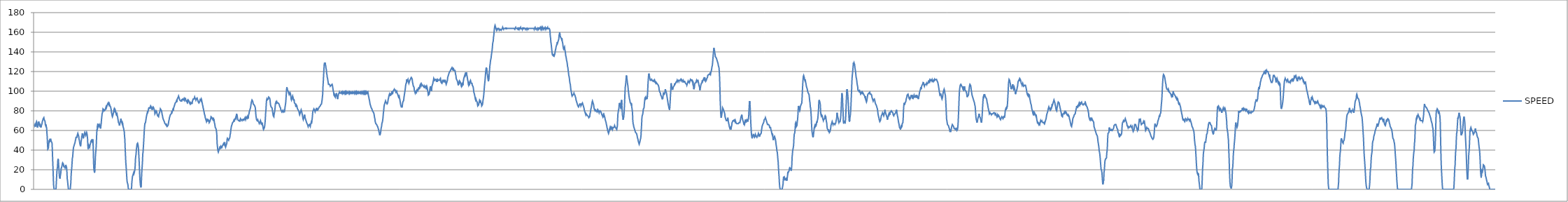
| Category | SPEED |
|---|---|
| 2015-01-01_00:25:59 | 66 |
| 2015-01-01_00:26:00 | 65 |
| 2015-01-01_00:26:01 | 66 |
| 2015-01-01_00:26:02 | 65 |
| 2015-01-01_00:26:03 | 64 |
| 2015-01-01_00:26:03 | 67 |
| 2015-01-01_00:26:05 | 67 |
| 2015-01-01_00:26:06 | 69 |
| 2015-01-01_00:26:07 | 68 |
| 2015-01-01_00:26:08 | 65 |
| 2015-01-01_00:26:09 | 63 |
| 2015-01-01_00:26:10 | 63 |
| 2015-01-01_00:26:11 | 63 |
| 2015-01-01_00:26:12 | 67 |
| 2015-01-01_00:26:13 | 69 |
| 2015-01-01_00:26:14 | 68 |
| 2015-01-01_00:26:15 | 66 |
| 2015-01-01_00:26:16 | 65 |
| 2015-01-01_00:26:17 | 65 |
| 2015-01-01_00:26:18 | 66 |
| 2015-01-01_00:26:19 | 65 |
| 2015-01-01_00:26:20 | 63 |
| 2015-01-01_00:26:21 | 63 |
| 2015-01-01_00:26:22 | 65 |
| 2015-01-01_00:26:23 | 65 |
| 2015-01-01_00:26:24 | 67 |
| 2015-01-01_00:26:25 | 69 |
| 2015-01-01_00:26:26 | 70 |
| 2015-01-01_00:26:27 | 70 |
| 2015-01-01_00:26:28 | 72 |
| 2015-01-01_00:26:29 | 72 |
| 2015-01-01_00:26:30 | 73 |
| 2015-01-01_00:26:31 | 71 |
| 2015-01-01_00:26:32 | 71 |
| 2015-01-01_00:26:33 | 70 |
| 2015-01-01_00:26:34 | 69 |
| 2015-01-01_00:26:35 | 66 |
| 2015-01-01_00:26:36 | 65 |
| 2015-01-01_00:26:37 | 66 |
| 2015-01-01_00:26:38 | 64 |
| 2015-01-01_00:26:39 | 63 |
| 2015-01-01_00:26:40 | 58 |
| 2015-01-01_00:26:41 | 54 |
| 2015-01-01_00:26:42 | 47 |
| 2015-01-01_00:26:43 | 41 |
| 2015-01-01_00:26:44 | 41 |
| 2015-01-01_00:26:45 | 42 |
| 2015-01-01_00:26:46 | 46 |
| 2015-01-01_00:26:47 | 48 |
| 2015-01-01_00:26:48 | 50 |
| 2015-01-01_00:26:49 | 48 |
| 2015-01-01_00:26:50 | 51 |
| 2015-01-01_00:26:51 | 51 |
| 2015-01-01_00:26:52 | 51 |
| 2015-01-01_00:26:53 | 51 |
| 2015-01-01_00:26:54 | 49 |
| 2015-01-01_00:26:55 | 49 |
| 2015-01-01_00:26:56 | 48 |
| 2015-01-01_00:26:57 | 47 |
| 2015-01-01_00:26:58 | 40 |
| 2015-01-01_00:26:59 | 31 |
| 2015-01-01_00:27:00 | 23 |
| 2015-01-01_00:27:01 | 14 |
| 2015-01-01_00:27:02 | 5 |
| 2015-01-01_00:27:03 | 2 |
| 2015-01-01_00:27:04 | 0 |
| 2015-01-01_00:27:05 | 0 |
| 2015-01-01_00:27:06 | 0 |
| 2015-01-01_00:27:07 | 0 |
| 2015-01-01_00:27:08 | 0 |
| 2015-01-01_00:27:09 | 0 |
| 2015-01-01_00:27:10 | 0 |
| 2015-01-01_00:27:11 | 6 |
| 2015-01-01_00:27:12 | 12 |
| 2015-01-01_00:27:13 | 18 |
| 2015-01-01_00:27:14 | 21 |
| 2015-01-01_00:27:15 | 23 |
| 2015-01-01_00:27:16 | 29 |
| 2015-01-01_00:27:17 | 31 |
| 2015-01-01_00:27:18 | 29 |
| 2015-01-01_00:27:19 | 24 |
| 2015-01-01_00:27:20 | 20 |
| 2015-01-01_00:27:21 | 14 |
| 2015-01-01_00:27:22 | 12 |
| 2015-01-01_00:27:23 | 11 |
| 2015-01-01_00:27:24 | 13 |
| 2015-01-01_00:27:25 | 15 |
| 2015-01-01_00:27:26 | 17 |
| 2015-01-01_00:27:27 | 21 |
| 2015-01-01_00:27:28 | 22 |
| 2015-01-01_00:27:29 | 23 |
| 2015-01-01_00:27:30 | 24 |
| 2015-01-01_00:27:31 | 26 |
| 2015-01-01_00:27:32 | 27 |
| 2015-01-01_00:27:33 | 27 |
| 2015-01-01_00:27:34 | 26 |
| 2015-01-01_00:27:35 | 25 |
| 2015-01-01_00:27:36 | 23 |
| 2015-01-01_00:27:37 | 23 |
| 2015-01-01_00:27:38 | 23 |
| 2015-01-01_00:27:39 | 23 |
| 2015-01-01_00:27:40 | 22 |
| 2015-01-01_00:27:41 | 23 |
| 2015-01-01_00:27:42 | 25 |
| 2015-01-01_00:27:43 | 25 |
| 2015-01-01_00:27:44 | 23 |
| 2015-01-01_00:27:45 | 22 |
| 2015-01-01_00:27:46 | 18 |
| 2015-01-01_00:27:47 | 11 |
| 2015-01-01_00:27:48 | 9 |
| 2015-01-01_00:27:49 | 6 |
| 2015-01-01_00:27:50 | 3 |
| 2015-01-01_00:27:51 | 0 |
| 2015-01-01_00:27:52 | 0 |
| 2015-01-01_00:27:53 | 0 |
| 2015-01-01_00:27:54 | 0 |
| 2015-01-01_00:27:55 | 0 |
| 2015-01-01_00:27:56 | 0 |
| 2015-01-01_00:27:57 | 0 |
| 2015-01-01_00:27:58 | 0 |
| 2015-01-01_00:27:59 | 7 |
| 2015-01-01_00:28:00 | 15 |
| 2015-01-01_00:28:01 | 19 |
| 2015-01-01_00:28:02 | 22 |
| 2015-01-01_00:28:03 | 27 |
| 2015-01-01_00:28:04 | 32 |
| 2015-01-01_00:28:05 | 33 |
| 2015-01-01_00:28:06 | 37 |
| 2015-01-01_00:28:07 | 41 |
| 2015-01-01_00:28:08 | 43 |
| 2015-01-01_00:28:09 | 44 |
| 2015-01-01_00:28:10 | 45 |
| 2015-01-01_00:28:11 | 46 |
| 2015-01-01_00:28:12 | 47 |
| 2015-01-01_00:28:13 | 48 |
| 2015-01-01_00:28:14 | 50 |
| 2015-01-01_00:28:15 | 51 |
| 2015-01-01_00:28:16 | 53 |
| 2015-01-01_00:28:17 | 53 |
| 2015-01-01_00:28:18 | 53 |
| 2015-01-01_00:28:19 | 53 |
| 2015-01-01_00:28:20 | 55 |
| 2015-01-01_00:28:21 | 55 |
| 2015-01-01_00:28:22 | 57 |
| 2015-01-01_00:28:23 | 56 |
| 2015-01-01_00:28:24 | 55 |
| 2015-01-01_00:28:25 | 54 |
| 2015-01-01_00:28:26 | 51 |
| 2015-01-01_00:28:27 | 50 |
| 2015-01-01_00:28:28 | 48 |
| 2015-01-01_00:28:29 | 46 |
| 2015-01-01_00:28:30 | 45 |
| 2015-01-01_00:28:31 | 44 |
| 2015-01-01_00:28:32 | 47 |
| 2015-01-01_00:28:33 | 49 |
| 2015-01-01_00:28:34 | 51 |
| 2015-01-01_00:28:35 | 54 |
| 2015-01-01_00:28:36 | 55 |
| 2015-01-01_00:28:37 | 57 |
| 2015-01-01_00:28:38 | 55 |
| 2015-01-01_00:28:39 | 55 |
| 2015-01-01_00:28:40 | 52 |
| 2015-01-01_00:28:41 | 53 |
| 2015-01-01_00:28:42 | 54 |
| 2015-01-01_00:28:43 | 56 |
| 2015-01-01_00:28:44 | 56 |
| 2015-01-01_00:28:45 | 58 |
| 2015-01-01_00:28:46 | 57 |
| 2015-01-01_00:28:47 | 56 |
| 2015-01-01_00:28:48 | 55 |
| 2015-01-01_00:28:49 | 55 |
| 2015-01-01_00:28:50 | 57 |
| 2015-01-01_00:28:51 | 58 |
| 2015-01-01_00:28:52 | 57 |
| 2015-01-01_00:28:53 | 55 |
| 2015-01-01_00:28:54 | 52 |
| 2015-01-01_00:28:55 | 45 |
| 2015-01-01_00:28:56 | 41 |
| 2015-01-01_00:28:57 | 43 |
| 2015-01-01_00:28:58 | 45 |
| 2015-01-01_00:28:59 | 45 |
| 2015-01-01_00:29:00 | 45 |
| 2015-01-01_00:29:01 | 43 |
| 2015-01-01_00:29:02 | 45 |
| 2015-01-01_00:29:03 | 46 |
| 2015-01-01_00:29:04 | 47 |
| 2015-01-01_00:29:05 | 49 |
| 2015-01-01_00:29:06 | 49 |
| 2015-01-01_00:29:07 | 50 |
| 2015-01-01_00:29:08 | 49 |
| 2015-01-01_00:29:09 | 49 |
| 2015-01-01_00:29:10 | 48 |
| 2015-01-01_00:29:11 | 51 |
| 2015-01-01_00:29:12 | 49 |
| 2015-01-01_00:29:13 | 40 |
| 2015-01-01_00:29:14 | 27 |
| 2015-01-01_00:29:15 | 20 |
| 2015-01-01_00:29:16 | 19 |
| 2015-01-01_00:29:17 | 17 |
| 2015-01-01_00:29:18 | 20 |
| 2015-01-01_00:29:19 | 26 |
| 2015-01-01_00:29:20 | 34 |
| 2015-01-01_00:29:21 | 38 |
| 2015-01-01_00:29:22 | 41 |
| 2015-01-01_00:29:23 | 47 |
| 2015-01-01_00:29:24 | 55 |
| 2015-01-01_00:29:25 | 61 |
| 2015-01-01_00:29:26 | 60 |
| 2015-01-01_00:29:27 | 65 |
| 2015-01-01_00:29:28 | 67 |
| 2015-01-01_00:29:29 | 67 |
| 2015-01-01_00:29:30 | 67 |
| 2015-01-01_00:29:31 | 64 |
| 2015-01-01_00:29:32 | 64 |
| 2015-01-01_00:29:33 | 64 |
| 2015-01-01_00:29:34 | 66 |
| 2015-01-01_00:29:35 | 65 |
| 2015-01-01_00:29:36 | 63 |
| 2015-01-01_00:29:37 | 62 |
| 2015-01-01_00:29:38 | 65 |
| 2015-01-01_00:29:39 | 67 |
| 2015-01-01_00:29:40 | 71 |
| 2015-01-01_00:29:41 | 74 |
| 2015-01-01_00:29:42 | 77 |
| 2015-01-01_00:29:43 | 77 |
| 2015-01-01_00:29:44 | 79 |
| 2015-01-01_00:29:45 | 82 |
| 2015-01-01_00:29:46 | 82 |
| 2015-01-01_00:29:47 | 82 |
| 2015-01-01_00:29:48 | 81 |
| 2015-01-01_00:29:49 | 80 |
| 2015-01-01_00:29:50 | 80 |
| 2015-01-01_00:29:51 | 80 |
| 2015-01-01_00:29:52 | 81 |
| 2015-01-01_00:29:53 | 82 |
| 2015-01-01_00:29:54 | 83 |
| 2015-01-01_00:29:55 | 84 |
| 2015-01-01_00:29:56 | 83 |
| 2015-01-01_00:29:57 | 84 |
| 2015-01-01_00:29:58 | 85 |
| 2015-01-01_00:29:59 | 85 |
| 2015-01-01_00:30:00 | 87 |
| 2015-01-01_00:30:01 | 87 |
| 2015-01-01_00:30:02 | 88 |
| 2015-01-01_00:30:03 | 86 |
| 2015-01-01_00:30:04 | 87 |
| 2015-01-01_00:30:05 | 86 |
| 2015-01-01_00:30:06 | 87 |
| 2015-01-01_00:30:07 | 86 |
| 2015-01-01_00:30:08 | 85 |
| 2015-01-01_00:30:09 | 85 |
| 2015-01-01_00:30:10 | 84 |
| 2015-01-01_00:30:11 | 84 |
| 2015-01-01_00:30:12 | 81 |
| 2015-01-01_00:30:13 | 78 |
| 2015-01-01_00:30:14 | 77 |
| 2015-01-01_00:30:15 | 75 |
| 2015-01-01_00:30:16 | 74 |
| 2015-01-01_00:30:17 | 75 |
| 2015-01-01_00:30:18 | 76 |
| 2015-01-01_00:30:19 | 76 |
| 2015-01-01_00:30:20 | 79 |
| 2015-01-01_00:30:21 | 81 |
| 2015-01-01_00:30:22 | 82 |
| 2015-01-01_00:30:23 | 81 |
| 2015-01-01_00:30:24 | 80 |
| 2015-01-01_00:30:25 | 81 |
| 2015-01-01_00:30:26 | 81 |
| 2015-01-01_00:30:27 | 79 |
| 2015-01-01_00:30:28 | 77 |
| 2015-01-01_00:30:29 | 76 |
| 2015-01-01_00:30:30 | 76 |
| 2015-01-01_00:30:31 | 77 |
| 2015-01-01_00:30:32 | 75 |
| 2015-01-01_00:30:33 | 74 |
| 2015-01-01_00:30:34 | 72 |
| 2015-01-01_00:30:35 | 70 |
| 2015-01-01_00:30:36 | 68 |
| 2015-01-01_00:30:37 | 68 |
| 2015-01-01_00:30:38 | 67 |
| 2015-01-01_00:30:39 | 65 |
| 2015-01-01_00:30:40 | 66 |
| 2015-01-01_00:30:41 | 66 |
| 2015-01-01_00:30:42 | 69 |
| 2015-01-01_00:30:43 | 70 |
| 2015-01-01_00:30:44 | 72 |
| 2015-01-01_00:30:45 | 70 |
| 2015-01-01_00:30:46 | 69 |
| 2015-01-01_00:30:47 | 68 |
| 2015-01-01_00:30:48 | 67 |
| 2015-01-01_00:30:49 | 68 |
| 2015-01-01_00:30:50 | 67 |
| 2015-01-01_00:30:51 | 64 |
| 2015-01-01_00:30:52 | 63 |
| 2015-01-01_00:30:53 | 62 |
| 2015-01-01_00:30:54 | 60 |
| 2015-01-01_00:30:55 | 59 |
| 2015-01-01_00:30:56 | 54 |
| 2015-01-01_00:30:57 | 51 |
| 2015-01-01_00:30:58 | 42 |
| 2015-01-01_00:30:59 | 35 |
| 2015-01-01_00:31:00 | 28 |
| 2015-01-01_00:31:01 | 24 |
| 2015-01-01_00:31:02 | 19 |
| 2015-01-01_00:31:03 | 14 |
| 2015-01-01_00:31:04 | 9 |
| 2015-01-01_00:31:05 | 7 |
| 2015-01-01_00:31:06 | 6 |
| 2015-01-01_00:31:07 | 5 |
| 2015-01-01_00:31:08 | 2 |
| 2015-01-01_00:31:09 | 0 |
| 2015-01-01_00:31:10 | 0 |
| 2015-01-01_00:31:11 | 0 |
| 2015-01-01_00:31:12 | 0 |
| 2015-01-01_00:31:13 | 0 |
| 2015-01-01_00:31:14 | 0 |
| 2015-01-01_00:31:15 | 0 |
| 2015-01-01_00:31:16 | 0 |
| 2015-01-01_00:31:17 | 0 |
| 2015-01-01_00:31:18 | 0 |
| 2015-01-01_00:31:19 | 1 |
| 2015-01-01_00:31:20 | 7 |
| 2015-01-01_00:31:21 | 10 |
| 2015-01-01_00:31:22 | 13 |
| 2015-01-01_00:31:23 | 13 |
| 2015-01-01_00:31:24 | 13 |
| 2015-01-01_00:31:25 | 16 |
| 2015-01-01_00:31:26 | 17 |
| 2015-01-01_00:31:27 | 16 |
| 2015-01-01_00:31:28 | 17 |
| 2015-01-01_00:31:29 | 17 |
| 2015-01-01_00:31:30 | 20 |
| 2015-01-01_00:31:31 | 24 |
| 2015-01-01_00:31:32 | 31 |
| 2015-01-01_00:31:33 | 34 |
| 2015-01-01_00:31:34 | 36 |
| 2015-01-01_00:31:35 | 41 |
| 2015-01-01_00:31:36 | 43 |
| 2015-01-01_00:31:37 | 46 |
| 2015-01-01_00:31:38 | 46 |
| 2015-01-01_00:31:39 | 47 |
| 2015-01-01_00:31:40 | 46 |
| 2015-01-01_00:31:41 | 44 |
| 2015-01-01_00:31:42 | 41 |
| 2015-01-01_00:31:43 | 35 |
| 2015-01-01_00:31:44 | 29 |
| 2015-01-01_00:31:45 | 22 |
| 2015-01-01_00:31:46 | 14 |
| 2015-01-01_00:31:47 | 9 |
| 2015-01-01_00:31:48 | 5 |
| 2015-01-01_00:31:49 | 3 |
| 2015-01-01_00:31:50 | 2 |
| 2015-01-01_00:31:51 | 5 |
| 2015-01-01_00:31:52 | 12 |
| 2015-01-01_00:31:53 | 19 |
| 2015-01-01_00:31:54 | 23 |
| 2015-01-01_00:31:55 | 28 |
| 2015-01-01_00:31:56 | 36 |
| 2015-01-01_00:31:57 | 38 |
| 2015-01-01_00:31:58 | 43 |
| 2015-01-01_00:31:59 | 48 |
| 2015-01-01_00:32:00 | 54 |
| 2015-01-01_00:32:01 | 60 |
| 2015-01-01_00:32:02 | 64 |
| 2015-01-01_00:32:03 | 67 |
| 2015-01-01_00:32:04 | 67 |
| 2015-01-01_00:32:05 | 68 |
| 2015-01-01_00:32:06 | 70 |
| 2015-01-01_00:32:07 | 72 |
| 2015-01-01_00:32:08 | 74 |
| 2015-01-01_00:32:09 | 74 |
| 2015-01-01_00:32:10 | 77 |
| 2015-01-01_00:32:11 | 78 |
| 2015-01-01_00:32:12 | 80 |
| 2015-01-01_00:32:13 | 79 |
| 2015-01-01_00:32:14 | 80 |
| 2015-01-01_00:32:15 | 82 |
| 2015-01-01_00:32:16 | 83 |
| 2015-01-01_00:32:17 | 83 |
| 2015-01-01_00:32:18 | 83 |
| 2015-01-01_00:32:19 | 83 |
| 2015-01-01_00:32:20 | 82 |
| 2015-01-01_00:32:21 | 84 |
| 2015-01-01_00:32:22 | 85 |
| 2015-01-01_00:32:23 | 85 |
| 2015-01-01_00:32:24 | 84 |
| 2015-01-01_00:32:25 | 83 |
| 2015-01-01_00:32:26 | 82 |
| 2015-01-01_00:32:27 | 81 |
| 2015-01-01_00:32:28 | 83 |
| 2015-01-01_00:32:29 | 83 |
| 2015-01-01_00:32:30 | 84 |
| 2015-01-01_00:32:31 | 84 |
| 2015-01-01_00:32:32 | 83 |
| 2015-01-01_00:32:33 | 83 |
| 2015-01-01_00:32:34 | 81 |
| 2015-01-01_00:32:35 | 80 |
| 2015-01-01_00:32:36 | 77 |
| 2015-01-01_00:32:37 | 77 |
| 2015-01-01_00:32:38 | 77 |
| 2015-01-01_00:32:39 | 79 |
| 2015-01-01_00:32:40 | 80 |
| 2015-01-01_00:32:41 | 80 |
| 2015-01-01_00:32:42 | 79 |
| 2015-01-01_00:32:43 | 77 |
| 2015-01-01_00:32:44 | 76 |
| 2015-01-01_00:32:45 | 75 |
| 2015-01-01_00:32:46 | 75 |
| 2015-01-01_00:32:47 | 75 |
| 2015-01-01_00:32:48 | 74 |
| 2015-01-01_00:32:49 | 76 |
| 2015-01-01_00:32:50 | 76 |
| 2015-01-01_00:32:51 | 78 |
| 2015-01-01_00:32:52 | 78 |
| 2015-01-01_00:32:53 | 80 |
| 2015-01-01_00:32:54 | 82 |
| 2015-01-01_00:32:55 | 82 |
| 2015-01-01_00:32:56 | 81 |
| 2015-01-01_00:32:57 | 81 |
| 2015-01-01_00:32:58 | 80 |
| 2015-01-01_00:32:59 | 78 |
| 2015-01-01_00:33:00 | 76 |
| 2015-01-01_00:33:01 | 75 |
| 2015-01-01_00:33:02 | 73 |
| 2015-01-01_00:33:03 | 73 |
| 2015-01-01_00:33:04 | 71 |
| 2015-01-01_00:33:05 | 71 |
| 2015-01-01_00:33:06 | 71 |
| 2015-01-01_00:33:07 | 69 |
| 2015-01-01_00:33:08 | 68 |
| 2015-01-01_00:33:09 | 67 |
| 2015-01-01_00:33:10 | 67 |
| 2015-01-01_00:33:11 | 67 |
| 2015-01-01_00:33:12 | 66 |
| 2015-01-01_00:33:13 | 67 |
| 2015-01-01_00:33:14 | 65 |
| 2015-01-01_00:33:15 | 65 |
| 2015-01-01_00:33:16 | 64 |
| 2015-01-01_00:33:17 | 64 |
| 2015-01-01_00:33:18 | 64 |
| 2015-01-01_00:33:19 | 65 |
| 2015-01-01_00:33:20 | 66 |
| 2015-01-01_00:33:21 | 68 |
| 2015-01-01_00:33:22 | 70 |
| 2015-01-01_00:33:23 | 71 |
| 2015-01-01_00:33:24 | 73 |
| 2015-01-01_00:33:25 | 74 |
| 2015-01-01_00:33:26 | 75 |
| 2015-01-01_00:33:27 | 76 |
| 2015-01-01_00:33:28 | 76 |
| 2015-01-01_00:33:29 | 76 |
| 2015-01-01_00:33:30 | 77 |
| 2015-01-01_00:33:31 | 78 |
| 2015-01-01_00:33:32 | 80 |
| 2015-01-01_00:33:33 | 79 |
| 2015-01-01_00:33:34 | 80 |
| 2015-01-01_00:33:35 | 81 |
| 2015-01-01_00:33:36 | 80 |
| 2015-01-01_00:33:37 | 82 |
| 2015-01-01_00:33:38 | 83 |
| 2015-01-01_00:33:39 | 84 |
| 2015-01-01_00:33:40 | 84 |
| 2015-01-01_00:33:41 | 86 |
| 2015-01-01_00:33:42 | 87 |
| 2015-01-01_00:33:43 | 88 |
| 2015-01-01_00:33:44 | 88 |
| 2015-01-01_00:33:45 | 88 |
| 2015-01-01_00:33:46 | 89 |
| 2015-01-01_00:33:47 | 90 |
| 2015-01-01_00:33:48 | 89 |
| 2015-01-01_00:33:49 | 91 |
| 2015-01-01_00:33:50 | 92 |
| 2015-01-01_00:33:51 | 93 |
| 2015-01-01_00:33:52 | 93 |
| 2015-01-01_00:33:53 | 94 |
| 2015-01-01_00:33:54 | 95 |
| 2015-01-01_00:33:55 | 94 |
| 2015-01-01_00:33:56 | 93 |
| 2015-01-01_00:33:57 | 92 |
| 2015-01-01_00:33:58 | 91 |
| 2015-01-01_00:33:59 | 91 |
| 2015-01-01_00:34:00 | 91 |
| 2015-01-01_00:34:01 | 90 |
| 2015-01-01_00:34:02 | 90 |
| 2015-01-01_00:34:03 | 90 |
| 2015-01-01_00:34:04 | 90 |
| 2015-01-01_00:34:05 | 92 |
| 2015-01-01_00:34:06 | 91 |
| 2015-01-01_00:34:07 | 91 |
| 2015-01-01_00:34:08 | 92 |
| 2015-01-01_00:34:09 | 92 |
| 2015-01-01_00:34:10 | 92 |
| 2015-01-01_00:34:11 | 91 |
| 2015-01-01_00:34:12 | 92 |
| 2015-01-01_00:34:13 | 91 |
| 2015-01-01_00:34:14 | 92 |
| 2015-01-01_00:34:15 | 91 |
| 2015-01-01_00:34:16 | 93 |
| 2015-01-01_00:34:17 | 92 |
| 2015-01-01_00:34:18 | 90 |
| 2015-01-01_00:34:19 | 90 |
| 2015-01-01_00:34:20 | 90 |
| 2015-01-01_00:34:21 | 90 |
| 2015-01-01_00:34:22 | 89 |
| 2015-01-01_00:34:23 | 90 |
| 2015-01-01_00:34:24 | 89 |
| 2015-01-01_00:34:25 | 90 |
| 2015-01-01_00:34:26 | 91 |
| 2015-01-01_00:34:27 | 91 |
| 2015-01-01_00:34:28 | 90 |
| 2015-01-01_00:34:29 | 90 |
| 2015-01-01_00:34:30 | 88 |
| 2015-01-01_00:34:31 | 88 |
| 2015-01-01_00:34:32 | 87 |
| 2015-01-01_00:34:33 | 88 |
| 2015-01-01_00:34:34 | 87 |
| 2015-01-01_00:34:35 | 87 |
| 2015-01-01_00:34:36 | 87 |
| 2015-01-01_00:34:37 | 88 |
| 2015-01-01_00:34:38 | 87 |
| 2015-01-01_00:34:39 | 89 |
| 2015-01-01_00:34:40 | 90 |
| 2015-01-01_00:34:41 | 91 |
| 2015-01-01_00:34:42 | 92 |
| 2015-01-01_00:34:43 | 92 |
| 2015-01-01_00:34:44 | 92 |
| 2015-01-01_00:34:45 | 92 |
| 2015-01-01_00:34:46 | 93 |
| 2015-01-01_00:34:47 | 94 |
| 2015-01-01_00:34:48 | 93 |
| 2015-01-01_00:34:49 | 93 |
| 2015-01-01_00:34:50 | 92 |
| 2015-01-01_00:34:51 | 91 |
| 2015-01-01_00:34:52 | 92 |
| 2015-01-01_00:34:53 | 92 |
| 2015-01-01_00:34:54 | 92 |
| 2015-01-01_00:34:55 | 93 |
| 2015-01-01_00:34:56 | 92 |
| 2015-01-01_00:34:57 | 91 |
| 2015-01-01_00:34:58 | 91 |
| 2015-01-01_00:34:59 | 89 |
| 2015-01-01_00:35:00 | 89 |
| 2015-01-01_00:35:01 | 88 |
| 2015-01-01_00:35:02 | 88 |
| 2015-01-01_00:35:03 | 89 |
| 2015-01-01_00:35:04 | 89 |
| 2015-01-01_00:35:05 | 91 |
| 2015-01-01_00:35:06 | 90 |
| 2015-01-01_00:35:07 | 92 |
| 2015-01-01_00:35:08 | 91 |
| 2015-01-01_00:35:09 | 92 |
| 2015-01-01_00:35:10 | 91 |
| 2015-01-01_00:35:11 | 89 |
| 2015-01-01_00:35:12 | 88 |
| 2015-01-01_00:35:13 | 86 |
| 2015-01-01_00:35:14 | 85 |
| 2015-01-01_00:35:15 | 83 |
| 2015-01-01_00:35:16 | 82 |
| 2015-01-01_00:35:17 | 80 |
| 2015-01-01_00:35:18 | 79 |
| 2015-01-01_00:35:19 | 77 |
| 2015-01-01_00:35:20 | 76 |
| 2015-01-01_00:35:21 | 75 |
| 2015-01-01_00:35:22 | 73 |
| 2015-01-01_00:35:23 | 72 |
| 2015-01-01_00:35:24 | 71 |
| 2015-01-01_00:35:25 | 70 |
| 2015-01-01_00:35:26 | 69 |
| 2015-01-01_00:35:27 | 70 |
| 2015-01-01_00:35:28 | 71 |
| 2015-01-01_00:35:29 | 71 |
| 2015-01-01_00:35:30 | 70 |
| 2015-01-01_00:35:31 | 71 |
| 2015-01-01_00:35:32 | 71 |
| 2015-01-01_00:35:33 | 71 |
| 2015-01-01_00:35:34 | 70 |
| 2015-01-01_00:35:35 | 68 |
| 2015-01-01_00:35:36 | 68 |
| 2015-01-01_00:35:37 | 69 |
| 2015-01-01_00:35:38 | 70 |
| 2015-01-01_00:35:39 | 70 |
| 2015-01-01_00:35:40 | 72 |
| 2015-01-01_00:35:41 | 74 |
| 2015-01-01_00:35:42 | 74 |
| 2015-01-01_00:35:43 | 74 |
| 2015-01-01_00:35:44 | 73 |
| 2015-01-01_00:35:45 | 72 |
| 2015-01-01_00:35:46 | 72 |
| 2015-01-01_00:35:47 | 71 |
| 2015-01-01_00:35:48 | 73 |
| 2015-01-01_00:35:49 | 72 |
| 2015-01-01_00:35:50 | 72 |
| 2015-01-01_00:35:51 | 71 |
| 2015-01-01_00:35:52 | 68 |
| 2015-01-01_00:35:53 | 67 |
| 2015-01-01_00:35:54 | 65 |
| 2015-01-01_00:35:55 | 63 |
| 2015-01-01_00:35:56 | 63 |
| 2015-01-01_00:35:57 | 62 |
| 2015-01-01_00:35:58 | 61 |
| 2015-01-01_00:35:59 | 59 |
| 2015-01-01_00:36:00 | 56 |
| 2015-01-01_00:36:01 | 47 |
| 2015-01-01_00:36:02 | 44 |
| 2015-01-01_00:36:03 | 41 |
| 2015-01-01_00:36:04 | 39 |
| 2015-01-01_00:36:05 | 38 |
| 2015-01-01_00:36:06 | 39 |
| 2015-01-01_00:36:07 | 40 |
| 2015-01-01_00:36:08 | 41 |
| 2015-01-01_00:36:09 | 42 |
| 2015-01-01_00:36:10 | 41 |
| 2015-01-01_00:36:11 | 43 |
| 2015-01-01_00:36:12 | 43 |
| 2015-01-01_00:36:13 | 44 |
| 2015-01-01_00:36:14 | 43 |
| 2015-01-01_00:36:15 | 44 |
| 2015-01-01_00:36:16 | 42 |
| 2015-01-01_00:36:17 | 43 |
| 2015-01-01_00:36:18 | 44 |
| 2015-01-01_00:36:19 | 44 |
| 2015-01-01_00:36:20 | 45 |
| 2015-01-01_00:36:21 | 46 |
| 2015-01-01_00:36:22 | 46 |
| 2015-01-01_00:36:23 | 47 |
| 2015-01-01_00:36:24 | 46 |
| 2015-01-01_00:36:25 | 46 |
| 2015-01-01_00:36:26 | 48 |
| 2015-01-01_00:36:27 | 45 |
| 2015-01-01_00:36:28 | 44 |
| 2015-01-01_00:36:29 | 43 |
| 2015-01-01_00:36:30 | 43 |
| 2015-01-01_00:36:31 | 45 |
| 2015-01-01_00:36:32 | 45 |
| 2015-01-01_00:36:33 | 47 |
| 2015-01-01_00:36:34 | 51 |
| 2015-01-01_00:36:35 | 52 |
| 2015-01-01_00:36:36 | 52 |
| 2015-01-01_00:36:37 | 51 |
| 2015-01-01_00:36:38 | 51 |
| 2015-01-01_00:36:39 | 50 |
| 2015-01-01_00:36:40 | 51 |
| 2015-01-01_00:36:41 | 51 |
| 2015-01-01_00:36:42 | 52 |
| 2015-01-01_00:36:43 | 53 |
| 2015-01-01_00:36:44 | 56 |
| 2015-01-01_00:36:45 | 57 |
| 2015-01-01_00:36:46 | 60 |
| 2015-01-01_00:36:47 | 62 |
| 2015-01-01_00:36:48 | 64 |
| 2015-01-01_00:36:49 | 64 |
| 2015-01-01_00:36:50 | 66 |
| 2015-01-01_00:36:51 | 67 |
| 2015-01-01_00:36:52 | 68 |
| 2015-01-01_00:36:53 | 68 |
| 2015-01-01_00:36:54 | 68 |
| 2015-01-01_00:36:55 | 69 |
| 2015-01-01_00:36:56 | 70 |
| 2015-01-01_00:36:57 | 69 |
| 2015-01-01_00:36:58 | 71 |
| 2015-01-01_00:36:59 | 71 |
| 2015-01-01_00:37:00 | 71 |
| 2015-01-01_00:37:01 | 72 |
| 2015-01-01_00:37:02 | 73 |
| 2015-01-01_00:37:03 | 72 |
| 2015-01-01_00:37:04 | 73 |
| 2015-01-01_00:37:05 | 77 |
| 2015-01-01_00:37:06 | 77 |
| 2015-01-01_00:37:07 | 75 |
| 2015-01-01_00:37:08 | 73 |
| 2015-01-01_00:37:09 | 71 |
| 2015-01-01_00:37:10 | 71 |
| 2015-01-01_00:37:11 | 71 |
| 2015-01-01_00:37:12 | 70 |
| 2015-01-01_00:37:13 | 70 |
| 2015-01-01_00:37:14 | 70 |
| 2015-01-01_00:37:15 | 70 |
| 2015-01-01_00:37:16 | 69 |
| 2015-01-01_00:37:17 | 71 |
| 2015-01-01_00:37:18 | 72 |
| 2015-01-01_00:37:19 | 72 |
| 2015-01-01_00:37:20 | 71 |
| 2015-01-01_00:37:21 | 71 |
| 2015-01-01_00:37:22 | 71 |
| 2015-01-01_00:37:23 | 70 |
| 2015-01-01_00:37:24 | 71 |
| 2015-01-01_00:37:25 | 71 |
| 2015-01-01_00:37:26 | 71 |
| 2015-01-01_00:37:27 | 71 |
| 2015-01-01_00:37:28 | 70 |
| 2015-01-01_00:37:29 | 72 |
| 2015-01-01_00:37:30 | 71 |
| 2015-01-01_00:37:31 | 71 |
| 2015-01-01_00:37:32 | 71 |
| 2015-01-01_00:37:33 | 73 |
| 2015-01-01_00:37:34 | 73 |
| 2015-01-01_00:37:35 | 71 |
| 2015-01-01_00:37:36 | 72 |
| 2015-01-01_00:37:37 | 73 |
| 2015-01-01_00:37:38 | 72 |
| 2015-01-01_00:37:39 | 74 |
| 2015-01-01_00:37:40 | 73 |
| 2015-01-01_00:37:41 | 74 |
| 2015-01-01_00:37:42 | 73 |
| 2015-01-01_00:37:43 | 72 |
| 2015-01-01_00:37:44 | 74 |
| 2015-01-01_00:37:45 | 76 |
| 2015-01-01_00:37:46 | 77 |
| 2015-01-01_00:37:47 | 79 |
| 2015-01-01_00:37:48 | 79 |
| 2015-01-01_00:37:49 | 81 |
| 2015-01-01_00:37:50 | 82 |
| 2015-01-01_00:37:51 | 83 |
| 2015-01-01_00:37:52 | 85 |
| 2015-01-01_00:37:53 | 87 |
| 2015-01-01_00:37:54 | 89 |
| 2015-01-01_00:37:55 | 90 |
| 2015-01-01_00:37:56 | 91 |
| 2015-01-01_00:37:57 | 91 |
| 2015-01-01_00:37:58 | 90 |
| 2015-01-01_00:37:59 | 89 |
| 2015-01-01_00:38:00 | 87 |
| 2015-01-01_00:38:01 | 87 |
| 2015-01-01_00:38:02 | 87 |
| 2015-01-01_00:38:03 | 86 |
| 2015-01-01_00:38:04 | 86 |
| 2015-01-01_00:38:05 | 85 |
| 2015-01-01_00:38:06 | 84 |
| 2015-01-01_00:38:07 | 83 |
| 2015-01-01_00:38:08 | 79 |
| 2015-01-01_00:38:09 | 75 |
| 2015-01-01_00:38:10 | 73 |
| 2015-01-01_00:38:11 | 71 |
| 2015-01-01_00:38:12 | 71 |
| 2015-01-01_00:38:13 | 70 |
| 2015-01-01_00:38:14 | 70 |
| 2015-01-01_00:38:15 | 71 |
| 2015-01-01_00:38:16 | 70 |
| 2015-01-01_00:38:17 | 70 |
| 2015-01-01_00:38:18 | 70 |
| 2015-01-01_00:38:19 | 68 |
| 2015-01-01_00:38:20 | 67 |
| 2015-01-01_00:38:21 | 67 |
| 2015-01-01_00:38:22 | 68 |
| 2015-01-01_00:38:23 | 68 |
| 2015-01-01_00:38:24 | 70 |
| 2015-01-01_00:38:25 | 69 |
| 2015-01-01_00:38:26 | 68 |
| 2015-01-01_00:38:27 | 66 |
| 2015-01-01_00:38:28 | 67 |
| 2015-01-01_00:38:29 | 68 |
| 2015-01-01_00:38:30 | 68 |
| 2015-01-01_00:38:31 | 65 |
| 2015-01-01_00:38:32 | 64 |
| 2015-01-01_00:38:33 | 62 |
| 2015-01-01_00:38:34 | 61 |
| 2015-01-01_00:38:35 | 61 |
| 2015-01-01_00:38:36 | 61 |
| 2015-01-01_00:38:37 | 63 |
| 2015-01-01_00:38:38 | 65 |
| 2015-01-01_00:38:39 | 68 |
| 2015-01-01_00:38:40 | 72 |
| 2015-01-01_00:38:41 | 78 |
| 2015-01-01_00:38:42 | 81 |
| 2015-01-01_00:38:43 | 87 |
| 2015-01-01_00:38:44 | 91 |
| 2015-01-01_00:38:45 | 92 |
| 2015-01-01_00:38:46 | 91 |
| 2015-01-01_00:38:47 | 91 |
| 2015-01-01_00:38:48 | 91 |
| 2015-01-01_00:38:49 | 92 |
| 2015-01-01_00:38:50 | 93 |
| 2015-01-01_00:38:51 | 94 |
| 2015-01-01_00:38:52 | 94 |
| 2015-01-01_00:38:53 | 94 |
| 2015-01-01_00:38:54 | 93 |
| 2015-01-01_00:38:55 | 92 |
| 2015-01-01_00:38:56 | 89 |
| 2015-01-01_00:38:57 | 86 |
| 2015-01-01_00:38:58 | 85 |
| 2015-01-01_00:38:59 | 84 |
| 2015-01-01_00:39:00 | 84 |
| 2015-01-01_00:39:01 | 84 |
| 2015-01-01_00:39:02 | 83 |
| 2015-01-01_00:39:03 | 81 |
| 2015-01-01_00:39:04 | 79 |
| 2015-01-01_00:39:05 | 77 |
| 2015-01-01_00:39:06 | 75 |
| 2015-01-01_00:39:07 | 75 |
| 2015-01-01_00:39:08 | 74 |
| 2015-01-01_00:39:09 | 77 |
| 2015-01-01_00:39:10 | 78 |
| 2015-01-01_00:39:11 | 80 |
| 2015-01-01_00:39:12 | 83 |
| 2015-01-01_00:39:13 | 87 |
| 2015-01-01_00:39:14 | 88 |
| 2015-01-01_00:39:15 | 89 |
| 2015-01-01_00:39:16 | 89 |
| 2015-01-01_00:39:17 | 88 |
| 2015-01-01_00:39:18 | 89 |
| 2015-01-01_00:39:19 | 88 |
| 2015-01-01_00:39:20 | 88 |
| 2015-01-01_00:39:21 | 88 |
| 2015-01-01_00:39:22 | 88 |
| 2015-01-01_00:39:23 | 88 |
| 2015-01-01_00:39:24 | 88 |
| 2015-01-01_00:39:25 | 87 |
| 2015-01-01_00:39:26 | 87 |
| 2015-01-01_00:39:27 | 85 |
| 2015-01-01_00:39:28 | 84 |
| 2015-01-01_00:39:29 | 84 |
| 2015-01-01_00:39:30 | 83 |
| 2015-01-01_00:39:31 | 81 |
| 2015-01-01_00:39:32 | 81 |
| 2015-01-01_00:39:33 | 80 |
| 2015-01-01_00:39:34 | 79 |
| 2015-01-01_00:39:35 | 79 |
| 2015-01-01_00:39:36 | 80 |
| 2015-01-01_00:39:37 | 80 |
| 2015-01-01_00:39:38 | 79 |
| 2015-01-01_00:39:39 | 80 |
| 2015-01-01_00:39:40 | 79 |
| 2015-01-01_00:39:41 | 79 |
| 2015-01-01_00:39:42 | 79 |
| 2015-01-01_00:39:43 | 79 |
| 2015-01-01_00:39:44 | 81 |
| 2015-01-01_00:39:45 | 84 |
| 2015-01-01_00:39:46 | 86 |
| 2015-01-01_00:39:47 | 88 |
| 2015-01-01_00:39:48 | 92 |
| 2015-01-01_00:39:49 | 97 |
| 2015-01-01_00:39:50 | 102 |
| 2015-01-01_00:39:51 | 104 |
| 2015-01-01_00:39:52 | 102 |
| 2015-01-01_00:39:53 | 102 |
| 2015-01-01_00:39:54 | 102 |
| 2015-01-01_00:39:55 | 100 |
| 2015-01-01_00:39:56 | 99 |
| 2015-01-01_00:39:57 | 99 |
| 2015-01-01_00:39:58 | 97 |
| 2015-01-01_00:39:59 | 98 |
| 2015-01-01_00:40:00 | 98 |
| 2015-01-01_00:40:01 | 97 |
| 2015-01-01_00:40:02 | 98 |
| 2015-01-01_00:40:03 | 97 |
| 2015-01-01_00:40:04 | 95 |
| 2015-01-01_00:40:05 | 92 |
| 2015-01-01_00:40:06 | 91 |
| 2015-01-01_00:40:07 | 91 |
| 2015-01-01_00:40:08 | 93 |
| 2015-01-01_00:40:09 | 94 |
| 2015-01-01_00:40:10 | 95 |
| 2015-01-01_00:40:11 | 94 |
| 2015-01-01_00:40:12 | 94 |
| 2015-01-01_00:40:13 | 91 |
| 2015-01-01_00:40:14 | 92 |
| 2015-01-01_00:40:15 | 90 |
| 2015-01-01_00:40:16 | 88 |
| 2015-01-01_00:40:17 | 88 |
| 2015-01-01_00:40:18 | 88 |
| 2015-01-01_00:40:19 | 87 |
| 2015-01-01_00:40:20 | 85 |
| 2015-01-01_00:40:21 | 84 |
| 2015-01-01_00:40:22 | 86 |
| 2015-01-01_00:40:23 | 86 |
| 2015-01-01_00:40:24 | 85 |
| 2015-01-01_00:40:25 | 83 |
| 2015-01-01_00:40:26 | 82 |
| 2015-01-01_00:40:27 | 82 |
| 2015-01-01_00:40:28 | 81 |
| 2015-01-01_00:40:29 | 81 |
| 2015-01-01_00:40:30 | 81 |
| 2015-01-01_00:40:31 | 79 |
| 2015-01-01_00:40:32 | 77 |
| 2015-01-01_00:40:33 | 76 |
| 2015-01-01_00:40:34 | 76 |
| 2015-01-01_00:40:35 | 78 |
| 2015-01-01_00:40:36 | 79 |
| 2015-01-01_00:40:37 | 80 |
| 2015-01-01_00:40:38 | 81 |
| 2015-01-01_00:40:39 | 80 |
| 2015-01-01_00:40:40 | 79 |
| 2015-01-01_00:40:41 | 77 |
| 2015-01-01_00:40:42 | 76 |
| 2015-01-01_00:40:43 | 74 |
| 2015-01-01_00:40:44 | 72 |
| 2015-01-01_00:40:45 | 71 |
| 2015-01-01_00:40:46 | 72 |
| 2015-01-01_00:40:47 | 72 |
| 2015-01-01_00:40:48 | 74 |
| 2015-01-01_00:40:49 | 76 |
| 2015-01-01_00:40:50 | 75 |
| 2015-01-01_00:40:51 | 73 |
| 2015-01-01_00:40:52 | 72 |
| 2015-01-01_00:40:53 | 71 |
| 2015-01-01_00:40:54 | 70 |
| 2015-01-01_00:40:55 | 69 |
| 2015-01-01_00:40:56 | 68 |
| 2015-01-01_00:40:57 | 68 |
| 2015-01-01_00:40:58 | 68 |
| 2015-01-01_00:40:59 | 66 |
| 2015-01-01_00:41:00 | 66 |
| 2015-01-01_00:41:01 | 64 |
| 2015-01-01_00:41:02 | 65 |
| 2015-01-01_00:41:03 | 65 |
| 2015-01-01_00:41:04 | 65 |
| 2015-01-01_00:41:05 | 66 |
| 2015-01-01_00:41:06 | 66 |
| 2015-01-01_00:41:07 | 66 |
| 2015-01-01_00:41:08 | 64 |
| 2015-01-01_00:41:09 | 66 |
| 2015-01-01_00:41:10 | 66 |
| 2015-01-01_00:41:11 | 68 |
| 2015-01-01_00:41:12 | 67 |
| 2015-01-01_00:41:13 | 70 |
| 2015-01-01_00:41:14 | 71 |
| 2015-01-01_00:41:15 | 74 |
| 2015-01-01_00:41:16 | 78 |
| 2015-01-01_00:41:17 | 80 |
| 2015-01-01_00:41:18 | 80 |
| 2015-01-01_00:41:19 | 81 |
| 2015-01-01_00:41:20 | 82 |
| 2015-01-01_00:41:21 | 82 |
| 2015-01-01_00:41:22 | 81 |
| 2015-01-01_00:41:23 | 80 |
| 2015-01-01_00:41:24 | 79 |
| 2015-01-01_00:41:25 | 80 |
| 2015-01-01_00:41:26 | 80 |
| 2015-01-01_00:41:27 | 80 |
| 2015-01-01_00:41:28 | 82 |
| 2015-01-01_00:41:29 | 83 |
| 2015-01-01_00:41:30 | 83 |
| 2015-01-01_00:41:31 | 80 |
| 2015-01-01_00:41:32 | 81 |
| 2015-01-01_00:41:33 | 81 |
| 2015-01-01_00:41:34 | 81 |
| 2015-01-01_00:41:35 | 82 |
| 2015-01-01_00:41:36 | 83 |
| 2015-01-01_00:41:37 | 83 |
| 2015-01-01_00:41:38 | 84 |
| 2015-01-01_00:41:39 | 84 |
| 2015-01-01_00:41:40 | 84 |
| 2015-01-01_00:41:41 | 85 |
| 2015-01-01_00:41:42 | 86 |
| 2015-01-01_00:41:43 | 86 |
| 2015-01-01_00:41:44 | 86 |
| 2015-01-01_00:41:45 | 87 |
| 2015-01-01_00:41:46 | 89 |
| 2015-01-01_00:41:47 | 91 |
| 2015-01-01_00:41:48 | 94 |
| 2015-01-01_00:41:49 | 97 |
| 2015-01-01_00:41:50 | 105 |
| 2015-01-01_00:41:51 | 110 |
| 2015-01-01_00:41:52 | 116 |
| 2015-01-01_00:41:53 | 122 |
| 2015-01-01_00:41:54 | 127 |
| 2015-01-01_00:41:55 | 129 |
| 2015-01-01_00:41:56 | 128 |
| 2015-01-01_00:41:57 | 129 |
| 2015-01-01_00:41:58 | 127 |
| 2015-01-01_00:41:59 | 126 |
| 2015-01-01_00:42:00 | 123 |
| 2015-01-01_00:42:01 | 122 |
| 2015-01-01_00:42:02 | 118 |
| 2015-01-01_00:42:03 | 117 |
| 2015-01-01_00:42:04 | 114 |
| 2015-01-01_00:42:05 | 113 |
| 2015-01-01_00:42:06 | 111 |
| 2015-01-01_00:42:07 | 109 |
| 2015-01-01_00:42:08 | 107 |
| 2015-01-01_00:42:09 | 107 |
| 2015-01-01_00:42:10 | 107 |
| 2015-01-01_00:42:11 | 107 |
| 2015-01-01_00:42:12 | 107 |
| 2015-01-01_00:42:13 | 106 |
| 2015-01-01_00:42:14 | 105 |
| 2015-01-01_00:42:15 | 105 |
| 2015-01-01_00:42:16 | 105 |
| 2015-01-01_00:42:17 | 106 |
| 2015-01-01_00:42:18 | 106 |
| 2015-01-01_00:42:19 | 106 |
| 2015-01-01_00:42:20 | 107 |
| 2015-01-01_00:42:21 | 106 |
| 2015-01-01_00:42:22 | 104 |
| 2015-01-01_00:42:23 | 102 |
| 2015-01-01_00:42:24 | 100 |
| 2015-01-01_00:42:25 | 99 |
| 2015-01-01_00:42:26 | 96 |
| 2015-01-01_00:42:27 | 96 |
| 2015-01-01_00:42:28 | 95 |
| 2015-01-01_00:42:29 | 96 |
| 2015-01-01_00:42:30 | 96 |
| 2015-01-01_00:42:31 | 94 |
| 2015-01-01_00:42:32 | 94 |
| 2015-01-01_00:42:33 | 96 |
| 2015-01-01_00:42:34 | 98 |
| 2015-01-01_00:42:35 | 97 |
| 2015-01-01_00:42:36 | 96 |
| 2015-01-01_00:42:37 | 95 |
| 2015-01-01_00:42:38 | 92 |
| 2015-01-01_00:42:39 | 94 |
| 2015-01-01_00:42:40 | 95 |
| 2015-01-01_00:42:41 | 97 |
| 2015-01-01_00:42:42 | 97 |
| 2015-01-01_00:42:43 | 98 |
| 2015-01-01_00:42:44 | 99 |
| 2015-01-01_00:42:45 | 98 |
| 2015-01-01_00:42:46 | 98 |
| 2015-01-01_00:42:47 | 98 |
| 2015-01-01_00:42:48 | 98 |
| 2015-01-01_00:42:49 | 98 |
| 2015-01-01_00:42:50 | 99 |
| 2015-01-01_00:42:51 | 98 |
| 2015-01-01_00:42:52 | 98 |
| 2015-01-01_00:42:53 | 99 |
| 2015-01-01_00:42:54 | 98 |
| 2015-01-01_00:42:55 | 99 |
| 2015-01-01_00:42:56 | 98 |
| 2015-01-01_00:42:57 | 98 |
| 2015-01-01_00:42:58 | 99 |
| 2015-01-01_00:42:59 | 98 |
| 2015-01-01_00:43:00 | 98 |
| 2015-01-01_00:43:01 | 99 |
| 2015-01-01_00:43:02 | 98 |
| 2015-01-01_00:43:03 | 99 |
| 2015-01-01_00:43:04 | 98 |
| 2015-01-01_00:43:05 | 99 |
| 2015-01-01_00:43:06 | 98 |
| 2015-01-01_00:43:07 | 99 |
| 2015-01-01_00:43:08 | 98 |
| 2015-01-01_00:43:09 | 98 |
| 2015-01-01_00:43:10 | 99 |
| 2015-01-01_00:43:11 | 98 |
| 2015-01-01_00:43:12 | 98 |
| 2015-01-01_00:43:13 | 98 |
| 2015-01-01_00:43:14 | 99 |
| 2015-01-01_00:43:15 | 98 |
| 2015-01-01_00:43:16 | 99 |
| 2015-01-01_00:43:17 | 98 |
| 2015-01-01_00:43:18 | 99 |
| 2015-01-01_00:43:19 | 99 |
| 2015-01-01_00:43:20 | 98 |
| 2015-01-01_00:43:21 | 99 |
| 2015-01-01_00:43:22 | 99 |
| 2015-01-01_00:43:23 | 98 |
| 2015-01-01_00:43:24 | 98 |
| 2015-01-01_00:43:25 | 99 |
| 2015-01-01_00:43:26 | 98 |
| 2015-01-01_00:43:27 | 98 |
| 2015-01-01_00:43:28 | 99 |
| 2015-01-01_00:43:29 | 98 |
| 2015-01-01_00:43:30 | 98 |
| 2015-01-01_00:43:31 | 98 |
| 2015-01-01_00:43:32 | 99 |
| 2015-01-01_00:43:33 | 98 |
| 2015-01-01_00:43:34 | 99 |
| 2015-01-01_00:43:35 | 98 |
| 2015-01-01_00:43:36 | 98 |
| 2015-01-01_00:43:37 | 99 |
| 2015-01-01_00:43:38 | 98 |
| 2015-01-01_00:43:39 | 99 |
| 2015-01-01_00:43:40 | 98 |
| 2015-01-01_00:43:41 | 99 |
| 2015-01-01_00:43:42 | 98 |
| 2015-01-01_00:43:43 | 98 |
| 2015-01-01_00:43:44 | 99 |
| 2015-01-01_00:43:45 | 98 |
| 2015-01-01_00:43:46 | 98 |
| 2015-01-01_00:43:47 | 99 |
| 2015-01-01_00:43:48 | 98 |
| 2015-01-01_00:43:49 | 98 |
| 2015-01-01_00:43:50 | 98 |
| 2015-01-01_00:43:51 | 99 |
| 2015-01-01_00:43:52 | 98 |
| 2015-01-01_00:43:53 | 98 |
| 2015-01-01_00:43:54 | 99 |
| 2015-01-01_00:43:55 | 98 |
| 2015-01-01_00:43:56 | 98 |
| 2015-01-01_00:43:57 | 99 |
| 2015-01-01_00:43:58 | 98 |
| 2015-01-01_00:43:59 | 99 |
| 2015-01-01_00:44:00 | 98 |
| 2015-01-01_00:44:01 | 98 |
| 2015-01-01_00:44:02 | 99 |
| 2015-01-01_00:44:03 | 98 |
| 2015-01-01_00:44:04 | 99 |
| 2015-01-01_00:44:05 | 98 |
| 2015-01-01_00:44:06 | 99 |
| 2015-01-01_00:44:07 | 98 |
| 2015-01-01_00:44:08 | 99 |
| 2015-01-01_00:44:09 | 98 |
| 2015-01-01_00:44:10 | 99 |
| 2015-01-01_00:44:11 | 98 |
| 2015-01-01_00:44:12 | 99 |
| 2015-01-01_00:44:13 | 98 |
| 2015-01-01_00:44:14 | 98 |
| 2015-01-01_00:44:15 | 99 |
| 2015-01-01_00:44:16 | 98 |
| 2015-01-01_00:44:17 | 98 |
| 2015-01-01_00:44:18 | 99 |
| 2015-01-01_00:44:19 | 97 |
| 2015-01-01_00:44:20 | 95 |
| 2015-01-01_00:44:21 | 94 |
| 2015-01-01_00:44:22 | 92 |
| 2015-01-01_00:44:23 | 91 |
| 2015-01-01_00:44:24 | 89 |
| 2015-01-01_00:44:25 | 87 |
| 2015-01-01_00:44:26 | 87 |
| 2015-01-01_00:44:27 | 85 |
| 2015-01-01_00:44:28 | 84 |
| 2015-01-01_00:44:29 | 83 |
| 2015-01-01_00:44:30 | 83 |
| 2015-01-01_00:44:31 | 82 |
| 2015-01-01_00:44:32 | 81 |
| 2015-01-01_00:44:33 | 80 |
| 2015-01-01_00:44:34 | 80 |
| 2015-01-01_00:44:35 | 79 |
| 2015-01-01_00:44:36 | 79 |
| 2015-01-01_00:44:37 | 78 |
| 2015-01-01_00:44:38 | 77 |
| 2015-01-01_00:44:39 | 75 |
| 2015-01-01_00:44:40 | 73 |
| 2015-01-01_00:44:41 | 72 |
| 2015-01-01_00:44:42 | 69 |
| 2015-01-01_00:44:43 | 69 |
| 2015-01-01_00:44:44 | 67 |
| 2015-01-01_00:44:45 | 67 |
| 2015-01-01_00:44:46 | 67 |
| 2015-01-01_00:44:47 | 66 |
| 2015-01-01_00:44:48 | 65 |
| 2015-01-01_00:44:49 | 65 |
| 2015-01-01_00:44:50 | 64 |
| 2015-01-01_00:44:51 | 63 |
| 2015-01-01_00:44:52 | 63 |
| 2015-01-01_00:44:53 | 61 |
| 2015-01-01_00:44:54 | 61 |
| 2015-01-01_00:44:55 | 58 |
| 2015-01-01_00:44:56 | 57 |
| 2015-01-01_00:44:57 | 55 |
| 2015-01-01_00:44:58 | 55 |
| 2015-01-01_00:44:59 | 57 |
| 2015-01-01_00:45:00 | 58 |
| 2015-01-01_00:45:01 | 61 |
| 2015-01-01_00:45:02 | 63 |
| 2015-01-01_00:45:03 | 64 |
| 2015-01-01_00:45:04 | 67 |
| 2015-01-01_00:45:05 | 68 |
| 2015-01-01_00:45:06 | 69 |
| 2015-01-01_00:45:07 | 71 |
| 2015-01-01_00:45:08 | 74 |
| 2015-01-01_00:45:09 | 78 |
| 2015-01-01_00:45:10 | 80 |
| 2015-01-01_00:45:11 | 84 |
| 2015-01-01_00:45:12 | 86 |
| 2015-01-01_00:45:13 | 86 |
| 2015-01-01_00:45:14 | 86 |
| 2015-01-01_00:45:15 | 89 |
| 2015-01-01_00:45:16 | 90 |
| 2015-01-01_00:45:17 | 89 |
| 2015-01-01_00:45:18 | 89 |
| 2015-01-01_00:45:19 | 88 |
| 2015-01-01_00:45:20 | 88 |
| 2015-01-01_00:45:21 | 87 |
| 2015-01-01_00:45:22 | 87 |
| 2015-01-01_00:45:23 | 88 |
| 2015-01-01_00:45:24 | 90 |
| 2015-01-01_00:45:25 | 92 |
| 2015-01-01_00:45:26 | 93 |
| 2015-01-01_00:45:27 | 95 |
| 2015-01-01_00:45:28 | 96 |
| 2015-01-01_00:45:29 | 97 |
| 2015-01-01_00:45:30 | 96 |
| 2015-01-01_00:45:31 | 96 |
| 2015-01-01_00:45:32 | 97 |
| 2015-01-01_00:45:33 | 96 |
| 2015-01-01_00:45:34 | 96 |
| 2015-01-01_00:45:35 | 96 |
| 2015-01-01_00:45:36 | 97 |
| 2015-01-01_00:45:37 | 100 |
| 2015-01-01_00:45:38 | 98 |
| 2015-01-01_00:45:39 | 97 |
| 2015-01-01_00:45:40 | 99 |
| 2015-01-01_00:45:41 | 100 |
| 2015-01-01_00:45:42 | 100 |
| 2015-01-01_00:45:43 | 101 |
| 2015-01-01_00:45:44 | 101 |
| 2015-01-01_00:45:45 | 102 |
| 2015-01-01_00:45:46 | 101 |
| 2015-01-01_00:45:47 | 101 |
| 2015-01-01_00:45:48 | 101 |
| 2015-01-01_00:45:49 | 101 |
| 2015-01-01_00:45:50 | 99 |
| 2015-01-01_00:45:51 | 99 |
| 2015-01-01_00:45:52 | 99 |
| 2015-01-01_00:45:53 | 100 |
| 2015-01-01_00:45:54 | 98 |
| 2015-01-01_00:45:55 | 98 |
| 2015-01-01_00:45:56 | 97 |
| 2015-01-01_00:45:57 | 97 |
| 2015-01-01_00:45:58 | 95 |
| 2015-01-01_00:45:59 | 94 |
| 2015-01-01_00:46:00 | 94 |
| 2015-01-01_00:46:01 | 95 |
| 2015-01-01_00:46:02 | 93 |
| 2015-01-01_00:46:03 | 92 |
| 2015-01-01_00:46:04 | 90 |
| 2015-01-01_00:46:05 | 88 |
| 2015-01-01_00:46:06 | 86 |
| 2015-01-01_00:46:07 | 85 |
| 2015-01-01_00:46:08 | 84 |
| 2015-01-01_00:46:09 | 84 |
| 2015-01-01_00:46:10 | 84 |
| 2015-01-01_00:46:11 | 84 |
| 2015-01-01_00:46:12 | 87 |
| 2015-01-01_00:46:13 | 89 |
| 2015-01-01_00:46:14 | 89 |
| 2015-01-01_00:46:15 | 90 |
| 2015-01-01_00:46:16 | 91 |
| 2015-01-01_00:46:17 | 94 |
| 2015-01-01_00:46:18 | 96 |
| 2015-01-01_00:46:19 | 98 |
| 2015-01-01_00:46:20 | 100 |
| 2015-01-01_00:46:21 | 102 |
| 2015-01-01_00:46:22 | 105 |
| 2015-01-01_00:46:23 | 107 |
| 2015-01-01_00:46:24 | 108 |
| 2015-01-01_00:46:25 | 109 |
| 2015-01-01_00:46:26 | 112 |
| 2015-01-01_00:46:27 | 110 |
| 2015-01-01_00:46:28 | 110 |
| 2015-01-01_00:46:29 | 110 |
| 2015-01-01_00:46:30 | 112 |
| 2015-01-01_00:46:31 | 110 |
| 2015-01-01_00:46:32 | 109 |
| 2015-01-01_00:46:33 | 108 |
| 2015-01-01_00:46:34 | 109 |
| 2015-01-01_00:46:35 | 109 |
| 2015-01-01_00:46:36 | 111 |
| 2015-01-01_00:46:37 | 111 |
| 2015-01-01_00:46:38 | 112 |
| 2015-01-01_00:46:39 | 113 |
| 2015-01-01_00:46:40 | 113 |
| 2015-01-01_00:46:41 | 114 |
| 2015-01-01_00:46:42 | 114 |
| 2015-01-01_00:46:43 | 113 |
| 2015-01-01_00:46:44 | 112 |
| 2015-01-01_00:46:45 | 109 |
| 2015-01-01_00:46:46 | 108 |
| 2015-01-01_00:46:47 | 106 |
| 2015-01-01_00:46:48 | 105 |
| 2015-01-01_00:46:49 | 105 |
| 2015-01-01_00:46:50 | 104 |
| 2015-01-01_00:46:51 | 101 |
| 2015-01-01_00:46:52 | 100 |
| 2015-01-01_00:46:53 | 99 |
| 2015-01-01_00:46:54 | 98 |
| 2015-01-01_00:46:55 | 99 |
| 2015-01-01_00:46:56 | 99 |
| 2015-01-01_00:46:57 | 100 |
| 2015-01-01_00:46:58 | 99 |
| 2015-01-01_00:46:59 | 100 |
| 2015-01-01_00:47:00 | 101 |
| 2015-01-01_00:47:01 | 100 |
| 2015-01-01_00:47:02 | 102 |
| 2015-01-01_00:47:03 | 101 |
| 2015-01-01_00:47:04 | 101 |
| 2015-01-01_00:47:05 | 101 |
| 2015-01-01_00:47:06 | 104 |
| 2015-01-01_00:47:07 | 102 |
| 2015-01-01_00:47:08 | 104 |
| 2015-01-01_00:47:09 | 104 |
| 2015-01-01_00:47:10 | 106 |
| 2015-01-01_00:47:11 | 105 |
| 2015-01-01_00:47:12 | 106 |
| 2015-01-01_00:47:13 | 107 |
| 2015-01-01_00:47:14 | 106 |
| 2015-01-01_00:47:15 | 107 |
| 2015-01-01_00:47:16 | 106 |
| 2015-01-01_00:47:17 | 106 |
| 2015-01-01_00:47:18 | 106 |
| 2015-01-01_00:47:19 | 106 |
| 2015-01-01_00:47:20 | 105 |
| 2015-01-01_00:47:21 | 105 |
| 2015-01-01_00:47:22 | 105 |
| 2015-01-01_00:47:23 | 104 |
| 2015-01-01_00:47:24 | 105 |
| 2015-01-01_00:47:25 | 104 |
| 2015-01-01_00:47:26 | 104 |
| 2015-01-01_00:47:27 | 104 |
| 2015-01-01_00:47:28 | 105 |
| 2015-01-01_00:47:29 | 104 |
| 2015-01-01_00:47:30 | 102 |
| 2015-01-01_00:47:31 | 104 |
| 2015-01-01_00:47:32 | 105 |
| 2015-01-01_00:47:33 | 104 |
| 2015-01-01_00:47:34 | 104 |
| 2015-01-01_00:47:35 | 100 |
| 2015-01-01_00:47:36 | 99 |
| 2015-01-01_00:47:37 | 96 |
| 2015-01-01_00:47:38 | 96 |
| 2015-01-01_00:47:39 | 96 |
| 2015-01-01_00:47:40 | 97 |
| 2015-01-01_00:47:41 | 99 |
| 2015-01-01_00:47:42 | 102 |
| 2015-01-01_00:47:43 | 102 |
| 2015-01-01_00:47:44 | 105 |
| 2015-01-01_00:47:45 | 104 |
| 2015-01-01_00:47:46 | 102 |
| 2015-01-01_00:47:47 | 100 |
| 2015-01-01_00:47:48 | 102 |
| 2015-01-01_00:47:49 | 105 |
| 2015-01-01_00:47:50 | 106 |
| 2015-01-01_00:47:51 | 107 |
| 2015-01-01_00:47:52 | 108 |
| 2015-01-01_00:47:53 | 110 |
| 2015-01-01_00:47:54 | 111 |
| 2015-01-01_00:47:55 | 113 |
| 2015-01-01_00:47:56 | 113 |
| 2015-01-01_00:47:57 | 113 |
| 2015-01-01_00:47:58 | 111 |
| 2015-01-01_00:47:59 | 111 |
| 2015-01-01_00:48:00 | 112 |
| 2015-01-01_00:48:01 | 112 |
| 2015-01-01_00:48:02 | 112 |
| 2015-01-01_00:48:03 | 112 |
| 2015-01-01_00:48:04 | 110 |
| 2015-01-01_00:48:05 | 110 |
| 2015-01-01_00:48:06 | 110 |
| 2015-01-01_00:48:07 | 110 |
| 2015-01-01_00:48:08 | 112 |
| 2015-01-01_00:48:09 | 112 |
| 2015-01-01_00:48:10 | 112 |
| 2015-01-01_00:48:11 | 111 |
| 2015-01-01_00:48:12 | 111 |
| 2015-01-01_00:48:13 | 111 |
| 2015-01-01_00:48:14 | 111 |
| 2015-01-01_00:48:15 | 112 |
| 2015-01-01_00:48:16 | 112 |
| 2015-01-01_00:48:17 | 113 |
| 2015-01-01_00:48:18 | 111 |
| 2015-01-01_00:48:19 | 109 |
| 2015-01-01_00:48:20 | 109 |
| 2015-01-01_00:48:21 | 109 |
| 2015-01-01_00:48:22 | 108 |
| 2015-01-01_00:48:23 | 109 |
| 2015-01-01_00:48:24 | 111 |
| 2015-01-01_00:48:25 | 111 |
| 2015-01-01_00:48:26 | 111 |
| 2015-01-01_00:48:27 | 111 |
| 2015-01-01_00:48:28 | 111 |
| 2015-01-01_00:48:29 | 109 |
| 2015-01-01_00:48:30 | 111 |
| 2015-01-01_00:48:31 | 111 |
| 2015-01-01_00:48:32 | 111 |
| 2015-01-01_00:48:33 | 111 |
| 2015-01-01_00:48:34 | 110 |
| 2015-01-01_00:48:35 | 108 |
| 2015-01-01_00:48:36 | 107 |
| 2015-01-01_00:48:37 | 108 |
| 2015-01-01_00:48:38 | 109 |
| 2015-01-01_00:48:39 | 110 |
| 2015-01-01_00:48:40 | 111 |
| 2015-01-01_00:48:41 | 114 |
| 2015-01-01_00:48:42 | 115 |
| 2015-01-01_00:48:43 | 116 |
| 2015-01-01_00:48:44 | 117 |
| 2015-01-01_00:48:45 | 118 |
| 2015-01-01_00:48:46 | 119 |
| 2015-01-01_00:48:47 | 119 |
| 2015-01-01_00:48:48 | 120 |
| 2015-01-01_00:48:49 | 120 |
| 2015-01-01_00:48:50 | 121 |
| 2015-01-01_00:48:51 | 121 |
| 2015-01-01_00:48:52 | 121 |
| 2015-01-01_00:48:53 | 123 |
| 2015-01-01_00:48:54 | 123 |
| 2015-01-01_00:48:55 | 124 |
| 2015-01-01_00:48:56 | 123 |
| 2015-01-01_00:48:57 | 124 |
| 2015-01-01_00:48:58 | 122 |
| 2015-01-01_00:48:59 | 123 |
| 2015-01-01_00:49:00 | 121 |
| 2015-01-01_00:49:01 | 122 |
| 2015-01-01_00:49:02 | 121 |
| 2015-01-01_00:49:03 | 121 |
| 2015-01-01_00:49:04 | 121 |
| 2015-01-01_00:49:05 | 121 |
| 2015-01-01_00:49:06 | 119 |
| 2015-01-01_00:49:07 | 117 |
| 2015-01-01_00:49:08 | 116 |
| 2015-01-01_00:49:09 | 113 |
| 2015-01-01_00:49:10 | 112 |
| 2015-01-01_00:49:11 | 112 |
| 2015-01-01_00:49:12 | 111 |
| 2015-01-01_00:49:13 | 111 |
| 2015-01-01_00:49:14 | 109 |
| 2015-01-01_00:49:15 | 107 |
| 2015-01-01_00:49:16 | 106 |
| 2015-01-01_00:49:17 | 108 |
| 2015-01-01_00:49:18 | 108 |
| 2015-01-01_00:49:19 | 110 |
| 2015-01-01_00:49:20 | 109 |
| 2015-01-01_00:49:21 | 110 |
| 2015-01-01_00:49:22 | 110 |
| 2015-01-01_00:49:23 | 109 |
| 2015-01-01_00:49:24 | 108 |
| 2015-01-01_00:49:25 | 106 |
| 2015-01-01_00:49:26 | 105 |
| 2015-01-01_00:49:27 | 106 |
| 2015-01-01_00:49:28 | 107 |
| 2015-01-01_00:49:29 | 106 |
| 2015-01-01_00:49:30 | 107 |
| 2015-01-01_00:49:31 | 106 |
| 2015-01-01_00:49:32 | 109 |
| 2015-01-01_00:49:33 | 111 |
| 2015-01-01_00:49:34 | 113 |
| 2015-01-01_00:49:35 | 113 |
| 2015-01-01_00:49:36 | 113 |
| 2015-01-01_00:49:37 | 116 |
| 2015-01-01_00:49:38 | 117 |
| 2015-01-01_00:49:39 | 116 |
| 2015-01-01_00:49:40 | 117 |
| 2015-01-01_00:49:41 | 119 |
| 2015-01-01_00:49:42 | 118 |
| 2015-01-01_00:49:43 | 119 |
| 2015-01-01_00:49:44 | 116 |
| 2015-01-01_00:49:45 | 115 |
| 2015-01-01_00:49:46 | 113 |
| 2015-01-01_00:49:47 | 111 |
| 2015-01-01_00:49:48 | 110 |
| 2015-01-01_00:49:49 | 107 |
| 2015-01-01_00:49:50 | 106 |
| 2015-01-01_00:49:51 | 107 |
| 2015-01-01_00:49:52 | 106 |
| 2015-01-01_00:49:53 | 109 |
| 2015-01-01_00:49:54 | 109 |
| 2015-01-01_00:49:55 | 109 |
| 2015-01-01_00:49:56 | 111 |
| 2015-01-01_00:49:57 | 110 |
| 2015-01-01_00:49:58 | 108 |
| 2015-01-01_00:49:59 | 108 |
| 2015-01-01_00:50:00 | 108 |
| 2015-01-01_00:50:01 | 108 |
| 2015-01-01_00:50:02 | 106 |
| 2015-01-01_00:50:03 | 106 |
| 2015-01-01_00:50:04 | 105 |
| 2015-01-01_00:50:05 | 104 |
| 2015-01-01_00:50:06 | 102 |
| 2015-01-01_00:50:07 | 99 |
| 2015-01-01_00:50:08 | 98 |
| 2015-01-01_00:50:09 | 97 |
| 2015-01-01_00:50:10 | 97 |
| 2015-01-01_00:50:11 | 94 |
| 2015-01-01_00:50:12 | 92 |
| 2015-01-01_00:50:13 | 91 |
| 2015-01-01_00:50:14 | 92 |
| 2015-01-01_00:50:15 | 91 |
| 2015-01-01_00:50:16 | 90 |
| 2015-01-01_00:50:17 | 90 |
| 2015-01-01_00:50:18 | 89 |
| 2015-01-01_00:50:19 | 87 |
| 2015-01-01_00:50:20 | 85 |
| 2015-01-01_00:50:21 | 85 |
| 2015-01-01_00:50:22 | 85 |
| 2015-01-01_00:50:23 | 86 |
| 2015-01-01_00:50:24 | 88 |
| 2015-01-01_00:50:25 | 88 |
| 2015-01-01_00:50:26 | 91 |
| 2015-01-01_00:50:27 | 91 |
| 2015-01-01_00:50:28 | 90 |
| 2015-01-01_00:50:29 | 88 |
| 2015-01-01_00:50:30 | 89 |
| 2015-01-01_00:50:31 | 88 |
| 2015-01-01_00:50:32 | 87 |
| 2015-01-01_00:50:33 | 85 |
| 2015-01-01_00:50:34 | 85 |
| 2015-01-01_00:50:35 | 86 |
| 2015-01-01_00:50:36 | 87 |
| 2015-01-01_00:50:37 | 90 |
| 2015-01-01_00:50:38 | 92 |
| 2015-01-01_00:50:39 | 94 |
| 2015-01-01_00:50:40 | 97 |
| 2015-01-01_00:50:41 | 101 |
| 2015-01-01_00:50:42 | 105 |
| 2015-01-01_00:50:43 | 108 |
| 2015-01-01_00:50:44 | 111 |
| 2015-01-01_00:50:45 | 115 |
| 2015-01-01_00:50:46 | 119 |
| 2015-01-01_00:50:47 | 122 |
| 2015-01-01_00:50:48 | 124 |
| 2015-01-01_00:50:49 | 124 |
| 2015-01-01_00:50:50 | 122 |
| 2015-01-01_00:50:51 | 118 |
| 2015-01-01_00:50:52 | 117 |
| 2015-01-01_00:50:53 | 114 |
| 2015-01-01_00:50:54 | 112 |
| 2015-01-01_00:50:55 | 110 |
| 2015-01-01_00:50:56 | 110 |
| 2015-01-01_00:50:57 | 114 |
| 2015-01-01_00:50:58 | 119 |
| 2015-01-01_00:50:59 | 122 |
| 2015-01-01_00:51:00 | 126 |
| 2015-01-01_00:51:01 | 128 |
| 2015-01-01_00:51:02 | 131 |
| 2015-01-01_00:51:03 | 131 |
| 2015-01-01_00:51:04 | 134 |
| 2015-01-01_00:51:05 | 137 |
| 2015-01-01_00:51:06 | 139 |
| 2015-01-01_00:51:07 | 141 |
| 2015-01-01_00:51:08 | 144 |
| 2015-01-01_00:51:09 | 148 |
| 2015-01-01_00:51:10 | 150 |
| 2015-01-01_00:51:11 | 151 |
| 2015-01-01_00:51:12 | 155 |
| 2015-01-01_00:51:13 | 157 |
| 2015-01-01_00:51:14 | 161 |
| 2015-01-01_00:51:15 | 164 |
| 2015-01-01_00:51:16 | 166 |
| 2015-01-01_00:51:17 | 167 |
| 2015-01-01_00:51:18 | 166 |
| 2015-01-01_00:51:19 | 166 |
| 2015-01-01_00:51:20 | 164 |
| 2015-01-01_00:51:21 | 163 |
| 2015-01-01_00:51:22 | 164 |
| 2015-01-01_00:51:23 | 162 |
| 2015-01-01_00:51:24 | 162 |
| 2015-01-01_00:51:25 | 163 |
| 2015-01-01_00:51:26 | 164 |
| 2015-01-01_00:51:27 | 164 |
| 2015-01-01_00:51:28 | 164 |
| 2015-01-01_00:51:29 | 164 |
| 2015-01-01_00:51:30 | 163 |
| 2015-01-01_00:51:31 | 162 |
| 2015-01-01_00:51:32 | 162 |
| 2015-01-01_00:51:33 | 162 |
| 2015-01-01_00:51:34 | 163 |
| 2015-01-01_00:51:35 | 163 |
| 2015-01-01_00:51:36 | 163 |
| 2015-01-01_00:51:37 | 162 |
| 2015-01-01_00:51:38 | 162 |
| 2015-01-01_00:51:39 | 163 |
| 2015-01-01_00:51:40 | 163 |
| 2015-01-01_00:51:41 | 164 |
| 2015-01-01_00:51:42 | 165 |
| 2015-01-01_00:51:43 | 164 |
| 2015-01-01_00:51:44 | 164 |
| 2015-01-01_00:51:45 | 163 |
| 2015-01-01_00:51:46 | 164 |
| 2015-01-01_00:51:47 | 164 |
| 2015-01-01_00:51:48 | 164 |
| 2015-01-01_00:51:49 | 164 |
| 2015-01-01_00:51:50 | 164 |
| 2015-01-01_00:51:51 | 164 |
| 2015-01-01_00:51:52 | 164 |
| 2015-01-01_00:51:53 | 165 |
| 2015-01-01_00:51:54 | 163 |
| 2015-01-01_00:51:55 | 164 |
| 2015-01-01_00:51:56 | 164 |
| 2015-01-01_00:51:57 | 164 |
| 2015-01-01_00:51:58 | 164 |
| 2015-01-01_00:51:59 | 164 |
| 2015-01-01_00:52:00 | 164 |
| 2015-01-01_00:52:01 | 164 |
| 2015-01-01_00:52:02 | 164 |
| 2015-01-01_00:52:03 | 164 |
| 2015-01-01_00:52:04 | 164 |
| 2015-01-01_00:52:05 | 164 |
| 2015-01-01_00:52:06 | 164 |
| 2015-01-01_00:52:07 | 164 |
| 2015-01-01_00:52:08 | 164 |
| 2015-01-01_00:52:09 | 164 |
| 2015-01-01_00:52:10 | 164 |
| 2015-01-01_00:52:11 | 164 |
| 2015-01-01_00:52:12 | 164 |
| 2015-01-01_00:52:13 | 164 |
| 2015-01-01_00:52:14 | 164 |
| 2015-01-01_00:52:15 | 164 |
| 2015-01-01_00:52:16 | 164 |
| 2015-01-01_00:52:17 | 164 |
| 2015-01-01_00:52:18 | 164 |
| 2015-01-01_00:52:19 | 164 |
| 2015-01-01_00:52:20 | 164 |
| 2015-01-01_00:52:21 | 164 |
| 2015-01-01_00:52:22 | 163 |
| 2015-01-01_00:52:23 | 164 |
| 2015-01-01_00:52:24 | 164 |
| 2015-01-01_00:52:25 | 165 |
| 2015-01-01_00:52:26 | 164 |
| 2015-01-01_00:52:27 | 164 |
| 2015-01-01_00:52:28 | 164 |
| 2015-01-01_00:52:29 | 164 |
| 2015-01-01_00:52:30 | 164 |
| 2015-01-01_00:52:31 | 164 |
| 2015-01-01_00:52:32 | 163 |
| 2015-01-01_00:52:33 | 165 |
| 2015-01-01_00:52:34 | 164 |
| 2015-01-01_00:52:35 | 164 |
| 2015-01-01_00:52:36 | 163 |
| 2015-01-01_00:52:37 | 165 |
| 2015-01-01_00:52:38 | 163 |
| 2015-01-01_00:52:39 | 164 |
| 2015-01-01_00:52:40 | 164 |
| 2015-01-01_00:52:41 | 165 |
| 2015-01-01_00:52:42 | 163 |
| 2015-01-01_00:52:43 | 164 |
| 2015-01-01_00:52:44 | 164 |
| 2015-01-01_00:52:45 | 164 |
| 2015-01-01_00:52:46 | 164 |
| 2015-01-01_00:52:47 | 163 |
| 2015-01-01_00:52:48 | 164 |
| 2015-01-01_00:52:49 | 165 |
| 2015-01-01_00:52:50 | 163 |
| 2015-01-01_00:52:51 | 165 |
| 2015-01-01_00:52:52 | 164 |
| 2015-01-01_00:52:53 | 164 |
| 2015-01-01_00:52:54 | 164 |
| 2015-01-01_00:52:55 | 164 |
| 2015-01-01_00:52:56 | 164 |
| 2015-01-01_00:52:57 | 163 |
| 2015-01-01_00:52:58 | 164 |
| 2015-01-01_00:52:59 | 164 |
| 2015-01-01_00:53:00 | 164 |
| 2015-01-01_00:53:01 | 164 |
| 2015-01-01_00:53:02 | 163 |
| 2015-01-01_00:53:03 | 164 |
| 2015-01-01_00:53:04 | 164 |
| 2015-01-01_00:53:05 | 164 |
| 2015-01-01_00:53:06 | 163 |
| 2015-01-01_00:53:07 | 164 |
| 2015-01-01_00:53:08 | 164 |
| 2015-01-01_00:53:09 | 164 |
| 2015-01-01_00:53:10 | 164 |
| 2015-01-01_00:53:11 | 164 |
| 2015-01-01_00:53:12 | 164 |
| 2015-01-01_00:53:13 | 164 |
| 2015-01-01_00:53:14 | 164 |
| 2015-01-01_00:53:15 | 164 |
| 2015-01-01_00:53:16 | 164 |
| 2015-01-01_00:53:17 | 164 |
| 2015-01-01_00:53:18 | 164 |
| 2015-01-01_00:53:19 | 164 |
| 2015-01-01_00:53:20 | 164 |
| 2015-01-01_00:53:21 | 164 |
| 2015-01-01_00:53:22 | 164 |
| 2015-01-01_00:53:23 | 164 |
| 2015-01-01_00:53:24 | 164 |
| 2015-01-01_00:53:25 | 164 |
| 2015-01-01_00:53:26 | 163 |
| 2015-01-01_00:53:27 | 164 |
| 2015-01-01_00:53:28 | 164 |
| 2015-01-01_00:53:29 | 165 |
| 2015-01-01_00:53:30 | 164 |
| 2015-01-01_00:53:31 | 164 |
| 2015-01-01_00:53:32 | 163 |
| 2015-01-01_00:53:33 | 164 |
| 2015-01-01_00:53:34 | 164 |
| 2015-01-01_00:53:35 | 164 |
| 2015-01-01_00:53:36 | 164 |
| 2015-01-01_00:53:37 | 163 |
| 2015-01-01_00:53:38 | 164 |
| 2015-01-01_00:53:39 | 164 |
| 2015-01-01_00:53:40 | 163 |
| 2015-01-01_00:53:41 | 164 |
| 2015-01-01_00:53:42 | 165 |
| 2015-01-01_00:53:43 | 163 |
| 2015-01-01_00:53:44 | 164 |
| 2015-01-01_00:53:45 | 164 |
| 2015-01-01_00:53:46 | 165 |
| 2015-01-01_00:53:47 | 164 |
| 2015-01-01_00:53:48 | 163 |
| 2015-01-01_00:53:49 | 164 |
| 2015-01-01_00:53:50 | 165 |
| 2015-01-01_00:53:51 | 164 |
| 2015-01-01_00:53:52 | 163 |
| 2015-01-01_00:53:53 | 164 |
| 2015-01-01_00:53:54 | 165 |
| 2015-01-01_00:53:55 | 164 |
| 2015-01-01_00:53:56 | 164 |
| 2015-01-01_00:53:57 | 163 |
| 2015-01-01_00:53:58 | 165 |
| 2015-01-01_00:53:59 | 163 |
| 2015-01-01_00:54:00 | 164 |
| 2015-01-01_00:54:01 | 164 |
| 2015-01-01_00:54:02 | 165 |
| 2015-01-01_00:54:03 | 164 |
| 2015-01-01_00:54:04 | 163 |
| 2015-01-01_00:54:05 | 164 |
| 2015-01-01_00:54:06 | 165 |
| 2015-01-01_00:54:07 | 163 |
| 2015-01-01_00:54:08 | 164 |
| 2015-01-01_00:54:09 | 164 |
| 2015-01-01_00:54:10 | 165 |
| 2015-01-01_00:54:11 | 163 |
| 2015-01-01_00:54:12 | 164 |
| 2015-01-01_00:54:13 | 164 |
| 2015-01-01_00:54:14 | 164 |
| 2015-01-01_00:54:15 | 164 |
| 2015-01-01_00:54:16 | 164 |
| 2015-01-01_00:54:17 | 163 |
| 2015-01-01_00:54:18 | 161 |
| 2015-01-01_00:54:19 | 156 |
| 2015-01-01_00:54:20 | 154 |
| 2015-01-01_00:54:21 | 150 |
| 2015-01-01_00:54:22 | 148 |
| 2015-01-01_00:54:23 | 145 |
| 2015-01-01_00:54:24 | 142 |
| 2015-01-01_00:54:25 | 139 |
| 2015-01-01_00:54:26 | 137 |
| 2015-01-01_00:54:27 | 137 |
| 2015-01-01_00:54:28 | 137 |
| 2015-01-01_00:54:29 | 136 |
| 2015-01-01_00:54:30 | 137 |
| 2015-01-01_00:54:31 | 137 |
| 2015-01-01_00:54:32 | 136 |
| 2015-01-01_00:54:33 | 137 |
| 2015-01-01_00:54:34 | 138 |
| 2015-01-01_00:54:35 | 140 |
| 2015-01-01_00:54:36 | 142 |
| 2015-01-01_00:54:37 | 143 |
| 2015-01-01_00:54:38 | 145 |
| 2015-01-01_00:54:39 | 146 |
| 2015-01-01_00:54:40 | 147 |
| 2015-01-01_00:54:41 | 148 |
| 2015-01-01_00:54:42 | 150 |
| 2015-01-01_00:54:43 | 149 |
| 2015-01-01_00:54:44 | 149 |
| 2015-01-01_00:54:45 | 151 |
| 2015-01-01_00:54:46 | 152 |
| 2015-01-01_00:54:47 | 153 |
| 2015-01-01_00:54:48 | 157 |
| 2015-01-01_00:54:49 | 158 |
| 2015-01-01_00:54:50 | 160 |
| 2015-01-01_00:54:51 | 157 |
| 2015-01-01_00:54:52 | 157 |
| 2015-01-01_00:54:53 | 155 |
| 2015-01-01_00:54:54 | 155 |
| 2015-01-01_00:54:55 | 154 |
| 2015-01-01_00:54:56 | 153 |
| 2015-01-01_00:54:57 | 154 |
| 2015-01-01_00:54:58 | 152 |
| 2015-01-01_00:54:59 | 150 |
| 2015-01-01_00:55:00 | 149 |
| 2015-01-01_00:55:01 | 146 |
| 2015-01-01_00:55:02 | 144 |
| 2015-01-01_00:55:03 | 143 |
| 2015-01-01_00:55:04 | 143 |
| 2015-01-01_00:55:05 | 143 |
| 2015-01-01_00:55:06 | 145 |
| 2015-01-01_00:55:07 | 142 |
| 2015-01-01_00:55:08 | 141 |
| 2015-01-01_00:55:09 | 139 |
| 2015-01-01_00:55:10 | 136 |
| 2015-01-01_00:55:11 | 135 |
| 2015-01-01_00:55:12 | 133 |
| 2015-01-01_00:55:13 | 131 |
| 2015-01-01_00:55:14 | 130 |
| 2015-01-01_00:55:15 | 128 |
| 2015-01-01_00:55:16 | 125 |
| 2015-01-01_00:55:17 | 124 |
| 2015-01-01_00:55:18 | 121 |
| 2015-01-01_00:55:19 | 119 |
| 2015-01-01_00:55:20 | 116 |
| 2015-01-01_00:55:21 | 115 |
| 2015-01-01_00:55:22 | 113 |
| 2015-01-01_00:55:23 | 110 |
| 2015-01-01_00:55:24 | 108 |
| 2015-01-01_00:55:25 | 107 |
| 2015-01-01_00:55:26 | 104 |
| 2015-01-01_00:55:27 | 101 |
| 2015-01-01_00:55:28 | 100 |
| 2015-01-01_00:55:29 | 98 |
| 2015-01-01_00:55:30 | 96 |
| 2015-01-01_00:55:31 | 95 |
| 2015-01-01_00:55:32 | 95 |
| 2015-01-01_00:55:33 | 96 |
| 2015-01-01_00:55:34 | 96 |
| 2015-01-01_00:55:35 | 96 |
| 2015-01-01_00:55:36 | 97 |
| 2015-01-01_00:55:37 | 98 |
| 2015-01-01_00:55:38 | 97 |
| 2015-01-01_00:55:39 | 97 |
| 2015-01-01_00:55:40 | 96 |
| 2015-01-01_00:55:41 | 96 |
| 2015-01-01_00:55:42 | 94 |
| 2015-01-01_00:55:43 | 93 |
| 2015-01-01_00:55:44 | 91 |
| 2015-01-01_00:55:45 | 90 |
| 2015-01-01_00:55:46 | 89 |
| 2015-01-01_00:55:47 | 88 |
| 2015-01-01_00:55:48 | 87 |
| 2015-01-01_00:55:49 | 86 |
| 2015-01-01_00:55:50 | 85 |
| 2015-01-01_00:55:51 | 85 |
| 2015-01-01_00:55:52 | 84 |
| 2015-01-01_00:55:53 | 84 |
| 2015-01-01_00:55:54 | 84 |
| 2015-01-01_00:55:55 | 86 |
| 2015-01-01_00:55:56 | 87 |
| 2015-01-01_00:55:57 | 87 |
| 2015-01-01_00:55:58 | 87 |
| 2015-01-01_00:55:59 | 87 |
| 2015-01-01_00:56:00 | 85 |
| 2015-01-01_00:56:01 | 85 |
| 2015-01-01_00:56:02 | 85 |
| 2015-01-01_00:56:03 | 87 |
| 2015-01-01_00:56:04 | 87 |
| 2015-01-01_00:56:05 | 88 |
| 2015-01-01_00:56:06 | 87 |
| 2015-01-01_00:56:07 | 86 |
| 2015-01-01_00:56:08 | 85 |
| 2015-01-01_00:56:09 | 85 |
| 2015-01-01_00:56:10 | 83 |
| 2015-01-01_00:56:11 | 81 |
| 2015-01-01_00:56:12 | 80 |
| 2015-01-01_00:56:13 | 79 |
| 2015-01-01_00:56:14 | 78 |
| 2015-01-01_00:56:15 | 77 |
| 2015-01-01_00:56:16 | 76 |
| 2015-01-01_00:56:17 | 77 |
| 2015-01-01_00:56:18 | 77 |
| 2015-01-01_00:56:19 | 76 |
| 2015-01-01_00:56:20 | 76 |
| 2015-01-01_00:56:21 | 76 |
| 2015-01-01_00:56:22 | 75 |
| 2015-01-01_00:56:23 | 75 |
| 2015-01-01_00:56:24 | 75 |
| 2015-01-01_00:56:25 | 74 |
| 2015-01-01_00:56:26 | 73 |
| 2015-01-01_00:56:27 | 73 |
| 2015-01-01_00:56:28 | 73 |
| 2015-01-01_00:56:29 | 74 |
| 2015-01-01_00:56:30 | 77 |
| 2015-01-01_00:56:31 | 78 |
| 2015-01-01_00:56:32 | 80 |
| 2015-01-01_00:56:33 | 82 |
| 2015-01-01_00:56:34 | 83 |
| 2015-01-01_00:56:35 | 85 |
| 2015-01-01_00:56:36 | 87 |
| 2015-01-01_00:56:37 | 89 |
| 2015-01-01_00:56:38 | 90 |
| 2015-01-01_00:56:39 | 89 |
| 2015-01-01_00:56:40 | 88 |
| 2015-01-01_00:56:41 | 87 |
| 2015-01-01_00:56:42 | 86 |
| 2015-01-01_00:56:43 | 83 |
| 2015-01-01_00:56:44 | 82 |
| 2015-01-01_00:56:45 | 81 |
| 2015-01-01_00:56:46 | 81 |
| 2015-01-01_00:56:47 | 80 |
| 2015-01-01_00:56:48 | 81 |
| 2015-01-01_00:56:49 | 81 |
| 2015-01-01_00:56:50 | 81 |
| 2015-01-01_00:56:51 | 80 |
| 2015-01-01_00:56:52 | 80 |
| 2015-01-01_00:56:53 | 79 |
| 2015-01-01_00:56:54 | 80 |
| 2015-01-01_00:56:55 | 79 |
| 2015-01-01_00:56:56 | 81 |
| 2015-01-01_00:56:57 | 81 |
| 2015-01-01_00:56:58 | 80 |
| 2015-01-01_00:56:59 | 79 |
| 2015-01-01_00:57:00 | 78 |
| 2015-01-01_00:57:01 | 79 |
| 2015-01-01_00:57:02 | 79 |
| 2015-01-01_00:57:03 | 80 |
| 2015-01-01_00:57:04 | 80 |
| 2015-01-01_00:57:05 | 80 |
| 2015-01-01_00:57:06 | 79 |
| 2015-01-01_00:57:07 | 78 |
| 2015-01-01_00:57:08 | 77 |
| 2015-01-01_00:57:09 | 76 |
| 2015-01-01_00:57:10 | 76 |
| 2015-01-01_00:57:11 | 75 |
| 2015-01-01_00:57:12 | 74 |
| 2015-01-01_00:57:13 | 74 |
| 2015-01-01_00:57:14 | 76 |
| 2015-01-01_00:57:15 | 75 |
| 2015-01-01_00:57:16 | 76 |
| 2015-01-01_00:57:17 | 75 |
| 2015-01-01_00:57:18 | 74 |
| 2015-01-01_00:57:19 | 73 |
| 2015-01-01_00:57:20 | 71 |
| 2015-01-01_00:57:21 | 70 |
| 2015-01-01_00:57:22 | 69 |
| 2015-01-01_00:57:23 | 68 |
| 2015-01-01_00:57:24 | 66 |
| 2015-01-01_00:57:25 | 65 |
| 2015-01-01_00:57:26 | 63 |
| 2015-01-01_00:57:27 | 62 |
| 2015-01-01_00:57:28 | 60 |
| 2015-01-01_00:57:29 | 59 |
| 2015-01-01_00:57:30 | 58 |
| 2015-01-01_00:57:31 | 57 |
| 2015-01-01_00:57:32 | 58 |
| 2015-01-01_00:57:33 | 59 |
| 2015-01-01_00:57:34 | 61 |
| 2015-01-01_00:57:35 | 62 |
| 2015-01-01_00:57:36 | 63 |
| 2015-01-01_00:57:37 | 62 |
| 2015-01-01_00:57:38 | 63 |
| 2015-01-01_00:57:39 | 62 |
| 2015-01-01_00:57:40 | 62 |
| 2015-01-01_00:57:41 | 63 |
| 2015-01-01_00:57:42 | 61 |
| 2015-01-01_00:57:43 | 62 |
| 2015-01-01_00:57:44 | 61 |
| 2015-01-01_00:57:45 | 62 |
| 2015-01-01_00:57:46 | 63 |
| 2015-01-01_00:57:47 | 63 |
| 2015-01-01_00:57:48 | 63 |
| 2015-01-01_00:57:49 | 63 |
| 2015-01-01_00:57:50 | 64 |
| 2015-01-01_00:57:51 | 65 |
| 2015-01-01_00:57:52 | 64 |
| 2015-01-01_00:57:53 | 64 |
| 2015-01-01_00:57:54 | 63 |
| 2015-01-01_00:57:55 | 63 |
| 2015-01-01_00:57:56 | 62 |
| 2015-01-01_00:57:57 | 62 |
| 2015-01-01_00:57:58 | 61 |
| 2015-01-01_00:57:59 | 63 |
| 2015-01-01_00:58:00 | 64 |
| 2015-01-01_00:58:01 | 71 |
| 2015-01-01_00:58:02 | 77 |
| 2015-01-01_00:58:03 | 79 |
| 2015-01-01_00:58:04 | 81 |
| 2015-01-01_00:58:05 | 82 |
| 2015-01-01_00:58:06 | 86 |
| 2015-01-01_00:58:07 | 88 |
| 2015-01-01_00:58:08 | 87 |
| 2015-01-01_00:58:09 | 85 |
| 2015-01-01_00:58:10 | 84 |
| 2015-01-01_00:58:11 | 83 |
| 2015-01-01_00:58:12 | 84 |
| 2015-01-01_00:58:13 | 90 |
| 2015-01-01_00:58:14 | 91 |
| 2015-01-01_00:58:15 | 86 |
| 2015-01-01_00:58:16 | 80 |
| 2015-01-01_00:58:17 | 75 |
| 2015-01-01_00:58:18 | 74 |
| 2015-01-01_00:58:19 | 71 |
| 2015-01-01_00:58:20 | 71 |
| 2015-01-01_00:58:21 | 74 |
| 2015-01-01_00:58:22 | 77 |
| 2015-01-01_00:58:23 | 82 |
| 2015-01-01_00:58:24 | 89 |
| 2015-01-01_00:58:25 | 97 |
| 2015-01-01_00:58:26 | 104 |
| 2015-01-01_00:58:27 | 106 |
| 2015-01-01_00:58:28 | 109 |
| 2015-01-01_00:58:29 | 113 |
| 2015-01-01_00:58:30 | 116 |
| 2015-01-01_00:58:31 | 113 |
| 2015-01-01_00:58:32 | 112 |
| 2015-01-01_00:58:33 | 109 |
| 2015-01-01_00:58:34 | 107 |
| 2015-01-01_00:58:35 | 105 |
| 2015-01-01_00:58:36 | 101 |
| 2015-01-01_00:58:37 | 99 |
| 2015-01-01_00:58:38 | 96 |
| 2015-01-01_00:58:39 | 94 |
| 2015-01-01_00:58:40 | 92 |
| 2015-01-01_00:58:41 | 91 |
| 2015-01-01_00:58:42 | 89 |
| 2015-01-01_00:58:43 | 88 |
| 2015-01-01_00:58:44 | 88 |
| 2015-01-01_00:58:45 | 87 |
| 2015-01-01_00:58:46 | 88 |
| 2015-01-01_00:58:47 | 85 |
| 2015-01-01_00:58:48 | 83 |
| 2015-01-01_00:58:49 | 81 |
| 2015-01-01_00:58:50 | 78 |
| 2015-01-01_00:58:51 | 70 |
| 2015-01-01_00:58:52 | 67 |
| 2015-01-01_00:58:53 | 66 |
| 2015-01-01_00:58:54 | 64 |
| 2015-01-01_00:58:55 | 63 |
| 2015-01-01_00:58:56 | 62 |
| 2015-01-01_00:58:57 | 61 |
| 2015-01-01_00:58:58 | 60 |
| 2015-01-01_00:58:59 | 59 |
| 2015-01-01_00:59:00 | 58 |
| 2015-01-01_00:59:01 | 58 |
| 2015-01-01_00:59:02 | 58 |
| 2015-01-01_00:59:03 | 57 |
| 2015-01-01_00:59:04 | 56 |
| 2015-01-01_00:59:05 | 55 |
| 2015-01-01_00:59:06 | 53 |
| 2015-01-01_00:59:07 | 52 |
| 2015-01-01_00:59:08 | 51 |
| 2015-01-01_00:59:09 | 49 |
| 2015-01-01_00:59:10 | 48 |
| 2015-01-01_00:59:11 | 47 |
| 2015-01-01_00:59:12 | 46 |
| 2015-01-01_00:59:13 | 47 |
| 2015-01-01_00:59:14 | 48 |
| 2015-01-01_00:59:15 | 48 |
| 2015-01-01_00:59:16 | 51 |
| 2015-01-01_00:59:17 | 52 |
| 2015-01-01_00:59:18 | 55 |
| 2015-01-01_00:59:19 | 61 |
| 2015-01-01_00:59:20 | 66 |
| 2015-01-01_00:59:21 | 73 |
| 2015-01-01_00:59:22 | 75 |
| 2015-01-01_00:59:23 | 76 |
| 2015-01-01_00:59:24 | 77 |
| 2015-01-01_00:59:25 | 80 |
| 2015-01-01_00:59:26 | 82 |
| 2015-01-01_00:59:27 | 82 |
| 2015-01-01_00:59:28 | 83 |
| 2015-01-01_00:59:29 | 87 |
| 2015-01-01_00:59:30 | 90 |
| 2015-01-01_00:59:31 | 93 |
| 2015-01-01_00:59:32 | 93 |
| 2015-01-01_00:59:33 | 94 |
| 2015-01-01_00:59:34 | 92 |
| 2015-01-01_00:59:35 | 92 |
| 2015-01-01_00:59:36 | 92 |
| 2015-01-01_00:59:37 | 93 |
| 2015-01-01_00:59:38 | 92 |
| 2015-01-01_00:59:39 | 95 |
| 2015-01-01_00:59:40 | 100 |
| 2015-01-01_00:59:41 | 107 |
| 2015-01-01_00:59:42 | 112 |
| 2015-01-01_00:59:43 | 116 |
| 2015-01-01_00:59:44 | 118 |
| 2015-01-01_00:59:45 | 116 |
| 2015-01-01_00:59:46 | 115 |
| 2015-01-01_00:59:47 | 113 |
| 2015-01-01_00:59:48 | 112 |
| 2015-01-01_00:59:49 | 111 |
| 2015-01-01_00:59:50 | 111 |
| 2015-01-01_00:59:51 | 111 |
| 2015-01-01_00:59:52 | 111 |
| 2015-01-01_00:59:53 | 112 |
| 2015-01-01_00:59:54 | 112 |
| 2015-01-01_00:59:55 | 111 |
| 2015-01-01_00:59:56 | 111 |
| 2015-01-01_00:59:57 | 111 |
| 2015-01-01_00:59:58 | 110 |
| 2015-01-01_00:59:59 | 110 |
| 2015-01-01_01:00:01 | 111 |
| 2015-01-01_01:00:02 | 111 |
| 2015-01-01_01:00:03 | 110 |
| 2015-01-01_01:00:04 | 111 |
| 2015-01-01_01:00:05 | 110 |
| 2015-01-01_01:00:06 | 109 |
| 2015-01-01_01:00:07 | 109 |
| 2015-01-01_01:00:08 | 108 |
| 2015-01-01_01:00:09 | 109 |
| 2015-01-01_01:00:10 | 109 |
| 2015-01-01_01:00:11 | 108 |
| 2015-01-01_01:00:12 | 108 |
| 2015-01-01_01:00:13 | 108 |
| 2015-01-01_01:00:14 | 107 |
| 2015-01-01_01:00:15 | 107 |
| 2015-01-01_01:00:16 | 106 |
| 2015-01-01_01:00:17 | 105 |
| 2015-01-01_01:00:18 | 104 |
| 2015-01-01_01:00:19 | 101 |
| 2015-01-01_01:00:20 | 101 |
| 2015-01-01_01:00:21 | 99 |
| 2015-01-01_01:00:22 | 99 |
| 2015-01-01_01:00:23 | 98 |
| 2015-01-01_01:00:24 | 96 |
| 2015-01-01_01:00:25 | 96 |
| 2015-01-01_01:00:26 | 95 |
| 2015-01-01_01:00:27 | 95 |
| 2015-01-01_01:00:28 | 93 |
| 2015-01-01_01:00:29 | 94 |
| 2015-01-01_01:00:30 | 92 |
| 2015-01-01_01:00:31 | 93 |
| 2015-01-01_01:00:32 | 96 |
| 2015-01-01_01:00:33 | 98 |
| 2015-01-01_01:00:34 | 98 |
| 2015-01-01_01:00:35 | 98 |
| 2015-01-01_01:00:36 | 97 |
| 2015-01-01_01:00:37 | 98 |
| 2015-01-01_01:00:38 | 99 |
| 2015-01-01_01:00:39 | 102 |
| 2015-01-01_01:00:40 | 101 |
| 2015-01-01_01:00:41 | 101 |
| 2015-01-01_01:00:42 | 101 |
| 2015-01-01_01:00:43 | 98 |
| 2015-01-01_01:00:44 | 96 |
| 2015-01-01_01:00:45 | 94 |
| 2015-01-01_01:00:46 | 92 |
| 2015-01-01_01:00:47 | 90 |
| 2015-01-01_01:00:48 | 88 |
| 2015-01-01_01:00:49 | 86 |
| 2015-01-01_01:00:50 | 85 |
| 2015-01-01_01:00:51 | 83 |
| 2015-01-01_01:00:52 | 82 |
| 2015-01-01_01:00:53 | 81 |
| 2015-01-01_01:00:54 | 84 |
| 2015-01-01_01:00:55 | 89 |
| 2015-01-01_01:00:56 | 95 |
| 2015-01-01_01:00:57 | 100 |
| 2015-01-01_01:00:58 | 108 |
| 2015-01-01_01:00:59 | 107 |
| 2015-01-01_01:01:00 | 105 |
| 2015-01-01_01:01:01 | 102 |
| 2015-01-01_01:01:02 | 102 |
| 2015-01-01_01:01:03 | 102 |
| 2015-01-01_01:01:04 | 102 |
| 2015-01-01_01:01:05 | 104 |
| 2015-01-01_01:01:06 | 104 |
| 2015-01-01_01:01:07 | 105 |
| 2015-01-01_01:01:08 | 105 |
| 2015-01-01_01:01:09 | 106 |
| 2015-01-01_01:01:10 | 108 |
| 2015-01-01_01:01:11 | 107 |
| 2015-01-01_01:01:12 | 107 |
| 2015-01-01_01:01:13 | 108 |
| 2015-01-01_01:01:14 | 109 |
| 2015-01-01_01:01:15 | 109 |
| 2015-01-01_01:01:16 | 109 |
| 2015-01-01_01:01:17 | 110 |
| 2015-01-01_01:01:18 | 111 |
| 2015-01-01_01:01:19 | 110 |
| 2015-01-01_01:01:20 | 111 |
| 2015-01-01_01:01:21 | 111 |
| 2015-01-01_01:01:22 | 111 |
| 2015-01-01_01:01:23 | 111 |
| 2015-01-01_01:01:24 | 110 |
| 2015-01-01_01:01:25 | 111 |
| 2015-01-01_01:01:26 | 111 |
| 2015-01-01_01:01:27 | 111 |
| 2015-01-01_01:01:28 | 111 |
| 2015-01-01_01:01:29 | 111 |
| 2015-01-01_01:01:30 | 112 |
| 2015-01-01_01:01:31 | 111 |
| 2015-01-01_01:01:32 | 112 |
| 2015-01-01_01:01:33 | 112 |
| 2015-01-01_01:01:34 | 112 |
| 2015-01-01_01:01:35 | 111 |
| 2015-01-01_01:01:36 | 110 |
| 2015-01-01_01:01:37 | 110 |
| 2015-01-01_01:01:38 | 111 |
| 2015-01-01_01:01:39 | 109 |
| 2015-01-01_01:01:40 | 110 |
| 2015-01-01_01:01:41 | 110 |
| 2015-01-01_01:01:42 | 110 |
| 2015-01-01_01:01:43 | 110 |
| 2015-01-01_01:01:44 | 109 |
| 2015-01-01_01:01:45 | 109 |
| 2015-01-01_01:01:46 | 108 |
| 2015-01-01_01:01:47 | 108 |
| 2015-01-01_01:01:48 | 108 |
| 2015-01-01_01:01:49 | 107 |
| 2015-01-01_01:01:50 | 106 |
| 2015-01-01_01:01:51 | 107 |
| 2015-01-01_01:01:52 | 107 |
| 2015-01-01_01:01:53 | 109 |
| 2015-01-01_01:01:54 | 110 |
| 2015-01-01_01:01:55 | 109 |
| 2015-01-01_01:01:56 | 109 |
| 2015-01-01_01:01:57 | 109 |
| 2015-01-01_01:01:58 | 110 |
| 2015-01-01_01:01:59 | 109 |
| 2015-01-01_01:02:00 | 109 |
| 2015-01-01_01:02:01 | 111 |
| 2015-01-01_01:02:02 | 112 |
| 2015-01-01_01:02:03 | 112 |
| 2015-01-01_01:02:04 | 112 |
| 2015-01-01_01:02:05 | 111 |
| 2015-01-01_01:02:06 | 112 |
| 2015-01-01_01:02:07 | 110 |
| 2015-01-01_01:02:08 | 111 |
| 2015-01-01_01:02:09 | 109 |
| 2015-01-01_01:02:10 | 110 |
| 2015-01-01_01:02:11 | 106 |
| 2015-01-01_01:02:12 | 105 |
| 2015-01-01_01:02:13 | 102 |
| 2015-01-01_01:02:14 | 102 |
| 2015-01-01_01:02:15 | 104 |
| 2015-01-01_01:02:16 | 107 |
| 2015-01-01_01:02:17 | 108 |
| 2015-01-01_01:02:18 | 108 |
| 2015-01-01_01:02:19 | 108 |
| 2015-01-01_01:02:20 | 109 |
| 2015-01-01_01:02:21 | 109 |
| 2015-01-01_01:02:22 | 111 |
| 2015-01-01_01:02:23 | 110 |
| 2015-01-01_01:02:24 | 111 |
| 2015-01-01_01:02:25 | 111 |
| 2015-01-01_01:02:26 | 111 |
| 2015-01-01_01:02:27 | 111 |
| 2015-01-01_01:02:28 | 109 |
| 2015-01-01_01:02:29 | 108 |
| 2015-01-01_01:02:30 | 106 |
| 2015-01-01_01:02:31 | 105 |
| 2015-01-01_01:02:32 | 104 |
| 2015-01-01_01:02:33 | 101 |
| 2015-01-01_01:02:34 | 102 |
| 2015-01-01_01:02:35 | 102 |
| 2015-01-01_01:02:36 | 106 |
| 2015-01-01_01:02:37 | 107 |
| 2015-01-01_01:02:38 | 108 |
| 2015-01-01_01:02:39 | 108 |
| 2015-01-01_01:02:40 | 109 |
| 2015-01-01_01:02:41 | 111 |
| 2015-01-01_01:02:42 | 110 |
| 2015-01-01_01:02:43 | 111 |
| 2015-01-01_01:02:44 | 111 |
| 2015-01-01_01:02:45 | 111 |
| 2015-01-01_01:02:46 | 113 |
| 2015-01-01_01:02:47 | 112 |
| 2015-01-01_01:02:48 | 113 |
| 2015-01-01_01:02:49 | 114 |
| 2015-01-01_01:02:50 | 112 |
| 2015-01-01_01:02:51 | 111 |
| 2015-01-01_01:02:52 | 110 |
| 2015-01-01_01:02:53 | 110 |
| 2015-01-01_01:02:54 | 111 |
| 2015-01-01_01:02:55 | 112 |
| 2015-01-01_01:02:56 | 113 |
| 2015-01-01_01:02:57 | 113 |
| 2015-01-01_01:02:58 | 114 |
| 2015-01-01_01:02:59 | 116 |
| 2015-01-01_01:03:00 | 116 |
| 2015-01-01_01:03:01 | 116 |
| 2015-01-01_01:03:02 | 117 |
| 2015-01-01_01:03:03 | 117 |
| 2015-01-01_01:03:04 | 117 |
| 2015-01-01_01:03:05 | 117 |
| 2015-01-01_01:03:06 | 118 |
| 2015-01-01_01:03:07 | 118 |
| 2015-01-01_01:03:08 | 117 |
| 2015-01-01_01:03:09 | 119 |
| 2015-01-01_01:03:10 | 119 |
| 2015-01-01_01:03:11 | 121 |
| 2015-01-01_01:03:12 | 123 |
| 2015-01-01_01:03:13 | 125 |
| 2015-01-01_01:03:14 | 126 |
| 2015-01-01_01:03:15 | 129 |
| 2015-01-01_01:03:16 | 133 |
| 2015-01-01_01:03:17 | 137 |
| 2015-01-01_01:03:18 | 140 |
| 2015-01-01_01:03:19 | 144 |
| 2015-01-01_01:03:20 | 143 |
| 2015-01-01_01:03:21 | 142 |
| 2015-01-01_01:03:22 | 139 |
| 2015-01-01_01:03:23 | 138 |
| 2015-01-01_01:03:24 | 135 |
| 2015-01-01_01:03:25 | 135 |
| 2015-01-01_01:03:26 | 135 |
| 2015-01-01_01:03:27 | 134 |
| 2015-01-01_01:03:28 | 133 |
| 2015-01-01_01:03:29 | 133 |
| 2015-01-01_01:03:30 | 131 |
| 2015-01-01_01:03:31 | 130 |
| 2015-01-01_01:03:32 | 130 |
| 2015-01-01_01:03:33 | 128 |
| 2015-01-01_01:03:34 | 126 |
| 2015-01-01_01:03:35 | 125 |
| 2015-01-01_01:03:36 | 124 |
| 2015-01-01_01:03:37 | 120 |
| 2015-01-01_01:03:38 | 114 |
| 2015-01-01_01:03:39 | 104 |
| 2015-01-01_01:03:40 | 91 |
| 2015-01-01_01:03:41 | 83 |
| 2015-01-01_01:03:42 | 76 |
| 2015-01-01_01:03:43 | 73 |
| 2015-01-01_01:03:44 | 74 |
| 2015-01-01_01:03:45 | 76 |
| 2015-01-01_01:03:46 | 78 |
| 2015-01-01_01:03:47 | 80 |
| 2015-01-01_01:03:48 | 83 |
| 2015-01-01_01:03:49 | 83 |
| 2015-01-01_01:03:50 | 83 |
| 2015-01-01_01:03:51 | 81 |
| 2015-01-01_01:03:52 | 81 |
| 2015-01-01_01:03:53 | 79 |
| 2015-01-01_01:03:54 | 78 |
| 2015-01-01_01:03:55 | 77 |
| 2015-01-01_01:03:56 | 74 |
| 2015-01-01_01:03:57 | 74 |
| 2015-01-01_01:03:58 | 72 |
| 2015-01-01_01:03:59 | 71 |
| 2015-01-01_01:04:00 | 70 |
| 2015-01-01_01:04:01 | 70 |
| 2015-01-01_01:04:02 | 70 |
| 2015-01-01_01:04:03 | 70 |
| 2015-01-01_01:04:04 | 71 |
| 2015-01-01_01:04:05 | 73 |
| 2015-01-01_01:04:06 | 70 |
| 2015-01-01_01:04:07 | 69 |
| 2015-01-01_01:04:08 | 67 |
| 2015-01-01_01:04:09 | 66 |
| 2015-01-01_01:04:10 | 64 |
| 2015-01-01_01:04:11 | 63 |
| 2015-01-01_01:04:12 | 62 |
| 2015-01-01_01:04:13 | 62 |
| 2015-01-01_01:04:14 | 63 |
| 2015-01-01_01:04:15 | 61 |
| 2015-01-01_01:04:16 | 62 |
| 2015-01-01_01:04:17 | 64 |
| 2015-01-01_01:04:18 | 65 |
| 2015-01-01_01:04:19 | 68 |
| 2015-01-01_01:04:20 | 68 |
| 2015-01-01_01:04:21 | 69 |
| 2015-01-01_01:04:22 | 70 |
| 2015-01-01_01:04:23 | 70 |
| 2015-01-01_01:04:24 | 70 |
| 2015-01-01_01:04:25 | 70 |
| 2015-01-01_01:04:26 | 71 |
| 2015-01-01_01:04:27 | 69 |
| 2015-01-01_01:04:28 | 70 |
| 2015-01-01_01:04:29 | 69 |
| 2015-01-01_01:04:30 | 70 |
| 2015-01-01_01:04:31 | 69 |
| 2015-01-01_01:04:32 | 68 |
| 2015-01-01_01:04:33 | 68 |
| 2015-01-01_01:04:34 | 67 |
| 2015-01-01_01:04:35 | 67 |
| 2015-01-01_01:04:36 | 67 |
| 2015-01-01_01:04:37 | 67 |
| 2015-01-01_01:04:38 | 67 |
| 2015-01-01_01:04:39 | 67 |
| 2015-01-01_01:04:40 | 67 |
| 2015-01-01_01:04:41 | 67 |
| 2015-01-01_01:04:42 | 68 |
| 2015-01-01_01:04:43 | 68 |
| 2015-01-01_01:04:44 | 68 |
| 2015-01-01_01:04:45 | 68 |
| 2015-01-01_01:04:46 | 70 |
| 2015-01-01_01:04:47 | 71 |
| 2015-01-01_01:04:48 | 73 |
| 2015-01-01_01:04:49 | 74 |
| 2015-01-01_01:04:50 | 75 |
| 2015-01-01_01:04:51 | 76 |
| 2015-01-01_01:04:52 | 74 |
| 2015-01-01_01:04:53 | 74 |
| 2015-01-01_01:04:54 | 71 |
| 2015-01-01_01:04:55 | 70 |
| 2015-01-01_01:04:56 | 69 |
| 2015-01-01_01:04:57 | 68 |
| 2015-01-01_01:04:58 | 66 |
| 2015-01-01_01:04:59 | 67 |
| 2015-01-01_01:05:00 | 66 |
| 2015-01-01_01:05:01 | 67 |
| 2015-01-01_01:05:02 | 69 |
| 2015-01-01_01:05:03 | 71 |
| 2015-01-01_01:05:04 | 69 |
| 2015-01-01_01:05:05 | 68 |
| 2015-01-01_01:05:06 | 70 |
| 2015-01-01_01:05:07 | 70 |
| 2015-01-01_01:05:08 | 71 |
| 2015-01-01_01:05:09 | 71 |
| 2015-01-01_01:05:10 | 70 |
| 2015-01-01_01:05:11 | 69 |
| 2015-01-01_01:05:12 | 71 |
| 2015-01-01_01:05:13 | 72 |
| 2015-01-01_01:05:14 | 75 |
| 2015-01-01_01:05:15 | 81 |
| 2015-01-01_01:05:16 | 87 |
| 2015-01-01_01:05:17 | 90 |
| 2015-01-01_01:05:18 | 87 |
| 2015-01-01_01:05:19 | 82 |
| 2015-01-01_01:05:20 | 74 |
| 2015-01-01_01:05:21 | 67 |
| 2015-01-01_01:05:22 | 61 |
| 2015-01-01_01:05:23 | 56 |
| 2015-01-01_01:05:24 | 54 |
| 2015-01-01_01:05:25 | 52 |
| 2015-01-01_01:05:26 | 53 |
| 2015-01-01_01:05:27 | 54 |
| 2015-01-01_01:05:28 | 55 |
| 2015-01-01_01:05:29 | 54 |
| 2015-01-01_01:05:30 | 56 |
| 2015-01-01_01:05:31 | 55 |
| 2015-01-01_01:05:32 | 54 |
| 2015-01-01_01:05:33 | 53 |
| 2015-01-01_01:05:34 | 53 |
| 2015-01-01_01:05:35 | 54 |
| 2015-01-01_01:05:36 | 56 |
| 2015-01-01_01:05:37 | 56 |
| 2015-01-01_01:05:38 | 56 |
| 2015-01-01_01:05:39 | 54 |
| 2015-01-01_01:05:40 | 54 |
| 2015-01-01_01:05:41 | 53 |
| 2015-01-01_01:05:42 | 53 |
| 2015-01-01_01:05:43 | 53 |
| 2015-01-01_01:05:44 | 55 |
| 2015-01-01_01:05:45 | 56 |
| 2015-01-01_01:05:46 | 57 |
| 2015-01-01_01:05:47 | 56 |
| 2015-01-01_01:05:48 | 55 |
| 2015-01-01_01:05:49 | 56 |
| 2015-01-01_01:05:50 | 54 |
| 2015-01-01_01:05:51 | 55 |
| 2015-01-01_01:05:52 | 56 |
| 2015-01-01_01:05:53 | 56 |
| 2015-01-01_01:05:54 | 56 |
| 2015-01-01_01:05:55 | 57 |
| 2015-01-01_01:05:56 | 60 |
| 2015-01-01_01:05:57 | 62 |
| 2015-01-01_01:05:58 | 64 |
| 2015-01-01_01:05:59 | 65 |
| 2015-01-01_01:06:00 | 66 |
| 2015-01-01_01:06:01 | 66 |
| 2015-01-01_01:06:02 | 66 |
| 2015-01-01_01:06:03 | 68 |
| 2015-01-01_01:06:04 | 69 |
| 2015-01-01_01:06:05 | 71 |
| 2015-01-01_01:06:06 | 71 |
| 2015-01-01_01:06:07 | 71 |
| 2015-01-01_01:06:08 | 72 |
| 2015-01-01_01:06:09 | 73 |
| 2015-01-01_01:06:10 | 72 |
| 2015-01-01_01:06:11 | 72 |
| 2015-01-01_01:06:12 | 70 |
| 2015-01-01_01:06:13 | 70 |
| 2015-01-01_01:06:14 | 68 |
| 2015-01-01_01:06:15 | 67 |
| 2015-01-01_01:06:16 | 66 |
| 2015-01-01_01:06:17 | 66 |
| 2015-01-01_01:06:18 | 66 |
| 2015-01-01_01:06:19 | 66 |
| 2015-01-01_01:06:20 | 66 |
| 2015-01-01_01:06:21 | 66 |
| 2015-01-01_01:06:22 | 65 |
| 2015-01-01_01:06:23 | 63 |
| 2015-01-01_01:06:24 | 63 |
| 2015-01-01_01:06:25 | 63 |
| 2015-01-01_01:06:26 | 63 |
| 2015-01-01_01:06:27 | 61 |
| 2015-01-01_01:06:28 | 60 |
| 2015-01-01_01:06:29 | 59 |
| 2015-01-01_01:06:30 | 57 |
| 2015-01-01_01:06:31 | 56 |
| 2015-01-01_01:06:32 | 57 |
| 2015-01-01_01:06:33 | 55 |
| 2015-01-01_01:06:34 | 52 |
| 2015-01-01_01:06:35 | 50 |
| 2015-01-01_01:06:36 | 52 |
| 2015-01-01_01:06:37 | 53 |
| 2015-01-01_01:06:38 | 53 |
| 2015-01-01_01:06:39 | 54 |
| 2015-01-01_01:06:40 | 54 |
| 2015-01-01_01:06:41 | 52 |
| 2015-01-01_01:06:42 | 51 |
| 2015-01-01_01:06:43 | 49 |
| 2015-01-01_01:06:44 | 46 |
| 2015-01-01_01:06:45 | 44 |
| 2015-01-01_01:06:46 | 42 |
| 2015-01-01_01:06:47 | 39 |
| 2015-01-01_01:06:48 | 38 |
| 2015-01-01_01:06:49 | 35 |
| 2015-01-01_01:06:50 | 31 |
| 2015-01-01_01:06:51 | 28 |
| 2015-01-01_01:06:52 | 22 |
| 2015-01-01_01:06:53 | 17 |
| 2015-01-01_01:06:54 | 13 |
| 2015-01-01_01:06:55 | 7 |
| 2015-01-01_01:06:56 | 3 |
| 2015-01-01_01:06:57 | 1 |
| 2015-01-01_01:06:58 | 0 |
| 2015-01-01_01:06:59 | 0 |
| 2015-01-01_01:07:00 | 0 |
| 2015-01-01_01:07:01 | 0 |
| 2015-01-01_01:07:02 | 0 |
| 2015-01-01_01:07:03 | 0 |
| 2015-01-01_01:07:04 | 0 |
| 2015-01-01_01:07:05 | 0 |
| 2015-01-01_01:07:06 | 0 |
| 2015-01-01_01:07:07 | 5 |
| 2015-01-01_01:07:08 | 10 |
| 2015-01-01_01:07:09 | 13 |
| 2015-01-01_01:07:10 | 13 |
| 2015-01-01_01:07:11 | 11 |
| 2015-01-01_01:07:12 | 12 |
| 2015-01-01_01:07:13 | 12 |
| 2015-01-01_01:07:14 | 10 |
| 2015-01-01_01:07:15 | 10 |
| 2015-01-01_01:07:16 | 10 |
| 2015-01-01_01:07:17 | 11 |
| 2015-01-01_01:07:18 | 9 |
| 2015-01-01_01:07:19 | 10 |
| 2015-01-01_01:07:20 | 9 |
| 2015-01-01_01:07:21 | 12 |
| 2015-01-01_01:07:22 | 14 |
| 2015-01-01_01:07:23 | 18 |
| 2015-01-01_01:07:24 | 17 |
| 2015-01-01_01:07:25 | 17 |
| 2015-01-01_01:07:26 | 17 |
| 2015-01-01_01:07:27 | 19 |
| 2015-01-01_01:07:28 | 21 |
| 2015-01-01_01:07:29 | 22 |
| 2015-01-01_01:07:30 | 22 |
| 2015-01-01_01:07:31 | 22 |
| 2015-01-01_01:07:32 | 21 |
| 2015-01-01_01:07:33 | 20 |
| 2015-01-01_01:07:34 | 19 |
| 2015-01-01_01:07:35 | 21 |
| 2015-01-01_01:07:36 | 25 |
| 2015-01-01_01:07:37 | 33 |
| 2015-01-01_01:07:38 | 36 |
| 2015-01-01_01:07:39 | 40 |
| 2015-01-01_01:07:40 | 41 |
| 2015-01-01_01:07:41 | 43 |
| 2015-01-01_01:07:42 | 45 |
| 2015-01-01_01:07:43 | 52 |
| 2015-01-01_01:07:44 | 56 |
| 2015-01-01_01:07:45 | 56 |
| 2015-01-01_01:07:46 | 58 |
| 2015-01-01_01:07:47 | 62 |
| 2015-01-01_01:07:48 | 67 |
| 2015-01-01_01:07:49 | 68 |
| 2015-01-01_01:07:50 | 67 |
| 2015-01-01_01:07:51 | 64 |
| 2015-01-01_01:07:52 | 64 |
| 2015-01-01_01:07:53 | 65 |
| 2015-01-01_01:07:54 | 69 |
| 2015-01-01_01:07:55 | 71 |
| 2015-01-01_01:07:56 | 75 |
| 2015-01-01_01:07:57 | 81 |
| 2015-01-01_01:07:58 | 85 |
| 2015-01-01_01:07:59 | 84 |
| 2015-01-01_01:08:00 | 82 |
| 2015-01-01_01:08:01 | 81 |
| 2015-01-01_01:08:02 | 80 |
| 2015-01-01_01:08:03 | 81 |
| 2015-01-01_01:08:04 | 84 |
| 2015-01-01_01:08:05 | 85 |
| 2015-01-01_01:08:06 | 86 |
| 2015-01-01_01:08:07 | 86 |
| 2015-01-01_01:08:08 | 86 |
| 2015-01-01_01:08:09 | 88 |
| 2015-01-01_01:08:10 | 94 |
| 2015-01-01_01:08:11 | 101 |
| 2015-01-01_01:08:12 | 107 |
| 2015-01-01_01:08:13 | 112 |
| 2015-01-01_01:08:14 | 115 |
| 2015-01-01_01:08:15 | 116 |
| 2015-01-01_01:08:16 | 115 |
| 2015-01-01_01:08:17 | 114 |
| 2015-01-01_01:08:18 | 112 |
| 2015-01-01_01:08:19 | 111 |
| 2015-01-01_01:08:20 | 112 |
| 2015-01-01_01:08:21 | 110 |
| 2015-01-01_01:08:22 | 110 |
| 2015-01-01_01:08:23 | 107 |
| 2015-01-01_01:08:24 | 105 |
| 2015-01-01_01:08:25 | 105 |
| 2015-01-01_01:08:26 | 105 |
| 2015-01-01_01:08:27 | 102 |
| 2015-01-01_01:08:28 | 100 |
| 2015-01-01_01:08:29 | 99 |
| 2015-01-01_01:08:30 | 99 |
| 2015-01-01_01:08:31 | 99 |
| 2015-01-01_01:08:32 | 97 |
| 2015-01-01_01:08:33 | 96 |
| 2015-01-01_01:08:34 | 93 |
| 2015-01-01_01:08:35 | 90 |
| 2015-01-01_01:08:36 | 88 |
| 2015-01-01_01:08:37 | 84 |
| 2015-01-01_01:08:38 | 83 |
| 2015-01-01_01:08:39 | 79 |
| 2015-01-01_01:08:40 | 74 |
| 2015-01-01_01:08:41 | 67 |
| 2015-01-01_01:08:42 | 61 |
| 2015-01-01_01:08:43 | 58 |
| 2015-01-01_01:08:44 | 56 |
| 2015-01-01_01:08:45 | 54 |
| 2015-01-01_01:08:46 | 53 |
| 2015-01-01_01:08:47 | 55 |
| 2015-01-01_01:08:48 | 57 |
| 2015-01-01_01:08:49 | 60 |
| 2015-01-01_01:08:50 | 63 |
| 2015-01-01_01:08:51 | 64 |
| 2015-01-01_01:08:52 | 65 |
| 2015-01-01_01:08:53 | 64 |
| 2015-01-01_01:08:54 | 65 |
| 2015-01-01_01:08:55 | 64 |
| 2015-01-01_01:08:56 | 64 |
| 2015-01-01_01:08:57 | 67 |
| 2015-01-01_01:08:58 | 69 |
| 2015-01-01_01:08:59 | 68 |
| 2015-01-01_01:09:00 | 70 |
| 2015-01-01_01:09:01 | 71 |
| 2015-01-01_01:09:02 | 73 |
| 2015-01-01_01:09:03 | 77 |
| 2015-01-01_01:09:04 | 81 |
| 2015-01-01_01:09:05 | 89 |
| 2015-01-01_01:09:06 | 91 |
| 2015-01-01_01:09:07 | 91 |
| 2015-01-01_01:09:08 | 89 |
| 2015-01-01_01:09:09 | 88 |
| 2015-01-01_01:09:10 | 86 |
| 2015-01-01_01:09:11 | 79 |
| 2015-01-01_01:09:12 | 76 |
| 2015-01-01_01:09:13 | 75 |
| 2015-01-01_01:09:14 | 76 |
| 2015-01-01_01:09:15 | 76 |
| 2015-01-01_01:09:16 | 75 |
| 2015-01-01_01:09:17 | 74 |
| 2015-01-01_01:09:18 | 72 |
| 2015-01-01_01:09:19 | 71 |
| 2015-01-01_01:09:20 | 70 |
| 2015-01-01_01:09:21 | 71 |
| 2015-01-01_01:09:22 | 71 |
| 2015-01-01_01:09:23 | 71 |
| 2015-01-01_01:09:24 | 72 |
| 2015-01-01_01:09:25 | 74 |
| 2015-01-01_01:09:26 | 75 |
| 2015-01-01_01:09:27 | 75 |
| 2015-01-01_01:09:28 | 74 |
| 2015-01-01_01:09:29 | 71 |
| 2015-01-01_01:09:30 | 69 |
| 2015-01-01_01:09:31 | 68 |
| 2015-01-01_01:09:32 | 64 |
| 2015-01-01_01:09:33 | 62 |
| 2015-01-01_01:09:34 | 62 |
| 2015-01-01_01:09:35 | 62 |
| 2015-01-01_01:09:36 | 60 |
| 2015-01-01_01:09:37 | 61 |
| 2015-01-01_01:09:38 | 59 |
| 2015-01-01_01:09:39 | 60 |
| 2015-01-01_01:09:40 | 58 |
| 2015-01-01_01:09:41 | 58 |
| 2015-01-01_01:09:42 | 59 |
| 2015-01-01_01:09:43 | 59 |
| 2015-01-01_01:09:44 | 62 |
| 2015-01-01_01:09:45 | 65 |
| 2015-01-01_01:09:46 | 66 |
| 2015-01-01_01:09:47 | 67 |
| 2015-01-01_01:09:48 | 68 |
| 2015-01-01_01:09:49 | 69 |
| 2015-01-01_01:09:50 | 68 |
| 2015-01-01_01:09:51 | 67 |
| 2015-01-01_01:09:52 | 66 |
| 2015-01-01_01:09:53 | 67 |
| 2015-01-01_01:09:54 | 67 |
| 2015-01-01_01:09:55 | 67 |
| 2015-01-01_01:09:56 | 67 |
| 2015-01-01_01:09:57 | 67 |
| 2015-01-01_01:09:58 | 66 |
| 2015-01-01_01:09:59 | 66 |
| 2015-01-01_01:10:00 | 66 |
| 2015-01-01_01:10:01 | 68 |
| 2015-01-01_01:10:02 | 70 |
| 2015-01-01_01:10:03 | 71 |
| 2015-01-01_01:10:04 | 73 |
| 2015-01-01_01:10:05 | 78 |
| 2015-01-01_01:10:06 | 76 |
| 2015-01-01_01:10:07 | 76 |
| 2015-01-01_01:10:08 | 73 |
| 2015-01-01_01:10:09 | 72 |
| 2015-01-01_01:10:10 | 69 |
| 2015-01-01_01:10:11 | 68 |
| 2015-01-01_01:10:12 | 69 |
| 2015-01-01_01:10:13 | 69 |
| 2015-01-01_01:10:14 | 69 |
| 2015-01-01_01:10:15 | 69 |
| 2015-01-01_01:10:16 | 71 |
| 2015-01-01_01:10:17 | 73 |
| 2015-01-01_01:10:18 | 78 |
| 2015-01-01_01:10:19 | 84 |
| 2015-01-01_01:10:20 | 92 |
| 2015-01-01_01:10:21 | 98 |
| 2015-01-01_01:10:22 | 98 |
| 2015-01-01_01:10:23 | 94 |
| 2015-01-01_01:10:24 | 85 |
| 2015-01-01_01:10:25 | 78 |
| 2015-01-01_01:10:26 | 69 |
| 2015-01-01_01:10:27 | 67 |
| 2015-01-01_01:10:28 | 67 |
| 2015-01-01_01:10:29 | 69 |
| 2015-01-01_01:10:30 | 69 |
| 2015-01-01_01:10:31 | 69 |
| 2015-01-01_01:10:32 | 68 |
| 2015-01-01_01:10:33 | 71 |
| 2015-01-01_01:10:34 | 77 |
| 2015-01-01_01:10:35 | 85 |
| 2015-01-01_01:10:36 | 93 |
| 2015-01-01_01:10:37 | 100 |
| 2015-01-01_01:10:38 | 102 |
| 2015-01-01_01:10:39 | 100 |
| 2015-01-01_01:10:40 | 98 |
| 2015-01-01_01:10:41 | 94 |
| 2015-01-01_01:10:42 | 89 |
| 2015-01-01_01:10:43 | 83 |
| 2015-01-01_01:10:44 | 75 |
| 2015-01-01_01:10:45 | 70 |
| 2015-01-01_01:10:46 | 69 |
| 2015-01-01_01:10:47 | 71 |
| 2015-01-01_01:10:48 | 74 |
| 2015-01-01_01:10:49 | 76 |
| 2015-01-01_01:10:50 | 80 |
| 2015-01-01_01:10:51 | 86 |
| 2015-01-01_01:10:52 | 94 |
| 2015-01-01_01:10:53 | 101 |
| 2015-01-01_01:10:54 | 110 |
| 2015-01-01_01:10:55 | 115 |
| 2015-01-01_01:10:56 | 118 |
| 2015-01-01_01:10:57 | 121 |
| 2015-01-01_01:10:58 | 125 |
| 2015-01-01_01:10:59 | 129 |
| 2015-01-01_01:11:00 | 128 |
| 2015-01-01_01:11:01 | 129 |
| 2015-01-01_01:11:02 | 129 |
| 2015-01-01_01:11:03 | 127 |
| 2015-01-01_01:11:04 | 124 |
| 2015-01-01_01:11:05 | 122 |
| 2015-01-01_01:11:06 | 120 |
| 2015-01-01_01:11:07 | 117 |
| 2015-01-01_01:11:08 | 114 |
| 2015-01-01_01:11:09 | 113 |
| 2015-01-01_01:11:10 | 111 |
| 2015-01-01_01:11:11 | 108 |
| 2015-01-01_01:11:12 | 106 |
| 2015-01-01_01:11:13 | 105 |
| 2015-01-01_01:11:14 | 101 |
| 2015-01-01_01:11:15 | 101 |
| 2015-01-01_01:11:16 | 101 |
| 2015-01-01_01:11:17 | 100 |
| 2015-01-01_01:11:18 | 101 |
| 2015-01-01_01:11:19 | 99 |
| 2015-01-01_01:11:20 | 100 |
| 2015-01-01_01:11:21 | 99 |
| 2015-01-01_01:11:22 | 98 |
| 2015-01-01_01:11:23 | 97 |
| 2015-01-01_01:11:24 | 97 |
| 2015-01-01_01:11:25 | 98 |
| 2015-01-01_01:11:26 | 99 |
| 2015-01-01_01:11:27 | 99 |
| 2015-01-01_01:11:28 | 98 |
| 2015-01-01_01:11:29 | 99 |
| 2015-01-01_01:11:30 | 99 |
| 2015-01-01_01:11:31 | 98 |
| 2015-01-01_01:11:32 | 98 |
| 2015-01-01_01:11:33 | 98 |
| 2015-01-01_01:11:34 | 96 |
| 2015-01-01_01:11:35 | 96 |
| 2015-01-01_01:11:36 | 95 |
| 2015-01-01_01:11:37 | 94 |
| 2015-01-01_01:11:38 | 95 |
| 2015-01-01_01:11:39 | 92 |
| 2015-01-01_01:11:40 | 91 |
| 2015-01-01_01:11:41 | 91 |
| 2015-01-01_01:11:42 | 89 |
| 2015-01-01_01:11:43 | 90 |
| 2015-01-01_01:11:44 | 90 |
| 2015-01-01_01:11:45 | 94 |
| 2015-01-01_01:11:46 | 96 |
| 2015-01-01_01:11:47 | 97 |
| 2015-01-01_01:11:48 | 97 |
| 2015-01-01_01:11:49 | 97 |
| 2015-01-01_01:11:50 | 98 |
| 2015-01-01_01:11:51 | 98 |
| 2015-01-01_01:11:52 | 98 |
| 2015-01-01_01:11:53 | 99 |
| 2015-01-01_01:11:54 | 97 |
| 2015-01-01_01:11:55 | 97 |
| 2015-01-01_01:11:56 | 97 |
| 2015-01-01_01:11:57 | 97 |
| 2015-01-01_01:11:58 | 97 |
| 2015-01-01_01:11:59 | 96 |
| 2015-01-01_01:12:00 | 94 |
| 2015-01-01_01:12:01 | 93 |
| 2015-01-01_01:12:02 | 92 |
| 2015-01-01_01:12:03 | 91 |
| 2015-01-01_01:12:04 | 90 |
| 2015-01-01_01:12:05 | 91 |
| 2015-01-01_01:12:06 | 91 |
| 2015-01-01_01:12:07 | 91 |
| 2015-01-01_01:12:08 | 92 |
| 2015-01-01_01:12:09 | 91 |
| 2015-01-01_01:12:10 | 91 |
| 2015-01-01_01:12:11 | 88 |
| 2015-01-01_01:12:12 | 87 |
| 2015-01-01_01:12:13 | 87 |
| 2015-01-01_01:12:14 | 86 |
| 2015-01-01_01:12:15 | 86 |
| 2015-01-01_01:12:16 | 84 |
| 2015-01-01_01:12:17 | 83 |
| 2015-01-01_01:12:18 | 82 |
| 2015-01-01_01:12:19 | 80 |
| 2015-01-01_01:12:20 | 77 |
| 2015-01-01_01:12:21 | 77 |
| 2015-01-01_01:12:22 | 74 |
| 2015-01-01_01:12:23 | 73 |
| 2015-01-01_01:12:24 | 71 |
| 2015-01-01_01:12:25 | 70 |
| 2015-01-01_01:12:26 | 69 |
| 2015-01-01_01:12:27 | 69 |
| 2015-01-01_01:12:28 | 70 |
| 2015-01-01_01:12:29 | 70 |
| 2015-01-01_01:12:30 | 73 |
| 2015-01-01_01:12:31 | 75 |
| 2015-01-01_01:12:32 | 75 |
| 2015-01-01_01:12:33 | 76 |
| 2015-01-01_01:12:34 | 77 |
| 2015-01-01_01:12:35 | 78 |
| 2015-01-01_01:12:36 | 78 |
| 2015-01-01_01:12:37 | 78 |
| 2015-01-01_01:12:38 | 76 |
| 2015-01-01_01:12:39 | 75 |
| 2015-01-01_01:12:40 | 76 |
| 2015-01-01_01:12:41 | 78 |
| 2015-01-01_01:12:42 | 79 |
| 2015-01-01_01:12:43 | 81 |
| 2015-01-01_01:12:44 | 79 |
| 2015-01-01_01:12:45 | 78 |
| 2015-01-01_01:12:46 | 77 |
| 2015-01-01_01:12:47 | 77 |
| 2015-01-01_01:12:48 | 75 |
| 2015-01-01_01:12:49 | 74 |
| 2015-01-01_01:12:50 | 73 |
| 2015-01-01_01:12:51 | 71 |
| 2015-01-01_01:12:52 | 71 |
| 2015-01-01_01:12:53 | 74 |
| 2015-01-01_01:12:54 | 75 |
| 2015-01-01_01:12:55 | 76 |
| 2015-01-01_01:12:56 | 77 |
| 2015-01-01_01:12:57 | 76 |
| 2015-01-01_01:12:58 | 77 |
| 2015-01-01_01:12:59 | 76 |
| 2015-01-01_01:13:00 | 78 |
| 2015-01-01_01:13:01 | 78 |
| 2015-01-01_01:13:02 | 79 |
| 2015-01-01_01:13:03 | 79 |
| 2015-01-01_01:13:04 | 80 |
| 2015-01-01_01:13:05 | 80 |
| 2015-01-01_01:13:06 | 79 |
| 2015-01-01_01:13:07 | 79 |
| 2015-01-01_01:13:08 | 79 |
| 2015-01-01_01:13:09 | 78 |
| 2015-01-01_01:13:10 | 76 |
| 2015-01-01_01:13:11 | 76 |
| 2015-01-01_01:13:12 | 75 |
| 2015-01-01_01:13:13 | 76 |
| 2015-01-01_01:13:14 | 76 |
| 2015-01-01_01:13:15 | 76 |
| 2015-01-01_01:13:16 | 77 |
| 2015-01-01_01:13:17 | 77 |
| 2015-01-01_01:13:18 | 78 |
| 2015-01-01_01:13:19 | 78 |
| 2015-01-01_01:13:20 | 80 |
| 2015-01-01_01:13:21 | 81 |
| 2015-01-01_01:13:22 | 79 |
| 2015-01-01_01:13:23 | 77 |
| 2015-01-01_01:13:24 | 75 |
| 2015-01-01_01:13:25 | 74 |
| 2015-01-01_01:13:26 | 72 |
| 2015-01-01_01:13:27 | 70 |
| 2015-01-01_01:13:28 | 68 |
| 2015-01-01_01:13:29 | 67 |
| 2015-01-01_01:13:30 | 65 |
| 2015-01-01_01:13:31 | 63 |
| 2015-01-01_01:13:32 | 63 |
| 2015-01-01_01:13:33 | 62 |
| 2015-01-01_01:13:34 | 61 |
| 2015-01-01_01:13:35 | 63 |
| 2015-01-01_01:13:36 | 64 |
| 2015-01-01_01:13:37 | 63 |
| 2015-01-01_01:13:38 | 63 |
| 2015-01-01_01:13:39 | 64 |
| 2015-01-01_01:13:40 | 67 |
| 2015-01-01_01:13:41 | 67 |
| 2015-01-01_01:13:42 | 68 |
| 2015-01-01_01:13:43 | 72 |
| 2015-01-01_01:13:44 | 80 |
| 2015-01-01_01:13:45 | 85 |
| 2015-01-01_01:13:46 | 88 |
| 2015-01-01_01:13:47 | 86 |
| 2015-01-01_01:13:48 | 86 |
| 2015-01-01_01:13:49 | 88 |
| 2015-01-01_01:13:50 | 88 |
| 2015-01-01_01:13:51 | 89 |
| 2015-01-01_01:13:52 | 90 |
| 2015-01-01_01:13:53 | 92 |
| 2015-01-01_01:13:54 | 92 |
| 2015-01-01_01:13:55 | 94 |
| 2015-01-01_01:13:56 | 96 |
| 2015-01-01_01:13:57 | 96 |
| 2015-01-01_01:13:58 | 96 |
| 2015-01-01_01:13:59 | 97 |
| 2015-01-01_01:14:00 | 96 |
| 2015-01-01_01:14:01 | 96 |
| 2015-01-01_01:14:02 | 93 |
| 2015-01-01_01:14:03 | 93 |
| 2015-01-01_01:14:04 | 92 |
| 2015-01-01_01:14:05 | 94 |
| 2015-01-01_01:14:06 | 92 |
| 2015-01-01_01:14:07 | 93 |
| 2015-01-01_01:14:08 | 94 |
| 2015-01-01_01:14:09 | 96 |
| 2015-01-01_01:14:10 | 95 |
| 2015-01-01_01:14:11 | 95 |
| 2015-01-01_01:14:12 | 94 |
| 2015-01-01_01:14:13 | 96 |
| 2015-01-01_01:14:14 | 94 |
| 2015-01-01_01:14:15 | 92 |
| 2015-01-01_01:14:16 | 92 |
| 2015-01-01_01:14:17 | 94 |
| 2015-01-01_01:14:18 | 95 |
| 2015-01-01_01:14:19 | 96 |
| 2015-01-01_01:14:20 | 95 |
| 2015-01-01_01:14:21 | 94 |
| 2015-01-01_01:14:22 | 94 |
| 2015-01-01_01:14:23 | 94 |
| 2015-01-01_01:14:24 | 94 |
| 2015-01-01_01:14:25 | 96 |
| 2015-01-01_01:14:26 | 95 |
| 2015-01-01_01:14:27 | 96 |
| 2015-01-01_01:14:28 | 94 |
| 2015-01-01_01:14:29 | 95 |
| 2015-01-01_01:14:30 | 93 |
| 2015-01-01_01:14:31 | 94 |
| 2015-01-01_01:14:32 | 93 |
| 2015-01-01_01:14:33 | 92 |
| 2015-01-01_01:14:34 | 94 |
| 2015-01-01_01:14:35 | 95 |
| 2015-01-01_01:14:36 | 97 |
| 2015-01-01_01:14:37 | 99 |
| 2015-01-01_01:14:38 | 100 |
| 2015-01-01_01:14:39 | 101 |
| 2015-01-01_01:14:40 | 102 |
| 2015-01-01_01:14:41 | 104 |
| 2015-01-01_01:14:42 | 102 |
| 2015-01-01_01:14:43 | 104 |
| 2015-01-01_01:14:44 | 104 |
| 2015-01-01_01:14:45 | 106 |
| 2015-01-01_01:14:46 | 106 |
| 2015-01-01_01:14:47 | 107 |
| 2015-01-01_01:14:48 | 108 |
| 2015-01-01_01:14:49 | 107 |
| 2015-01-01_01:14:50 | 109 |
| 2015-01-01_01:14:51 | 107 |
| 2015-01-01_01:14:52 | 107 |
| 2015-01-01_01:14:53 | 105 |
| 2015-01-01_01:14:54 | 106 |
| 2015-01-01_01:14:55 | 106 |
| 2015-01-01_01:14:56 | 107 |
| 2015-01-01_01:14:57 | 107 |
| 2015-01-01_01:14:58 | 107 |
| 2015-01-01_01:14:59 | 107 |
| 2015-01-01_01:15:00 | 108 |
| 2015-01-01_01:15:01 | 107 |
| 2015-01-01_01:15:02 | 108 |
| 2015-01-01_01:15:03 | 108 |
| 2015-01-01_01:15:04 | 108 |
| 2015-01-01_01:15:05 | 108 |
| 2015-01-01_01:15:06 | 110 |
| 2015-01-01_01:15:07 | 109 |
| 2015-01-01_01:15:08 | 111 |
| 2015-01-01_01:15:09 | 110 |
| 2015-01-01_01:15:10 | 111 |
| 2015-01-01_01:15:11 | 110 |
| 2015-01-01_01:15:12 | 111 |
| 2015-01-01_01:15:13 | 110 |
| 2015-01-01_01:15:14 | 112 |
| 2015-01-01_01:15:15 | 110 |
| 2015-01-01_01:15:16 | 111 |
| 2015-01-01_01:15:17 | 111 |
| 2015-01-01_01:15:18 | 112 |
| 2015-01-01_01:15:19 | 110 |
| 2015-01-01_01:15:20 | 110 |
| 2015-01-01_01:15:21 | 110 |
| 2015-01-01_01:15:22 | 111 |
| 2015-01-01_01:15:23 | 110 |
| 2015-01-01_01:15:24 | 110 |
| 2015-01-01_01:15:25 | 110 |
| 2015-01-01_01:15:26 | 112 |
| 2015-01-01_01:15:27 | 111 |
| 2015-01-01_01:15:28 | 111 |
| 2015-01-01_01:15:29 | 111 |
| 2015-01-01_01:15:30 | 112 |
| 2015-01-01_01:15:31 | 112 |
| 2015-01-01_01:15:32 | 112 |
| 2015-01-01_01:15:33 | 112 |
| 2015-01-01_01:15:34 | 111 |
| 2015-01-01_01:15:35 | 111 |
| 2015-01-01_01:15:36 | 111 |
| 2015-01-01_01:15:37 | 109 |
| 2015-01-01_01:15:38 | 109 |
| 2015-01-01_01:15:39 | 106 |
| 2015-01-01_01:15:40 | 104 |
| 2015-01-01_01:15:41 | 102 |
| 2015-01-01_01:15:42 | 100 |
| 2015-01-01_01:15:43 | 98 |
| 2015-01-01_01:15:44 | 96 |
| 2015-01-01_01:15:45 | 96 |
| 2015-01-01_01:15:46 | 96 |
| 2015-01-01_01:15:47 | 97 |
| 2015-01-01_01:15:48 | 96 |
| 2015-01-01_01:15:49 | 94 |
| 2015-01-01_01:15:50 | 93 |
| 2015-01-01_01:15:51 | 92 |
| 2015-01-01_01:15:52 | 92 |
| 2015-01-01_01:15:53 | 94 |
| 2015-01-01_01:15:54 | 97 |
| 2015-01-01_01:15:55 | 99 |
| 2015-01-01_01:15:56 | 100 |
| 2015-01-01_01:15:57 | 100 |
| 2015-01-01_01:15:58 | 102 |
| 2015-01-01_01:15:59 | 101 |
| 2015-01-01_01:16:00 | 99 |
| 2015-01-01_01:16:01 | 97 |
| 2015-01-01_01:16:02 | 96 |
| 2015-01-01_01:16:03 | 92 |
| 2015-01-01_01:16:04 | 86 |
| 2015-01-01_01:16:05 | 79 |
| 2015-01-01_01:16:06 | 72 |
| 2015-01-01_01:16:07 | 70 |
| 2015-01-01_01:16:08 | 68 |
| 2015-01-01_01:16:09 | 66 |
| 2015-01-01_01:16:10 | 66 |
| 2015-01-01_01:16:11 | 66 |
| 2015-01-01_01:16:12 | 65 |
| 2015-01-01_01:16:13 | 64 |
| 2015-01-01_01:16:14 | 63 |
| 2015-01-01_01:16:15 | 62 |
| 2015-01-01_01:16:16 | 61 |
| 2015-01-01_01:16:17 | 59 |
| 2015-01-01_01:16:18 | 59 |
| 2015-01-01_01:16:19 | 59 |
| 2015-01-01_01:16:20 | 59 |
| 2015-01-01_01:16:21 | 61 |
| 2015-01-01_01:16:22 | 62 |
| 2015-01-01_01:16:23 | 64 |
| 2015-01-01_01:16:24 | 65 |
| 2015-01-01_01:16:25 | 66 |
| 2015-01-01_01:16:26 | 66 |
| 2015-01-01_01:16:27 | 65 |
| 2015-01-01_01:16:28 | 65 |
| 2015-01-01_01:16:29 | 64 |
| 2015-01-01_01:16:30 | 64 |
| 2015-01-01_01:16:31 | 62 |
| 2015-01-01_01:16:32 | 62 |
| 2015-01-01_01:16:33 | 62 |
| 2015-01-01_01:16:34 | 62 |
| 2015-01-01_01:16:35 | 61 |
| 2015-01-01_01:16:36 | 61 |
| 2015-01-01_01:16:37 | 61 |
| 2015-01-01_01:16:38 | 62 |
| 2015-01-01_01:16:39 | 61 |
| 2015-01-01_01:16:40 | 60 |
| 2015-01-01_01:16:41 | 60 |
| 2015-01-01_01:16:42 | 61 |
| 2015-01-01_01:16:43 | 63 |
| 2015-01-01_01:16:44 | 67 |
| 2015-01-01_01:16:45 | 74 |
| 2015-01-01_01:16:46 | 81 |
| 2015-01-01_01:16:47 | 90 |
| 2015-01-01_01:16:48 | 98 |
| 2015-01-01_01:16:49 | 102 |
| 2015-01-01_01:16:50 | 102 |
| 2015-01-01_01:16:51 | 106 |
| 2015-01-01_01:16:52 | 106 |
| 2015-01-01_01:16:53 | 107 |
| 2015-01-01_01:16:54 | 107 |
| 2015-01-01_01:16:55 | 106 |
| 2015-01-01_01:16:56 | 105 |
| 2015-01-01_01:16:57 | 105 |
| 2015-01-01_01:16:58 | 104 |
| 2015-01-01_01:16:59 | 105 |
| 2015-01-01_01:17:00 | 102 |
| 2015-01-01_01:17:01 | 102 |
| 2015-01-01_01:17:02 | 101 |
| 2015-01-01_01:17:03 | 102 |
| 2015-01-01_01:17:04 | 104 |
| 2015-01-01_01:17:05 | 105 |
| 2015-01-01_01:17:06 | 102 |
| 2015-01-01_01:17:07 | 101 |
| 2015-01-01_01:17:08 | 101 |
| 2015-01-01_01:17:09 | 101 |
| 2015-01-01_01:17:10 | 100 |
| 2015-01-01_01:17:11 | 99 |
| 2015-01-01_01:17:12 | 98 |
| 2015-01-01_01:17:13 | 96 |
| 2015-01-01_01:17:14 | 94 |
| 2015-01-01_01:17:15 | 95 |
| 2015-01-01_01:17:16 | 95 |
| 2015-01-01_01:17:17 | 95 |
| 2015-01-01_01:17:18 | 96 |
| 2015-01-01_01:17:19 | 99 |
| 2015-01-01_01:17:20 | 101 |
| 2015-01-01_01:17:21 | 104 |
| 2015-01-01_01:17:22 | 106 |
| 2015-01-01_01:17:23 | 107 |
| 2015-01-01_01:17:24 | 107 |
| 2015-01-01_01:17:25 | 106 |
| 2015-01-01_01:17:26 | 105 |
| 2015-01-01_01:17:27 | 102 |
| 2015-01-01_01:17:28 | 100 |
| 2015-01-01_01:17:29 | 98 |
| 2015-01-01_01:17:30 | 96 |
| 2015-01-01_01:17:31 | 95 |
| 2015-01-01_01:17:32 | 94 |
| 2015-01-01_01:17:33 | 94 |
| 2015-01-01_01:17:34 | 92 |
| 2015-01-01_01:17:35 | 91 |
| 2015-01-01_01:17:36 | 90 |
| 2015-01-01_01:17:37 | 90 |
| 2015-01-01_01:17:38 | 88 |
| 2015-01-01_01:17:39 | 86 |
| 2015-01-01_01:17:40 | 85 |
| 2015-01-01_01:17:41 | 82 |
| 2015-01-01_01:17:42 | 77 |
| 2015-01-01_01:17:43 | 73 |
| 2015-01-01_01:17:44 | 71 |
| 2015-01-01_01:17:45 | 70 |
| 2015-01-01_01:17:46 | 68 |
| 2015-01-01_01:17:47 | 68 |
| 2015-01-01_01:17:48 | 70 |
| 2015-01-01_01:17:49 | 72 |
| 2015-01-01_01:17:50 | 73 |
| 2015-01-01_01:17:51 | 74 |
| 2015-01-01_01:17:52 | 75 |
| 2015-01-01_01:17:53 | 77 |
| 2015-01-01_01:17:54 | 76 |
| 2015-01-01_01:17:55 | 74 |
| 2015-01-01_01:17:56 | 74 |
| 2015-01-01_01:17:57 | 73 |
| 2015-01-01_01:17:58 | 72 |
| 2015-01-01_01:17:59 | 70 |
| 2015-01-01_01:18:00 | 69 |
| 2015-01-01_01:18:01 | 68 |
| 2015-01-01_01:18:02 | 70 |
| 2015-01-01_01:18:03 | 74 |
| 2015-01-01_01:18:04 | 79 |
| 2015-01-01_01:18:05 | 85 |
| 2015-01-01_01:18:06 | 90 |
| 2015-01-01_01:18:07 | 94 |
| 2015-01-01_01:18:08 | 95 |
| 2015-01-01_01:18:09 | 94 |
| 2015-01-01_01:18:10 | 95 |
| 2015-01-01_01:18:11 | 97 |
| 2015-01-01_01:18:12 | 96 |
| 2015-01-01_01:18:13 | 95 |
| 2015-01-01_01:18:14 | 95 |
| 2015-01-01_01:18:15 | 95 |
| 2015-01-01_01:18:16 | 93 |
| 2015-01-01_01:18:17 | 93 |
| 2015-01-01_01:18:18 | 92 |
| 2015-01-01_01:18:19 | 90 |
| 2015-01-01_01:18:20 | 88 |
| 2015-01-01_01:18:21 | 87 |
| 2015-01-01_01:18:22 | 85 |
| 2015-01-01_01:18:23 | 83 |
| 2015-01-01_01:18:24 | 82 |
| 2015-01-01_01:18:25 | 80 |
| 2015-01-01_01:18:26 | 79 |
| 2015-01-01_01:18:27 | 77 |
| 2015-01-01_01:18:28 | 77 |
| 2015-01-01_01:18:29 | 78 |
| 2015-01-01_01:18:30 | 77 |
| 2015-01-01_01:18:31 | 77 |
| 2015-01-01_01:18:32 | 77 |
| 2015-01-01_01:18:33 | 77 |
| 2015-01-01_01:18:34 | 76 |
| 2015-01-01_01:18:35 | 76 |
| 2015-01-01_01:18:36 | 77 |
| 2015-01-01_01:18:37 | 77 |
| 2015-01-01_01:18:38 | 77 |
| 2015-01-01_01:18:39 | 77 |
| 2015-01-01_01:18:40 | 77 |
| 2015-01-01_01:18:41 | 78 |
| 2015-01-01_01:18:42 | 78 |
| 2015-01-01_01:18:43 | 78 |
| 2015-01-01_01:18:44 | 78 |
| 2015-01-01_01:18:45 | 77 |
| 2015-01-01_01:18:46 | 76 |
| 2015-01-01_01:18:47 | 76 |
| 2015-01-01_01:18:48 | 77 |
| 2015-01-01_01:18:49 | 76 |
| 2015-01-01_01:18:50 | 76 |
| 2015-01-01_01:18:51 | 75 |
| 2015-01-01_01:18:52 | 74 |
| 2015-01-01_01:18:53 | 74 |
| 2015-01-01_01:18:54 | 76 |
| 2015-01-01_01:18:55 | 75 |
| 2015-01-01_01:18:56 | 76 |
| 2015-01-01_01:18:57 | 74 |
| 2015-01-01_01:18:58 | 75 |
| 2015-01-01_01:18:59 | 75 |
| 2015-01-01_01:19:00 | 74 |
| 2015-01-01_01:19:01 | 74 |
| 2015-01-01_01:19:02 | 72 |
| 2015-01-01_01:19:03 | 72 |
| 2015-01-01_01:19:04 | 71 |
| 2015-01-01_01:19:05 | 72 |
| 2015-01-01_01:19:06 | 72 |
| 2015-01-01_01:19:07 | 73 |
| 2015-01-01_01:19:08 | 74 |
| 2015-01-01_01:19:09 | 74 |
| 2015-01-01_01:19:10 | 74 |
| 2015-01-01_01:19:11 | 73 |
| 2015-01-01_01:19:12 | 72 |
| 2015-01-01_01:19:13 | 72 |
| 2015-01-01_01:19:14 | 73 |
| 2015-01-01_01:19:15 | 75 |
| 2015-01-01_01:19:16 | 73 |
| 2015-01-01_01:19:17 | 74 |
| 2015-01-01_01:19:18 | 75 |
| 2015-01-01_01:19:19 | 79 |
| 2015-01-01_01:19:20 | 81 |
| 2015-01-01_01:19:21 | 82 |
| 2015-01-01_01:19:22 | 81 |
| 2015-01-01_01:19:23 | 83 |
| 2015-01-01_01:19:24 | 82 |
| 2015-01-01_01:19:25 | 82 |
| 2015-01-01_01:19:26 | 85 |
| 2015-01-01_01:19:27 | 88 |
| 2015-01-01_01:19:28 | 94 |
| 2015-01-01_01:19:29 | 100 |
| 2015-01-01_01:19:30 | 107 |
| 2015-01-01_01:19:31 | 110 |
| 2015-01-01_01:19:32 | 112 |
| 2015-01-01_01:19:33 | 112 |
| 2015-01-01_01:19:34 | 111 |
| 2015-01-01_01:19:35 | 109 |
| 2015-01-01_01:19:36 | 108 |
| 2015-01-01_01:19:37 | 105 |
| 2015-01-01_01:19:38 | 104 |
| 2015-01-01_01:19:39 | 102 |
| 2015-01-01_01:19:40 | 102 |
| 2015-01-01_01:19:41 | 102 |
| 2015-01-01_01:19:42 | 105 |
| 2015-01-01_01:19:43 | 105 |
| 2015-01-01_01:19:44 | 107 |
| 2015-01-01_01:19:45 | 104 |
| 2015-01-01_01:19:46 | 104 |
| 2015-01-01_01:19:47 | 102 |
| 2015-01-01_01:19:48 | 102 |
| 2015-01-01_01:19:49 | 104 |
| 2015-01-01_01:19:50 | 104 |
| 2015-01-01_01:19:51 | 104 |
| 2015-01-01_01:19:52 | 100 |
| 2015-01-01_01:19:53 | 97 |
| 2015-01-01_01:19:54 | 98 |
| 2015-01-01_01:19:55 | 99 |
| 2015-01-01_01:19:56 | 100 |
| 2015-01-01_01:19:57 | 101 |
| 2015-01-01_01:19:58 | 102 |
| 2015-01-01_01:19:59 | 104 |
| 2015-01-01_01:20:00 | 105 |
| 2015-01-01_01:20:01 | 108 |
| 2015-01-01_01:20:02 | 110 |
| 2015-01-01_01:20:03 | 110 |
| 2015-01-01_01:20:04 | 111 |
| 2015-01-01_01:20:05 | 110 |
| 2015-01-01_01:20:06 | 112 |
| 2015-01-01_01:20:07 | 113 |
| 2015-01-01_01:20:08 | 113 |
| 2015-01-01_01:20:09 | 112 |
| 2015-01-01_01:20:10 | 111 |
| 2015-01-01_01:20:11 | 110 |
| 2015-01-01_01:20:12 | 108 |
| 2015-01-01_01:20:13 | 108 |
| 2015-01-01_01:20:14 | 107 |
| 2015-01-01_01:20:15 | 106 |
| 2015-01-01_01:20:16 | 107 |
| 2015-01-01_01:20:17 | 108 |
| 2015-01-01_01:20:18 | 107 |
| 2015-01-01_01:20:19 | 107 |
| 2015-01-01_01:20:20 | 105 |
| 2015-01-01_01:20:21 | 105 |
| 2015-01-01_01:20:22 | 105 |
| 2015-01-01_01:20:23 | 106 |
| 2015-01-01_01:20:24 | 106 |
| 2015-01-01_01:20:25 | 106 |
| 2015-01-01_01:20:26 | 106 |
| 2015-01-01_01:20:27 | 105 |
| 2015-01-01_01:20:28 | 105 |
| 2015-01-01_01:20:29 | 102 |
| 2015-01-01_01:20:30 | 100 |
| 2015-01-01_01:20:31 | 98 |
| 2015-01-01_01:20:32 | 98 |
| 2015-01-01_01:20:33 | 96 |
| 2015-01-01_01:20:34 | 96 |
| 2015-01-01_01:20:35 | 95 |
| 2015-01-01_01:20:36 | 97 |
| 2015-01-01_01:20:37 | 97 |
| 2015-01-01_01:20:38 | 97 |
| 2015-01-01_01:20:39 | 96 |
| 2015-01-01_01:20:40 | 93 |
| 2015-01-01_01:20:41 | 93 |
| 2015-01-01_01:20:42 | 90 |
| 2015-01-01_01:20:43 | 88 |
| 2015-01-01_01:20:44 | 88 |
| 2015-01-01_01:20:45 | 86 |
| 2015-01-01_01:20:46 | 84 |
| 2015-01-01_01:20:47 | 82 |
| 2015-01-01_01:20:48 | 81 |
| 2015-01-01_01:20:49 | 80 |
| 2015-01-01_01:20:50 | 78 |
| 2015-01-01_01:20:51 | 77 |
| 2015-01-01_01:20:52 | 78 |
| 2015-01-01_01:20:53 | 77 |
| 2015-01-01_01:20:54 | 78 |
| 2015-01-01_01:20:55 | 77 |
| 2015-01-01_01:20:56 | 78 |
| 2015-01-01_01:20:57 | 78 |
| 2015-01-01_01:20:58 | 78 |
| 2015-01-01_01:20:59 | 76 |
| 2015-01-01_01:21:00 | 75 |
| 2015-01-01_01:21:01 | 76 |
| 2015-01-01_01:21:02 | 74 |
| 2015-01-01_01:21:03 | 72 |
| 2015-01-01_01:21:04 | 70 |
| 2015-01-01_01:21:05 | 69 |
| 2015-01-01_01:21:06 | 67 |
| 2015-01-01_01:21:07 | 68 |
| 2015-01-01_01:21:08 | 68 |
| 2015-01-01_01:21:09 | 68 |
| 2015-01-01_01:21:10 | 66 |
| 2015-01-01_01:21:11 | 67 |
| 2015-01-01_01:21:12 | 67 |
| 2015-01-01_01:21:13 | 66 |
| 2015-01-01_01:21:14 | 66 |
| 2015-01-01_01:21:15 | 69 |
| 2015-01-01_01:21:16 | 70 |
| 2015-01-01_01:21:17 | 69 |
| 2015-01-01_01:21:18 | 69 |
| 2015-01-01_01:21:19 | 69 |
| 2015-01-01_01:21:20 | 70 |
| 2015-01-01_01:21:21 | 69 |
| 2015-01-01_01:21:22 | 69 |
| 2015-01-01_01:21:23 | 68 |
| 2015-01-01_01:21:24 | 68 |
| 2015-01-01_01:21:25 | 68 |
| 2015-01-01_01:21:26 | 68 |
| 2015-01-01_01:21:27 | 68 |
| 2015-01-01_01:21:28 | 67 |
| 2015-01-01_01:21:29 | 69 |
| 2015-01-01_01:21:30 | 68 |
| 2015-01-01_01:21:31 | 69 |
| 2015-01-01_01:21:32 | 70 |
| 2015-01-01_01:21:33 | 70 |
| 2015-01-01_01:21:34 | 72 |
| 2015-01-01_01:21:35 | 74 |
| 2015-01-01_01:21:36 | 76 |
| 2015-01-01_01:21:37 | 76 |
| 2015-01-01_01:21:38 | 78 |
| 2015-01-01_01:21:39 | 79 |
| 2015-01-01_01:21:40 | 80 |
| 2015-01-01_01:21:41 | 82 |
| 2015-01-01_01:21:42 | 83 |
| 2015-01-01_01:21:43 | 84 |
| 2015-01-01_01:21:44 | 83 |
| 2015-01-01_01:21:45 | 83 |
| 2015-01-01_01:21:46 | 83 |
| 2015-01-01_01:21:47 | 81 |
| 2015-01-01_01:21:48 | 82 |
| 2015-01-01_01:21:49 | 81 |
| 2015-01-01_01:21:50 | 81 |
| 2015-01-01_01:21:51 | 82 |
| 2015-01-01_01:21:52 | 83 |
| 2015-01-01_01:21:53 | 85 |
| 2015-01-01_01:21:54 | 87 |
| 2015-01-01_01:21:55 | 86 |
| 2015-01-01_01:21:56 | 87 |
| 2015-01-01_01:21:57 | 87 |
| 2015-01-01_01:21:58 | 89 |
| 2015-01-01_01:21:59 | 90 |
| 2015-01-01_01:22:00 | 91 |
| 2015-01-01_01:22:01 | 90 |
| 2015-01-01_01:22:02 | 89 |
| 2015-01-01_01:22:03 | 88 |
| 2015-01-01_01:22:04 | 86 |
| 2015-01-01_01:22:05 | 85 |
| 2015-01-01_01:22:06 | 83 |
| 2015-01-01_01:22:07 | 81 |
| 2015-01-01_01:22:08 | 81 |
| 2015-01-01_01:22:09 | 80 |
| 2015-01-01_01:22:10 | 83 |
| 2015-01-01_01:22:11 | 84 |
| 2015-01-01_01:22:12 | 87 |
| 2015-01-01_01:22:13 | 87 |
| 2015-01-01_01:22:14 | 89 |
| 2015-01-01_01:22:15 | 89 |
| 2015-01-01_01:22:16 | 89 |
| 2015-01-01_01:22:17 | 88 |
| 2015-01-01_01:22:18 | 86 |
| 2015-01-01_01:22:19 | 85 |
| 2015-01-01_01:22:20 | 83 |
| 2015-01-01_01:22:21 | 82 |
| 2015-01-01_01:22:22 | 80 |
| 2015-01-01_01:22:23 | 79 |
| 2015-01-01_01:22:24 | 78 |
| 2015-01-01_01:22:25 | 75 |
| 2015-01-01_01:22:26 | 75 |
| 2015-01-01_01:22:27 | 75 |
| 2015-01-01_01:22:28 | 74 |
| 2015-01-01_01:22:29 | 76 |
| 2015-01-01_01:22:30 | 77 |
| 2015-01-01_01:22:31 | 77 |
| 2015-01-01_01:22:32 | 77 |
| 2015-01-01_01:22:33 | 77 |
| 2015-01-01_01:22:34 | 79 |
| 2015-01-01_01:22:35 | 78 |
| 2015-01-01_01:22:36 | 79 |
| 2015-01-01_01:22:37 | 79 |
| 2015-01-01_01:22:38 | 78 |
| 2015-01-01_01:22:39 | 79 |
| 2015-01-01_01:22:40 | 79 |
| 2015-01-01_01:22:41 | 78 |
| 2015-01-01_01:22:42 | 77 |
| 2015-01-01_01:22:43 | 76 |
| 2015-01-01_01:22:44 | 76 |
| 2015-01-01_01:22:45 | 76 |
| 2015-01-01_01:22:46 | 75 |
| 2015-01-01_01:22:47 | 76 |
| 2015-01-01_01:22:48 | 76 |
| 2015-01-01_01:22:49 | 75 |
| 2015-01-01_01:22:50 | 74 |
| 2015-01-01_01:22:51 | 72 |
| 2015-01-01_01:22:52 | 72 |
| 2015-01-01_01:22:53 | 70 |
| 2015-01-01_01:22:54 | 68 |
| 2015-01-01_01:22:55 | 67 |
| 2015-01-01_01:22:56 | 65 |
| 2015-01-01_01:22:57 | 65 |
| 2015-01-01_01:22:58 | 64 |
| 2015-01-01_01:22:59 | 66 |
| 2015-01-01_01:23:00 | 67 |
| 2015-01-01_01:23:01 | 69 |
| 2015-01-01_01:23:02 | 72 |
| 2015-01-01_01:23:03 | 72 |
| 2015-01-01_01:23:04 | 72 |
| 2015-01-01_01:23:05 | 74 |
| 2015-01-01_01:23:06 | 75 |
| 2015-01-01_01:23:07 | 76 |
| 2015-01-01_01:23:08 | 76 |
| 2015-01-01_01:23:09 | 76 |
| 2015-01-01_01:23:10 | 77 |
| 2015-01-01_01:23:11 | 79 |
| 2015-01-01_01:23:12 | 80 |
| 2015-01-01_01:23:13 | 82 |
| 2015-01-01_01:23:14 | 83 |
| 2015-01-01_01:23:15 | 85 |
| 2015-01-01_01:23:16 | 84 |
| 2015-01-01_01:23:17 | 84 |
| 2015-01-01_01:23:18 | 85 |
| 2015-01-01_01:23:19 | 84 |
| 2015-01-01_01:23:20 | 84 |
| 2015-01-01_01:23:21 | 85 |
| 2015-01-01_01:23:22 | 87 |
| 2015-01-01_01:23:23 | 88 |
| 2015-01-01_01:23:24 | 88 |
| 2015-01-01_01:23:25 | 86 |
| 2015-01-01_01:23:26 | 87 |
| 2015-01-01_01:23:27 | 86 |
| 2015-01-01_01:23:28 | 88 |
| 2015-01-01_01:23:29 | 88 |
| 2015-01-01_01:23:30 | 88 |
| 2015-01-01_01:23:31 | 89 |
| 2015-01-01_01:23:32 | 89 |
| 2015-01-01_01:23:33 | 87 |
| 2015-01-01_01:23:34 | 87 |
| 2015-01-01_01:23:35 | 87 |
| 2015-01-01_01:23:36 | 86 |
| 2015-01-01_01:23:37 | 86 |
| 2015-01-01_01:23:38 | 87 |
| 2015-01-01_01:23:39 | 87 |
| 2015-01-01_01:23:40 | 87 |
| 2015-01-01_01:23:41 | 87 |
| 2015-01-01_01:23:42 | 88 |
| 2015-01-01_01:23:43 | 87 |
| 2015-01-01_01:23:44 | 88 |
| 2015-01-01_01:23:45 | 87 |
| 2015-01-01_01:23:46 | 86 |
| 2015-01-01_01:23:47 | 85 |
| 2015-01-01_01:23:48 | 85 |
| 2015-01-01_01:23:49 | 84 |
| 2015-01-01_01:23:50 | 84 |
| 2015-01-01_01:23:51 | 82 |
| 2015-01-01_01:23:52 | 81 |
| 2015-01-01_01:23:53 | 79 |
| 2015-01-01_01:23:54 | 78 |
| 2015-01-01_01:23:55 | 74 |
| 2015-01-01_01:23:56 | 74 |
| 2015-01-01_01:23:57 | 72 |
| 2015-01-01_01:23:58 | 71 |
| 2015-01-01_01:23:59 | 71 |
| 2015-01-01_01:24:00 | 72 |
| 2015-01-01_01:24:01 | 71 |
| 2015-01-01_01:24:02 | 72 |
| 2015-01-01_01:24:03 | 72 |
| 2015-01-01_01:24:04 | 71 |
| 2015-01-01_01:24:05 | 72 |
| 2015-01-01_01:24:06 | 72 |
| 2015-01-01_01:24:07 | 72 |
| 2015-01-01_01:24:08 | 70 |
| 2015-01-01_01:24:09 | 70 |
| 2015-01-01_01:24:10 | 69 |
| 2015-01-01_01:24:11 | 68 |
| 2015-01-01_01:24:12 | 64 |
| 2015-01-01_01:24:13 | 64 |
| 2015-01-01_01:24:14 | 62 |
| 2015-01-01_01:24:15 | 62 |
| 2015-01-01_01:24:16 | 60 |
| 2015-01-01_01:24:17 | 59 |
| 2015-01-01_01:24:18 | 58 |
| 2015-01-01_01:24:19 | 57 |
| 2015-01-01_01:24:20 | 56 |
| 2015-01-01_01:24:21 | 56 |
| 2015-01-01_01:24:22 | 55 |
| 2015-01-01_01:24:23 | 54 |
| 2015-01-01_01:24:24 | 52 |
| 2015-01-01_01:24:25 | 49 |
| 2015-01-01_01:24:26 | 47 |
| 2015-01-01_01:24:27 | 47 |
| 2015-01-01_01:24:28 | 43 |
| 2015-01-01_01:24:29 | 39 |
| 2015-01-01_01:24:30 | 38 |
| 2015-01-01_01:24:31 | 36 |
| 2015-01-01_01:24:32 | 33 |
| 2015-01-01_01:24:33 | 29 |
| 2015-01-01_01:24:34 | 25 |
| 2015-01-01_01:24:35 | 21 |
| 2015-01-01_01:24:36 | 21 |
| 2015-01-01_01:24:37 | 19 |
| 2015-01-01_01:24:38 | 17 |
| 2015-01-01_01:24:39 | 13 |
| 2015-01-01_01:24:40 | 8 |
| 2015-01-01_01:24:41 | 5 |
| 2015-01-01_01:24:42 | 5 |
| 2015-01-01_01:24:43 | 5 |
| 2015-01-01_01:24:44 | 10 |
| 2015-01-01_01:24:45 | 18 |
| 2015-01-01_01:24:46 | 19 |
| 2015-01-01_01:24:47 | 25 |
| 2015-01-01_01:24:48 | 29 |
| 2015-01-01_01:24:49 | 30 |
| 2015-01-01_01:24:50 | 31 |
| 2015-01-01_01:24:51 | 31 |
| 2015-01-01_01:24:52 | 31 |
| 2015-01-01_01:24:53 | 32 |
| 2015-01-01_01:24:54 | 37 |
| 2015-01-01_01:24:55 | 39 |
| 2015-01-01_01:24:56 | 44 |
| 2015-01-01_01:24:57 | 52 |
| 2015-01-01_01:24:58 | 57 |
| 2015-01-01_01:24:59 | 57 |
| 2015-01-01_01:25:00 | 57 |
| 2015-01-01_01:25:01 | 58 |
| 2015-01-01_01:25:02 | 63 |
| 2015-01-01_01:25:03 | 63 |
| 2015-01-01_01:25:04 | 63 |
| 2015-01-01_01:25:05 | 60 |
| 2015-01-01_01:25:06 | 60 |
| 2015-01-01_01:25:07 | 60 |
| 2015-01-01_01:25:08 | 60 |
| 2015-01-01_01:25:09 | 61 |
| 2015-01-01_01:25:10 | 61 |
| 2015-01-01_01:25:11 | 61 |
| 2015-01-01_01:25:12 | 60 |
| 2015-01-01_01:25:13 | 60 |
| 2015-01-01_01:25:14 | 61 |
| 2015-01-01_01:25:15 | 61 |
| 2015-01-01_01:25:16 | 62 |
| 2015-01-01_01:25:17 | 63 |
| 2015-01-01_01:25:18 | 65 |
| 2015-01-01_01:25:19 | 65 |
| 2015-01-01_01:25:20 | 65 |
| 2015-01-01_01:25:21 | 66 |
| 2015-01-01_01:25:22 | 66 |
| 2015-01-01_01:25:23 | 66 |
| 2015-01-01_01:25:24 | 66 |
| 2015-01-01_01:25:25 | 65 |
| 2015-01-01_01:25:26 | 64 |
| 2015-01-01_01:25:27 | 64 |
| 2015-01-01_01:25:28 | 62 |
| 2015-01-01_01:25:29 | 62 |
| 2015-01-01_01:25:30 | 61 |
| 2015-01-01_01:25:31 | 58 |
| 2015-01-01_01:25:32 | 58 |
| 2015-01-01_01:25:33 | 57 |
| 2015-01-01_01:25:34 | 55 |
| 2015-01-01_01:25:35 | 54 |
| 2015-01-01_01:25:36 | 53 |
| 2015-01-01_01:25:37 | 56 |
| 2015-01-01_01:25:38 | 56 |
| 2015-01-01_01:25:39 | 56 |
| 2015-01-01_01:25:40 | 55 |
| 2015-01-01_01:25:41 | 55 |
| 2015-01-01_01:25:42 | 56 |
| 2015-01-01_01:25:43 | 57 |
| 2015-01-01_01:25:44 | 62 |
| 2015-01-01_01:25:45 | 66 |
| 2015-01-01_01:25:46 | 68 |
| 2015-01-01_01:25:47 | 68 |
| 2015-01-01_01:25:48 | 69 |
| 2015-01-01_01:25:49 | 70 |
| 2015-01-01_01:25:50 | 70 |
| 2015-01-01_01:25:51 | 69 |
| 2015-01-01_01:25:52 | 69 |
| 2015-01-01_01:25:53 | 70 |
| 2015-01-01_01:25:54 | 71 |
| 2015-01-01_01:25:55 | 72 |
| 2015-01-01_01:25:56 | 71 |
| 2015-01-01_01:25:57 | 70 |
| 2015-01-01_01:25:58 | 70 |
| 2015-01-01_01:25:59 | 68 |
| 2015-01-01_01:26:00 | 67 |
| 2015-01-01_01:26:01 | 65 |
| 2015-01-01_01:26:02 | 65 |
| 2015-01-01_01:26:03 | 64 |
| 2015-01-01_01:26:04 | 63 |
| 2015-01-01_01:26:05 | 64 |
| 2015-01-01_01:26:06 | 64 |
| 2015-01-01_01:26:07 | 64 |
| 2015-01-01_01:26:08 | 63 |
| 2015-01-01_01:26:09 | 63 |
| 2015-01-01_01:26:10 | 63 |
| 2015-01-01_01:26:11 | 64 |
| 2015-01-01_01:26:12 | 64 |
| 2015-01-01_01:26:13 | 65 |
| 2015-01-01_01:26:14 | 64 |
| 2015-01-01_01:26:15 | 64 |
| 2015-01-01_01:26:16 | 63 |
| 2015-01-01_01:26:17 | 63 |
| 2015-01-01_01:26:18 | 64 |
| 2015-01-01_01:26:19 | 61 |
| 2015-01-01_01:26:20 | 60 |
| 2015-01-01_01:26:21 | 59 |
| 2015-01-01_01:26:22 | 59 |
| 2015-01-01_01:26:23 | 59 |
| 2015-01-01_01:26:24 | 61 |
| 2015-01-01_01:26:25 | 64 |
| 2015-01-01_01:26:26 | 66 |
| 2015-01-01_01:26:27 | 66 |
| 2015-01-01_01:26:28 | 66 |
| 2015-01-01_01:26:29 | 66 |
| 2015-01-01_01:26:30 | 66 |
| 2015-01-01_01:26:31 | 64 |
| 2015-01-01_01:26:32 | 63 |
| 2015-01-01_01:26:33 | 62 |
| 2015-01-01_01:26:34 | 62 |
| 2015-01-01_01:26:35 | 60 |
| 2015-01-01_01:26:36 | 61 |
| 2015-01-01_01:26:37 | 60 |
| 2015-01-01_01:26:38 | 63 |
| 2015-01-01_01:26:39 | 66 |
| 2015-01-01_01:26:40 | 68 |
| 2015-01-01_01:26:41 | 71 |
| 2015-01-01_01:26:42 | 72 |
| 2015-01-01_01:26:43 | 70 |
| 2015-01-01_01:26:44 | 70 |
| 2015-01-01_01:26:45 | 71 |
| 2015-01-01_01:26:46 | 69 |
| 2015-01-01_01:26:47 | 67 |
| 2015-01-01_01:26:48 | 66 |
| 2015-01-01_01:26:49 | 66 |
| 2015-01-01_01:26:50 | 66 |
| 2015-01-01_01:26:51 | 67 |
| 2015-01-01_01:26:52 | 67 |
| 2015-01-01_01:26:53 | 67 |
| 2015-01-01_01:26:54 | 68 |
| 2015-01-01_01:26:55 | 69 |
| 2015-01-01_01:26:56 | 68 |
| 2015-01-01_01:26:57 | 68 |
| 2015-01-01_01:26:58 | 69 |
| 2015-01-01_01:26:59 | 67 |
| 2015-01-01_01:27:00 | 65 |
| 2015-01-01_01:27:01 | 62 |
| 2015-01-01_01:27:02 | 60 |
| 2015-01-01_01:27:03 | 60 |
| 2015-01-01_01:27:04 | 60 |
| 2015-01-01_01:27:05 | 62 |
| 2015-01-01_01:27:06 | 63 |
| 2015-01-01_01:27:07 | 63 |
| 2015-01-01_01:27:08 | 62 |
| 2015-01-01_01:27:09 | 62 |
| 2015-01-01_01:27:10 | 62 |
| 2015-01-01_01:27:11 | 62 |
| 2015-01-01_01:27:12 | 61 |
| 2015-01-01_01:27:13 | 61 |
| 2015-01-01_01:27:14 | 59 |
| 2015-01-01_01:27:15 | 59 |
| 2015-01-01_01:27:16 | 58 |
| 2015-01-01_01:27:17 | 57 |
| 2015-01-01_01:27:18 | 56 |
| 2015-01-01_01:27:19 | 55 |
| 2015-01-01_01:27:20 | 54 |
| 2015-01-01_01:27:21 | 54 |
| 2015-01-01_01:27:22 | 53 |
| 2015-01-01_01:27:23 | 52 |
| 2015-01-01_01:27:24 | 52 |
| 2015-01-01_01:27:25 | 52 |
| 2015-01-01_01:27:26 | 51 |
| 2015-01-01_01:27:27 | 51 |
| 2015-01-01_01:27:28 | 52 |
| 2015-01-01_01:27:29 | 53 |
| 2015-01-01_01:27:30 | 56 |
| 2015-01-01_01:27:31 | 60 |
| 2015-01-01_01:27:32 | 65 |
| 2015-01-01_01:27:33 | 67 |
| 2015-01-01_01:27:34 | 66 |
| 2015-01-01_01:27:35 | 65 |
| 2015-01-01_01:27:36 | 65 |
| 2015-01-01_01:27:37 | 64 |
| 2015-01-01_01:27:38 | 64 |
| 2015-01-01_01:27:39 | 65 |
| 2015-01-01_01:27:40 | 66 |
| 2015-01-01_01:27:41 | 67 |
| 2015-01-01_01:27:42 | 69 |
| 2015-01-01_01:27:43 | 70 |
| 2015-01-01_01:27:44 | 71 |
| 2015-01-01_01:27:45 | 72 |
| 2015-01-01_01:27:46 | 73 |
| 2015-01-01_01:27:47 | 75 |
| 2015-01-01_01:27:48 | 74 |
| 2015-01-01_01:27:49 | 76 |
| 2015-01-01_01:27:50 | 76 |
| 2015-01-01_01:27:51 | 76 |
| 2015-01-01_01:27:52 | 78 |
| 2015-01-01_01:27:53 | 83 |
| 2015-01-01_01:27:54 | 87 |
| 2015-01-01_01:27:55 | 90 |
| 2015-01-01_01:27:56 | 95 |
| 2015-01-01_01:27:57 | 102 |
| 2015-01-01_01:27:58 | 108 |
| 2015-01-01_01:27:59 | 112 |
| 2015-01-01_01:28:00 | 116 |
| 2015-01-01_01:28:01 | 117 |
| 2015-01-01_01:28:02 | 117 |
| 2015-01-01_01:28:03 | 116 |
| 2015-01-01_01:28:04 | 115 |
| 2015-01-01_01:28:05 | 114 |
| 2015-01-01_01:28:06 | 112 |
| 2015-01-01_01:28:07 | 110 |
| 2015-01-01_01:28:08 | 108 |
| 2015-01-01_01:28:09 | 107 |
| 2015-01-01_01:28:10 | 104 |
| 2015-01-01_01:28:11 | 104 |
| 2015-01-01_01:28:12 | 102 |
| 2015-01-01_01:28:13 | 102 |
| 2015-01-01_01:28:14 | 102 |
| 2015-01-01_01:28:15 | 102 |
| 2015-01-01_01:28:16 | 101 |
| 2015-01-01_01:28:17 | 102 |
| 2015-01-01_01:28:18 | 101 |
| 2015-01-01_01:28:19 | 100 |
| 2015-01-01_01:28:20 | 99 |
| 2015-01-01_01:28:21 | 99 |
| 2015-01-01_01:28:22 | 99 |
| 2015-01-01_01:28:23 | 98 |
| 2015-01-01_01:28:24 | 98 |
| 2015-01-01_01:28:25 | 97 |
| 2015-01-01_01:28:26 | 97 |
| 2015-01-01_01:28:27 | 95 |
| 2015-01-01_01:28:28 | 96 |
| 2015-01-01_01:28:29 | 97 |
| 2015-01-01_01:28:30 | 94 |
| 2015-01-01_01:28:31 | 95 |
| 2015-01-01_01:28:32 | 98 |
| 2015-01-01_01:28:33 | 100 |
| 2015-01-01_01:28:34 | 98 |
| 2015-01-01_01:28:35 | 98 |
| 2015-01-01_01:28:36 | 97 |
| 2015-01-01_01:28:37 | 97 |
| 2015-01-01_01:28:38 | 96 |
| 2015-01-01_01:28:39 | 96 |
| 2015-01-01_01:28:40 | 95 |
| 2015-01-01_01:28:41 | 94 |
| 2015-01-01_01:28:42 | 94 |
| 2015-01-01_01:28:43 | 94 |
| 2015-01-01_01:28:44 | 92 |
| 2015-01-01_01:28:45 | 93 |
| 2015-01-01_01:28:46 | 92 |
| 2015-01-01_01:28:47 | 93 |
| 2015-01-01_01:28:48 | 91 |
| 2015-01-01_01:28:49 | 90 |
| 2015-01-01_01:28:50 | 89 |
| 2015-01-01_01:28:51 | 87 |
| 2015-01-01_01:28:52 | 88 |
| 2015-01-01_01:28:53 | 86 |
| 2015-01-01_01:28:54 | 87 |
| 2015-01-01_01:28:55 | 86 |
| 2015-01-01_01:28:56 | 85 |
| 2015-01-01_01:28:57 | 84 |
| 2015-01-01_01:28:58 | 82 |
| 2015-01-01_01:28:59 | 80 |
| 2015-01-01_01:29:00 | 79 |
| 2015-01-01_01:29:01 | 77 |
| 2015-01-01_01:29:02 | 76 |
| 2015-01-01_01:29:03 | 74 |
| 2015-01-01_01:29:04 | 72 |
| 2015-01-01_01:29:05 | 72 |
| 2015-01-01_01:29:06 | 70 |
| 2015-01-01_01:29:07 | 72 |
| 2015-01-01_01:29:08 | 71 |
| 2015-01-01_01:29:09 | 70 |
| 2015-01-01_01:29:10 | 70 |
| 2015-01-01_01:29:11 | 69 |
| 2015-01-01_01:29:12 | 69 |
| 2015-01-01_01:29:13 | 71 |
| 2015-01-01_01:29:14 | 72 |
| 2015-01-01_01:29:15 | 72 |
| 2015-01-01_01:29:16 | 72 |
| 2015-01-01_01:29:17 | 71 |
| 2015-01-01_01:29:18 | 70 |
| 2015-01-01_01:29:19 | 70 |
| 2015-01-01_01:29:20 | 71 |
| 2015-01-01_01:29:21 | 72 |
| 2015-01-01_01:29:22 | 71 |
| 2015-01-01_01:29:23 | 71 |
| 2015-01-01_01:29:24 | 71 |
| 2015-01-01_01:29:25 | 71 |
| 2015-01-01_01:29:26 | 72 |
| 2015-01-01_01:29:27 | 70 |
| 2015-01-01_01:29:28 | 70 |
| 2015-01-01_01:29:29 | 71 |
| 2015-01-01_01:29:30 | 70 |
| 2015-01-01_01:29:31 | 69 |
| 2015-01-01_01:29:32 | 69 |
| 2015-01-01_01:29:33 | 67 |
| 2015-01-01_01:29:34 | 67 |
| 2015-01-01_01:29:35 | 64 |
| 2015-01-01_01:29:36 | 64 |
| 2015-01-01_01:29:37 | 63 |
| 2015-01-01_01:29:38 | 62 |
| 2015-01-01_01:29:39 | 61 |
| 2015-01-01_01:29:40 | 61 |
| 2015-01-01_01:29:41 | 59 |
| 2015-01-01_01:29:42 | 56 |
| 2015-01-01_01:29:43 | 51 |
| 2015-01-01_01:29:44 | 48 |
| 2015-01-01_01:29:45 | 45 |
| 2015-01-01_01:29:46 | 44 |
| 2015-01-01_01:29:47 | 39 |
| 2015-01-01_01:29:48 | 34 |
| 2015-01-01_01:29:49 | 28 |
| 2015-01-01_01:29:50 | 23 |
| 2015-01-01_01:29:51 | 19 |
| 2015-01-01_01:29:52 | 17 |
| 2015-01-01_01:29:53 | 16 |
| 2015-01-01_01:29:54 | 17 |
| 2015-01-01_01:29:55 | 15 |
| 2015-01-01_01:29:56 | 16 |
| 2015-01-01_01:29:57 | 13 |
| 2015-01-01_01:29:58 | 8 |
| 2015-01-01_01:29:59 | 6 |
| 2015-01-01_01:30:00 | 3 |
| 2015-01-01_01:30:01 | 0 |
| 2015-01-01_01:30:02 | 0 |
| 2015-01-01_01:30:03 | 0 |
| 2015-01-01_01:30:04 | 0 |
| 2015-01-01_01:30:05 | 0 |
| 2015-01-01_01:30:06 | 0 |
| 2015-01-01_01:30:07 | 0 |
| 2015-01-01_01:30:08 | 6 |
| 2015-01-01_01:30:09 | 15 |
| 2015-01-01_01:30:10 | 22 |
| 2015-01-01_01:30:11 | 26 |
| 2015-01-01_01:30:12 | 35 |
| 2015-01-01_01:30:13 | 38 |
| 2015-01-01_01:30:14 | 40 |
| 2015-01-01_01:30:15 | 42 |
| 2015-01-01_01:30:16 | 46 |
| 2015-01-01_01:30:17 | 48 |
| 2015-01-01_01:30:18 | 48 |
| 2015-01-01_01:30:19 | 48 |
| 2015-01-01_01:30:20 | 48 |
| 2015-01-01_01:30:21 | 51 |
| 2015-01-01_01:30:22 | 53 |
| 2015-01-01_01:30:23 | 56 |
| 2015-01-01_01:30:24 | 56 |
| 2015-01-01_01:30:25 | 57 |
| 2015-01-01_01:30:26 | 60 |
| 2015-01-01_01:30:27 | 62 |
| 2015-01-01_01:30:28 | 63 |
| 2015-01-01_01:30:29 | 66 |
| 2015-01-01_01:30:30 | 66 |
| 2015-01-01_01:30:31 | 68 |
| 2015-01-01_01:30:32 | 68 |
| 2015-01-01_01:30:33 | 68 |
| 2015-01-01_01:30:34 | 68 |
| 2015-01-01_01:30:35 | 68 |
| 2015-01-01_01:30:36 | 66 |
| 2015-01-01_01:30:37 | 66 |
| 2015-01-01_01:30:38 | 66 |
| 2015-01-01_01:30:39 | 65 |
| 2015-01-01_01:30:40 | 63 |
| 2015-01-01_01:30:41 | 61 |
| 2015-01-01_01:30:42 | 59 |
| 2015-01-01_01:30:43 | 58 |
| 2015-01-01_01:30:44 | 57 |
| 2015-01-01_01:30:45 | 56 |
| 2015-01-01_01:30:46 | 58 |
| 2015-01-01_01:30:47 | 59 |
| 2015-01-01_01:30:48 | 59 |
| 2015-01-01_01:30:49 | 61 |
| 2015-01-01_01:30:50 | 62 |
| 2015-01-01_01:30:51 | 62 |
| 2015-01-01_01:30:52 | 61 |
| 2015-01-01_01:30:53 | 62 |
| 2015-01-01_01:30:54 | 60 |
| 2015-01-01_01:30:55 | 61 |
| 2015-01-01_01:30:56 | 64 |
| 2015-01-01_01:30:57 | 71 |
| 2015-01-01_01:30:58 | 79 |
| 2015-01-01_01:30:59 | 84 |
| 2015-01-01_01:31:00 | 84 |
| 2015-01-01_01:31:01 | 84 |
| 2015-01-01_01:31:02 | 85 |
| 2015-01-01_01:31:03 | 84 |
| 2015-01-01_01:31:04 | 82 |
| 2015-01-01_01:31:05 | 81 |
| 2015-01-01_01:31:06 | 82 |
| 2015-01-01_01:31:07 | 81 |
| 2015-01-01_01:31:08 | 81 |
| 2015-01-01_01:31:09 | 82 |
| 2015-01-01_01:31:10 | 81 |
| 2015-01-01_01:31:11 | 80 |
| 2015-01-01_01:31:12 | 79 |
| 2015-01-01_01:31:13 | 78 |
| 2015-01-01_01:31:14 | 80 |
| 2015-01-01_01:31:15 | 80 |
| 2015-01-01_01:31:16 | 80 |
| 2015-01-01_01:31:17 | 82 |
| 2015-01-01_01:31:18 | 83 |
| 2015-01-01_01:31:19 | 82 |
| 2015-01-01_01:31:20 | 81 |
| 2015-01-01_01:31:21 | 82 |
| 2015-01-01_01:31:22 | 82 |
| 2015-01-01_01:31:23 | 83 |
| 2015-01-01_01:31:24 | 82 |
| 2015-01-01_01:31:25 | 82 |
| 2015-01-01_01:31:26 | 79 |
| 2015-01-01_01:31:27 | 77 |
| 2015-01-01_01:31:28 | 73 |
| 2015-01-01_01:31:29 | 70 |
| 2015-01-01_01:31:30 | 63 |
| 2015-01-01_01:31:31 | 61 |
| 2015-01-01_01:31:32 | 59 |
| 2015-01-01_01:31:33 | 57 |
| 2015-01-01_01:31:34 | 53 |
| 2015-01-01_01:31:35 | 50 |
| 2015-01-01_01:31:36 | 41 |
| 2015-01-01_01:31:37 | 33 |
| 2015-01-01_01:31:38 | 23 |
| 2015-01-01_01:31:39 | 14 |
| 2015-01-01_01:31:40 | 7 |
| 2015-01-01_01:31:41 | 4 |
| 2015-01-01_01:31:42 | 2 |
| 2015-01-01_01:31:43 | 3 |
| 2015-01-01_01:31:44 | 1 |
| 2015-01-01_01:31:45 | 2 |
| 2015-01-01_01:31:46 | 4 |
| 2015-01-01_01:31:47 | 11 |
| 2015-01-01_01:31:48 | 21 |
| 2015-01-01_01:31:49 | 22 |
| 2015-01-01_01:31:50 | 27 |
| 2015-01-01_01:31:51 | 35 |
| 2015-01-01_01:31:52 | 39 |
| 2015-01-01_01:31:53 | 41 |
| 2015-01-01_01:31:54 | 46 |
| 2015-01-01_01:31:55 | 49 |
| 2015-01-01_01:31:56 | 53 |
| 2015-01-01_01:31:57 | 58 |
| 2015-01-01_01:31:58 | 64 |
| 2015-01-01_01:31:59 | 68 |
| 2015-01-01_01:32:00 | 67 |
| 2015-01-01_01:32:01 | 65 |
| 2015-01-01_01:32:02 | 64 |
| 2015-01-01_01:32:03 | 63 |
| 2015-01-01_01:32:04 | 63 |
| 2015-01-01_01:32:05 | 65 |
| 2015-01-01_01:32:06 | 68 |
| 2015-01-01_01:32:07 | 71 |
| 2015-01-01_01:32:08 | 75 |
| 2015-01-01_01:32:09 | 80 |
| 2015-01-01_01:32:10 | 78 |
| 2015-01-01_01:32:11 | 79 |
| 2015-01-01_01:32:12 | 79 |
| 2015-01-01_01:32:13 | 79 |
| 2015-01-01_01:32:14 | 79 |
| 2015-01-01_01:32:15 | 80 |
| 2015-01-01_01:32:16 | 80 |
| 2015-01-01_01:32:17 | 80 |
| 2015-01-01_01:32:18 | 80 |
| 2015-01-01_01:32:19 | 80 |
| 2015-01-01_01:32:20 | 81 |
| 2015-01-01_01:32:21 | 83 |
| 2015-01-01_01:32:22 | 82 |
| 2015-01-01_01:32:23 | 82 |
| 2015-01-01_01:32:24 | 81 |
| 2015-01-01_01:32:25 | 82 |
| 2015-01-01_01:32:26 | 81 |
| 2015-01-01_01:32:27 | 81 |
| 2015-01-01_01:32:28 | 82 |
| 2015-01-01_01:32:29 | 82 |
| 2015-01-01_01:32:30 | 81 |
| 2015-01-01_01:32:31 | 81 |
| 2015-01-01_01:32:32 | 80 |
| 2015-01-01_01:32:33 | 81 |
| 2015-01-01_01:32:34 | 80 |
| 2015-01-01_01:32:35 | 82 |
| 2015-01-01_01:32:36 | 80 |
| 2015-01-01_01:32:37 | 80 |
| 2015-01-01_01:32:38 | 79 |
| 2015-01-01_01:32:39 | 79 |
| 2015-01-01_01:32:40 | 78 |
| 2015-01-01_01:32:41 | 79 |
| 2015-01-01_01:32:42 | 78 |
| 2015-01-01_01:32:43 | 79 |
| 2015-01-01_01:32:44 | 78 |
| 2015-01-01_01:32:45 | 78 |
| 2015-01-01_01:32:46 | 78 |
| 2015-01-01_01:32:47 | 78 |
| 2015-01-01_01:32:48 | 78 |
| 2015-01-01_01:32:49 | 79 |
| 2015-01-01_01:32:50 | 78 |
| 2015-01-01_01:32:51 | 78 |
| 2015-01-01_01:32:52 | 79 |
| 2015-01-01_01:32:53 | 79 |
| 2015-01-01_01:32:54 | 79 |
| 2015-01-01_01:32:55 | 79 |
| 2015-01-01_01:32:56 | 79 |
| 2015-01-01_01:32:57 | 79 |
| 2015-01-01_01:32:58 | 80 |
| 2015-01-01_01:32:59 | 80 |
| 2015-01-01_01:33:00 | 82 |
| 2015-01-01_01:33:01 | 84 |
| 2015-01-01_01:33:02 | 85 |
| 2015-01-01_01:33:03 | 88 |
| 2015-01-01_01:33:04 | 89 |
| 2015-01-01_01:33:05 | 90 |
| 2015-01-01_01:33:06 | 91 |
| 2015-01-01_01:33:07 | 91 |
| 2015-01-01_01:33:08 | 91 |
| 2015-01-01_01:33:09 | 90 |
| 2015-01-01_01:33:10 | 91 |
| 2015-01-01_01:33:11 | 92 |
| 2015-01-01_01:33:12 | 96 |
| 2015-01-01_01:33:13 | 99 |
| 2015-01-01_01:33:14 | 102 |
| 2015-01-01_01:33:15 | 104 |
| 2015-01-01_01:33:16 | 102 |
| 2015-01-01_01:33:17 | 102 |
| 2015-01-01_01:33:18 | 105 |
| 2015-01-01_01:33:19 | 106 |
| 2015-01-01_01:33:20 | 109 |
| 2015-01-01_01:33:21 | 110 |
| 2015-01-01_01:33:22 | 111 |
| 2015-01-01_01:33:23 | 113 |
| 2015-01-01_01:33:24 | 113 |
| 2015-01-01_01:33:25 | 114 |
| 2015-01-01_01:33:26 | 115 |
| 2015-01-01_01:33:27 | 116 |
| 2015-01-01_01:33:28 | 116 |
| 2015-01-01_01:33:29 | 117 |
| 2015-01-01_01:33:30 | 117 |
| 2015-01-01_01:33:31 | 118 |
| 2015-01-01_01:33:32 | 119 |
| 2015-01-01_01:33:33 | 118 |
| 2015-01-01_01:33:34 | 120 |
| 2015-01-01_01:33:35 | 119 |
| 2015-01-01_01:33:36 | 120 |
| 2015-01-01_01:33:37 | 119 |
| 2015-01-01_01:33:38 | 120 |
| 2015-01-01_01:33:39 | 119 |
| 2015-01-01_01:33:40 | 120 |
| 2015-01-01_01:33:41 | 121 |
| 2015-01-01_01:33:42 | 120 |
| 2015-01-01_01:33:43 | 120 |
| 2015-01-01_01:33:44 | 120 |
| 2015-01-01_01:33:45 | 120 |
| 2015-01-01_01:33:46 | 119 |
| 2015-01-01_01:33:47 | 118 |
| 2015-01-01_01:33:48 | 118 |
| 2015-01-01_01:33:49 | 116 |
| 2015-01-01_01:33:50 | 117 |
| 2015-01-01_01:33:51 | 115 |
| 2015-01-01_01:33:52 | 113 |
| 2015-01-01_01:33:53 | 112 |
| 2015-01-01_01:33:54 | 111 |
| 2015-01-01_01:33:55 | 111 |
| 2015-01-01_01:33:56 | 109 |
| 2015-01-01_01:33:57 | 109 |
| 2015-01-01_01:33:58 | 109 |
| 2015-01-01_01:33:59 | 109 |
| 2015-01-01_01:34:00 | 109 |
| 2015-01-01_01:34:01 | 111 |
| 2015-01-01_01:34:02 | 114 |
| 2015-01-01_01:34:03 | 116 |
| 2015-01-01_01:34:04 | 116 |
| 2015-01-01_01:34:05 | 116 |
| 2015-01-01_01:34:06 | 116 |
| 2015-01-01_01:34:07 | 115 |
| 2015-01-01_01:34:08 | 115 |
| 2015-01-01_01:34:09 | 114 |
| 2015-01-01_01:34:10 | 113 |
| 2015-01-01_01:34:11 | 111 |
| 2015-01-01_01:34:12 | 109 |
| 2015-01-01_01:34:13 | 111 |
| 2015-01-01_01:34:14 | 112 |
| 2015-01-01_01:34:15 | 113 |
| 2015-01-01_01:34:16 | 113 |
| 2015-01-01_01:34:17 | 111 |
| 2015-01-01_01:34:18 | 109 |
| 2015-01-01_01:34:19 | 108 |
| 2015-01-01_01:34:20 | 108 |
| 2015-01-01_01:34:21 | 107 |
| 2015-01-01_01:34:22 | 109 |
| 2015-01-01_01:34:23 | 109 |
| 2015-01-01_01:34:24 | 108 |
| 2015-01-01_01:34:25 | 107 |
| 2015-01-01_01:34:26 | 100 |
| 2015-01-01_01:34:27 | 92 |
| 2015-01-01_01:34:28 | 84 |
| 2015-01-01_01:34:29 | 82 |
| 2015-01-01_01:34:30 | 82 |
| 2015-01-01_01:34:31 | 82 |
| 2015-01-01_01:34:32 | 85 |
| 2015-01-01_01:34:33 | 87 |
| 2015-01-01_01:34:34 | 89 |
| 2015-01-01_01:34:35 | 92 |
| 2015-01-01_01:34:36 | 96 |
| 2015-01-01_01:34:37 | 101 |
| 2015-01-01_01:34:38 | 105 |
| 2015-01-01_01:34:39 | 109 |
| 2015-01-01_01:34:40 | 111 |
| 2015-01-01_01:34:41 | 111 |
| 2015-01-01_01:34:42 | 113 |
| 2015-01-01_01:34:43 | 112 |
| 2015-01-01_01:34:44 | 112 |
| 2015-01-01_01:34:45 | 112 |
| 2015-01-01_01:34:46 | 111 |
| 2015-01-01_01:34:47 | 110 |
| 2015-01-01_01:34:48 | 111 |
| 2015-01-01_01:34:49 | 111 |
| 2015-01-01_01:34:50 | 112 |
| 2015-01-01_01:34:51 | 111 |
| 2015-01-01_01:34:52 | 110 |
| 2015-01-01_01:34:53 | 109 |
| 2015-01-01_01:34:54 | 109 |
| 2015-01-01_01:34:55 | 109 |
| 2015-01-01_01:34:56 | 109 |
| 2015-01-01_01:34:57 | 109 |
| 2015-01-01_01:34:58 | 110 |
| 2015-01-01_01:34:59 | 109 |
| 2015-01-01_01:35:00 | 110 |
| 2015-01-01_01:35:01 | 111 |
| 2015-01-01_01:35:02 | 111 |
| 2015-01-01_01:35:03 | 111 |
| 2015-01-01_01:35:04 | 112 |
| 2015-01-01_01:35:05 | 111 |
| 2015-01-01_01:35:06 | 112 |
| 2015-01-01_01:35:07 | 112 |
| 2015-01-01_01:35:08 | 111 |
| 2015-01-01_01:35:09 | 113 |
| 2015-01-01_01:35:10 | 112 |
| 2015-01-01_01:35:11 | 113 |
| 2015-01-01_01:35:12 | 115 |
| 2015-01-01_01:35:13 | 115 |
| 2015-01-01_01:35:14 | 114 |
| 2015-01-01_01:35:15 | 115 |
| 2015-01-01_01:35:16 | 115 |
| 2015-01-01_01:35:17 | 116 |
| 2015-01-01_01:35:18 | 115 |
| 2015-01-01_01:35:19 | 115 |
| 2015-01-01_01:35:20 | 112 |
| 2015-01-01_01:35:21 | 112 |
| 2015-01-01_01:35:22 | 110 |
| 2015-01-01_01:35:23 | 112 |
| 2015-01-01_01:35:24 | 113 |
| 2015-01-01_01:35:25 | 114 |
| 2015-01-01_01:35:26 | 114 |
| 2015-01-01_01:35:27 | 113 |
| 2015-01-01_01:35:28 | 113 |
| 2015-01-01_01:35:29 | 114 |
| 2015-01-01_01:35:30 | 113 |
| 2015-01-01_01:35:31 | 112 |
| 2015-01-01_01:35:32 | 112 |
| 2015-01-01_01:35:33 | 113 |
| 2015-01-01_01:35:34 | 113 |
| 2015-01-01_01:35:35 | 113 |
| 2015-01-01_01:35:36 | 113 |
| 2015-01-01_01:35:37 | 114 |
| 2015-01-01_01:35:38 | 114 |
| 2015-01-01_01:35:39 | 113 |
| 2015-01-01_01:35:40 | 112 |
| 2015-01-01_01:35:41 | 111 |
| 2015-01-01_01:35:42 | 109 |
| 2015-01-01_01:35:43 | 110 |
| 2015-01-01_01:35:44 | 109 |
| 2015-01-01_01:35:45 | 110 |
| 2015-01-01_01:35:46 | 108 |
| 2015-01-01_01:35:47 | 108 |
| 2015-01-01_01:35:48 | 108 |
| 2015-01-01_01:35:49 | 109 |
| 2015-01-01_01:35:50 | 107 |
| 2015-01-01_01:35:51 | 105 |
| 2015-01-01_01:35:52 | 105 |
| 2015-01-01_01:35:53 | 101 |
| 2015-01-01_01:35:54 | 100 |
| 2015-01-01_01:35:55 | 99 |
| 2015-01-01_01:35:56 | 97 |
| 2015-01-01_01:35:57 | 96 |
| 2015-01-01_01:35:58 | 94 |
| 2015-01-01_01:35:59 | 94 |
| 2015-01-01_01:36:00 | 92 |
| 2015-01-01_01:36:01 | 90 |
| 2015-01-01_01:36:02 | 88 |
| 2015-01-01_01:36:03 | 87 |
| 2015-01-01_01:36:04 | 86 |
| 2015-01-01_01:36:05 | 89 |
| 2015-01-01_01:36:06 | 90 |
| 2015-01-01_01:36:07 | 91 |
| 2015-01-01_01:36:08 | 92 |
| 2015-01-01_01:36:09 | 94 |
| 2015-01-01_01:36:10 | 93 |
| 2015-01-01_01:36:11 | 94 |
| 2015-01-01_01:36:12 | 93 |
| 2015-01-01_01:36:13 | 92 |
| 2015-01-01_01:36:14 | 92 |
| 2015-01-01_01:36:15 | 90 |
| 2015-01-01_01:36:16 | 90 |
| 2015-01-01_01:36:17 | 90 |
| 2015-01-01_01:36:18 | 89 |
| 2015-01-01_01:36:19 | 88 |
| 2015-01-01_01:36:20 | 89 |
| 2015-01-01_01:36:21 | 89 |
| 2015-01-01_01:36:22 | 88 |
| 2015-01-01_01:36:23 | 89 |
| 2015-01-01_01:36:24 | 89 |
| 2015-01-01_01:36:25 | 89 |
| 2015-01-01_01:36:26 | 88 |
| 2015-01-01_01:36:27 | 89 |
| 2015-01-01_01:36:28 | 89 |
| 2015-01-01_01:36:29 | 90 |
| 2015-01-01_01:36:30 | 89 |
| 2015-01-01_01:36:31 | 88 |
| 2015-01-01_01:36:32 | 88 |
| 2015-01-01_01:36:33 | 88 |
| 2015-01-01_01:36:34 | 86 |
| 2015-01-01_01:36:35 | 86 |
| 2015-01-01_01:36:36 | 85 |
| 2015-01-01_01:36:37 | 84 |
| 2015-01-01_01:36:38 | 85 |
| 2015-01-01_01:36:39 | 85 |
| 2015-01-01_01:36:40 | 83 |
| 2015-01-01_01:36:41 | 84 |
| 2015-01-01_01:36:42 | 85 |
| 2015-01-01_01:36:43 | 84 |
| 2015-01-01_01:36:44 | 84 |
| 2015-01-01_01:36:45 | 85 |
| 2015-01-01_01:36:46 | 85 |
| 2015-01-01_01:36:47 | 84 |
| 2015-01-01_01:36:48 | 84 |
| 2015-01-01_01:36:49 | 84 |
| 2015-01-01_01:36:50 | 85 |
| 2015-01-01_01:36:51 | 84 |
| 2015-01-01_01:36:52 | 84 |
| 2015-01-01_01:36:53 | 84 |
| 2015-01-01_01:36:54 | 83 |
| 2015-01-01_01:36:55 | 83 |
| 2015-01-01_01:36:56 | 82 |
| 2015-01-01_01:36:57 | 80 |
| 2015-01-01_01:36:58 | 76 |
| 2015-01-01_01:36:59 | 65 |
| 2015-01-01_01:37:00 | 50 |
| 2015-01-01_01:37:01 | 35 |
| 2015-01-01_01:37:02 | 24 |
| 2015-01-01_01:37:03 | 14 |
| 2015-01-01_01:37:04 | 5 |
| 2015-01-01_01:37:05 | 2 |
| 2015-01-01_01:37:06 | 0 |
| 2015-01-01_01:37:07 | 0 |
| 2015-01-01_01:37:08 | 0 |
| 2015-01-01_01:37:09 | 0 |
| 2015-01-01_01:37:10 | 0 |
| 2015-01-01_01:37:11 | 0 |
| 2015-01-01_01:37:12 | 0 |
| 2015-01-01_01:37:13 | 0 |
| 2015-01-01_01:37:14 | 0 |
| 2015-01-01_01:37:15 | 0 |
| 2015-01-01_01:37:16 | 0 |
| 2015-01-01_01:37:17 | 0 |
| 2015-01-01_01:37:18 | 0 |
| 2015-01-01_01:37:19 | 0 |
| 2015-01-01_01:37:20 | 0 |
| 2015-01-01_01:37:21 | 0 |
| 2015-01-01_01:37:22 | 0 |
| 2015-01-01_01:37:23 | 0 |
| 2015-01-01_01:37:24 | 0 |
| 2015-01-01_01:37:25 | 0 |
| 2015-01-01_01:37:26 | 0 |
| 2015-01-01_01:37:27 | 0 |
| 2015-01-01_01:37:28 | 0 |
| 2015-01-01_01:37:29 | 0 |
| 2015-01-01_01:37:30 | 0 |
| 2015-01-01_01:37:31 | 0 |
| 2015-01-01_01:37:32 | 0 |
| 2015-01-01_01:37:33 | 0 |
| 2015-01-01_01:37:34 | 0 |
| 2015-01-01_01:37:35 | 0 |
| 2015-01-01_01:37:36 | 0 |
| 2015-01-01_01:37:37 | 0 |
| 2015-01-01_01:37:38 | 7 |
| 2015-01-01_01:37:39 | 16 |
| 2015-01-01_01:37:40 | 21 |
| 2015-01-01_01:37:41 | 25 |
| 2015-01-01_01:37:42 | 33 |
| 2015-01-01_01:37:43 | 37 |
| 2015-01-01_01:37:44 | 39 |
| 2015-01-01_01:37:45 | 44 |
| 2015-01-01_01:37:46 | 50 |
| 2015-01-01_01:37:47 | 52 |
| 2015-01-01_01:37:48 | 52 |
| 2015-01-01_01:37:49 | 50 |
| 2015-01-01_01:37:50 | 49 |
| 2015-01-01_01:37:51 | 48 |
| 2015-01-01_01:37:52 | 48 |
| 2015-01-01_01:37:53 | 47 |
| 2015-01-01_01:37:54 | 49 |
| 2015-01-01_01:37:55 | 49 |
| 2015-01-01_01:37:56 | 50 |
| 2015-01-01_01:37:57 | 52 |
| 2015-01-01_01:37:58 | 54 |
| 2015-01-01_01:37:59 | 58 |
| 2015-01-01_01:38:00 | 58 |
| 2015-01-01_01:38:01 | 60 |
| 2015-01-01_01:38:02 | 63 |
| 2015-01-01_01:38:03 | 68 |
| 2015-01-01_01:38:04 | 71 |
| 2015-01-01_01:38:05 | 74 |
| 2015-01-01_01:38:06 | 76 |
| 2015-01-01_01:38:07 | 76 |
| 2015-01-01_01:38:08 | 77 |
| 2015-01-01_01:38:09 | 77 |
| 2015-01-01_01:38:10 | 77 |
| 2015-01-01_01:38:11 | 79 |
| 2015-01-01_01:38:12 | 80 |
| 2015-01-01_01:38:13 | 81 |
| 2015-01-01_01:38:14 | 83 |
| 2015-01-01_01:38:15 | 81 |
| 2015-01-01_01:38:16 | 79 |
| 2015-01-01_01:38:17 | 79 |
| 2015-01-01_01:38:18 | 79 |
| 2015-01-01_01:38:19 | 80 |
| 2015-01-01_01:38:20 | 79 |
| 2015-01-01_01:38:21 | 80 |
| 2015-01-01_01:38:22 | 80 |
| 2015-01-01_01:38:23 | 80 |
| 2015-01-01_01:38:24 | 80 |
| 2015-01-01_01:38:25 | 81 |
| 2015-01-01_01:38:26 | 80 |
| 2015-01-01_01:38:27 | 79 |
| 2015-01-01_01:38:28 | 78 |
| 2015-01-01_01:38:29 | 80 |
| 2015-01-01_01:38:30 | 81 |
| 2015-01-01_01:38:31 | 85 |
| 2015-01-01_01:38:32 | 88 |
| 2015-01-01_01:38:33 | 90 |
| 2015-01-01_01:38:34 | 90 |
| 2015-01-01_01:38:35 | 90 |
| 2015-01-01_01:38:36 | 92 |
| 2015-01-01_01:38:37 | 96 |
| 2015-01-01_01:38:38 | 97 |
| 2015-01-01_01:38:39 | 96 |
| 2015-01-01_01:38:40 | 94 |
| 2015-01-01_01:38:41 | 93 |
| 2015-01-01_01:38:42 | 93 |
| 2015-01-01_01:38:43 | 93 |
| 2015-01-01_01:38:44 | 92 |
| 2015-01-01_01:38:45 | 91 |
| 2015-01-01_01:38:46 | 89 |
| 2015-01-01_01:38:47 | 88 |
| 2015-01-01_01:38:48 | 85 |
| 2015-01-01_01:38:49 | 84 |
| 2015-01-01_01:38:50 | 82 |
| 2015-01-01_01:38:51 | 80 |
| 2015-01-01_01:38:52 | 78 |
| 2015-01-01_01:38:53 | 78 |
| 2015-01-01_01:38:54 | 75 |
| 2015-01-01_01:38:55 | 74 |
| 2015-01-01_01:38:56 | 71 |
| 2015-01-01_01:38:57 | 67 |
| 2015-01-01_01:38:58 | 62 |
| 2015-01-01_01:38:59 | 57 |
| 2015-01-01_01:39:00 | 52 |
| 2015-01-01_01:39:01 | 44 |
| 2015-01-01_01:39:02 | 37 |
| 2015-01-01_01:39:03 | 32 |
| 2015-01-01_01:39:04 | 28 |
| 2015-01-01_01:39:05 | 23 |
| 2015-01-01_01:39:06 | 18 |
| 2015-01-01_01:39:07 | 12 |
| 2015-01-01_01:39:08 | 7 |
| 2015-01-01_01:39:09 | 4 |
| 2015-01-01_01:39:10 | 2 |
| 2015-01-01_01:39:11 | 1 |
| 2015-01-01_01:39:12 | 0 |
| 2015-01-01_01:39:13 | 0 |
| 2015-01-01_01:39:14 | 0 |
| 2015-01-01_01:39:15 | 0 |
| 2015-01-01_01:39:16 | 0 |
| 2015-01-01_01:39:17 | 0 |
| 2015-01-01_01:39:18 | 0 |
| 2015-01-01_01:39:19 | 1 |
| 2015-01-01_01:39:20 | 4 |
| 2015-01-01_01:39:21 | 8 |
| 2015-01-01_01:39:22 | 16 |
| 2015-01-01_01:39:23 | 21 |
| 2015-01-01_01:39:24 | 22 |
| 2015-01-01_01:39:25 | 29 |
| 2015-01-01_01:39:26 | 34 |
| 2015-01-01_01:39:27 | 36 |
| 2015-01-01_01:39:28 | 38 |
| 2015-01-01_01:39:29 | 43 |
| 2015-01-01_01:39:30 | 48 |
| 2015-01-01_01:39:31 | 49 |
| 2015-01-01_01:39:32 | 49 |
| 2015-01-01_01:39:33 | 51 |
| 2015-01-01_01:39:34 | 54 |
| 2015-01-01_01:39:35 | 54 |
| 2015-01-01_01:39:36 | 56 |
| 2015-01-01_01:39:37 | 57 |
| 2015-01-01_01:39:38 | 59 |
| 2015-01-01_01:39:39 | 60 |
| 2015-01-01_01:39:40 | 61 |
| 2015-01-01_01:39:41 | 62 |
| 2015-01-01_01:39:42 | 63 |
| 2015-01-01_01:39:43 | 64 |
| 2015-01-01_01:39:44 | 65 |
| 2015-01-01_01:39:45 | 67 |
| 2015-01-01_01:39:46 | 66 |
| 2015-01-01_01:39:47 | 64 |
| 2015-01-01_01:39:48 | 65 |
| 2015-01-01_01:39:49 | 66 |
| 2015-01-01_01:39:50 | 67 |
| 2015-01-01_01:39:51 | 67 |
| 2015-01-01_01:39:52 | 67 |
| 2015-01-01_01:39:53 | 71 |
| 2015-01-01_01:39:54 | 72 |
| 2015-01-01_01:39:55 | 73 |
| 2015-01-01_01:39:56 | 71 |
| 2015-01-01_01:39:57 | 72 |
| 2015-01-01_01:39:58 | 72 |
| 2015-01-01_01:39:59 | 72 |
| 2015-01-01_01:40:00 | 73 |
| 2015-01-01_01:40:01 | 72 |
| 2015-01-01_01:40:02 | 72 |
| 2015-01-01_01:40:03 | 71 |
| 2015-01-01_01:40:04 | 70 |
| 2015-01-01_01:40:05 | 70 |
| 2015-01-01_01:40:06 | 72 |
| 2015-01-01_01:40:07 | 70 |
| 2015-01-01_01:40:08 | 69 |
| 2015-01-01_01:40:09 | 67 |
| 2015-01-01_01:40:10 | 66 |
| 2015-01-01_01:40:11 | 66 |
| 2015-01-01_01:40:12 | 65 |
| 2015-01-01_01:40:13 | 66 |
| 2015-01-01_01:40:14 | 68 |
| 2015-01-01_01:40:15 | 69 |
| 2015-01-01_01:40:16 | 71 |
| 2015-01-01_01:40:17 | 69 |
| 2015-01-01_01:40:18 | 71 |
| 2015-01-01_01:40:19 | 71 |
| 2015-01-01_01:40:20 | 72 |
| 2015-01-01_01:40:21 | 72 |
| 2015-01-01_01:40:22 | 72 |
| 2015-01-01_01:40:23 | 71 |
| 2015-01-01_01:40:24 | 70 |
| 2015-01-01_01:40:25 | 68 |
| 2015-01-01_01:40:26 | 68 |
| 2015-01-01_01:40:27 | 66 |
| 2015-01-01_01:40:28 | 64 |
| 2015-01-01_01:40:29 | 64 |
| 2015-01-01_01:40:30 | 63 |
| 2015-01-01_01:40:31 | 62 |
| 2015-01-01_01:40:32 | 62 |
| 2015-01-01_01:40:33 | 61 |
| 2015-01-01_01:40:34 | 59 |
| 2015-01-01_01:40:35 | 57 |
| 2015-01-01_01:40:36 | 54 |
| 2015-01-01_01:40:37 | 52 |
| 2015-01-01_01:40:38 | 52 |
| 2015-01-01_01:40:39 | 51 |
| 2015-01-01_01:40:40 | 50 |
| 2015-01-01_01:40:41 | 48 |
| 2015-01-01_01:40:42 | 47 |
| 2015-01-01_01:40:43 | 44 |
| 2015-01-01_01:40:44 | 40 |
| 2015-01-01_01:40:45 | 35 |
| 2015-01-01_01:40:46 | 31 |
| 2015-01-01_01:40:47 | 26 |
| 2015-01-01_01:40:48 | 19 |
| 2015-01-01_01:40:49 | 15 |
| 2015-01-01_01:40:50 | 9 |
| 2015-01-01_01:40:51 | 5 |
| 2015-01-01_01:40:52 | 1 |
| 2015-01-01_01:40:53 | 0 |
| 2015-01-01_01:40:54 | 0 |
| 2015-01-01_01:40:55 | 0 |
| 2015-01-01_01:40:56 | 0 |
| 2015-01-01_01:40:57 | 0 |
| 2015-01-01_01:40:58 | 0 |
| 2015-01-01_01:40:59 | 0 |
| 2015-01-01_01:41:00 | 0 |
| 2015-01-01_01:41:01 | 0 |
| 2015-01-01_01:41:02 | 0 |
| 2015-01-01_01:41:03 | 0 |
| 2015-01-01_01:41:04 | 0 |
| 2015-01-01_01:41:05 | 0 |
| 2015-01-01_01:41:06 | 0 |
| 2015-01-01_01:41:07 | 0 |
| 2015-01-01_01:41:08 | 0 |
| 2015-01-01_01:41:09 | 0 |
| 2015-01-01_01:41:10 | 0 |
| 2015-01-01_01:41:11 | 0 |
| 2015-01-01_01:41:12 | 0 |
| 2015-01-01_01:41:13 | 0 |
| 2015-01-01_01:41:14 | 0 |
| 2015-01-01_01:41:15 | 0 |
| 2015-01-01_01:41:16 | 0 |
| 2015-01-01_01:41:17 | 0 |
| 2015-01-01_01:41:18 | 0 |
| 2015-01-01_01:41:19 | 0 |
| 2015-01-01_01:41:20 | 0 |
| 2015-01-01_01:41:21 | 0 |
| 2015-01-01_01:41:22 | 0 |
| 2015-01-01_01:41:23 | 0 |
| 2015-01-01_01:41:24 | 0 |
| 2015-01-01_01:41:25 | 0 |
| 2015-01-01_01:41:26 | 0 |
| 2015-01-01_01:41:27 | 0 |
| 2015-01-01_01:41:28 | 0 |
| 2015-01-01_01:41:29 | 0 |
| 2015-01-01_01:41:30 | 0 |
| 2015-01-01_01:41:31 | 0 |
| 2015-01-01_01:41:32 | 0 |
| 2015-01-01_01:41:33 | 0 |
| 2015-01-01_01:41:34 | 0 |
| 2015-01-01_01:41:35 | 0 |
| 2015-01-01_01:41:36 | 0 |
| 2015-01-01_01:41:37 | 0 |
| 2015-01-01_01:41:38 | 0 |
| 2015-01-01_01:41:39 | 0 |
| 2015-01-01_01:41:40 | 5 |
| 2015-01-01_01:41:41 | 14 |
| 2015-01-01_01:41:42 | 21 |
| 2015-01-01_01:41:43 | 24 |
| 2015-01-01_01:41:44 | 31 |
| 2015-01-01_01:41:45 | 35 |
| 2015-01-01_01:41:46 | 38 |
| 2015-01-01_01:41:47 | 40 |
| 2015-01-01_01:41:48 | 47 |
| 2015-01-01_01:41:49 | 49 |
| 2015-01-01_01:41:50 | 57 |
| 2015-01-01_01:41:51 | 65 |
| 2015-01-01_01:41:52 | 65 |
| 2015-01-01_01:41:53 | 68 |
| 2015-01-01_01:41:54 | 72 |
| 2015-01-01_01:41:55 | 73 |
| 2015-01-01_01:41:56 | 74 |
| 2015-01-01_01:41:57 | 73 |
| 2015-01-01_01:41:58 | 74 |
| 2015-01-01_01:41:59 | 75 |
| 2015-01-01_01:42:00 | 76 |
| 2015-01-01_01:42:01 | 75 |
| 2015-01-01_01:42:02 | 75 |
| 2015-01-01_01:42:03 | 74 |
| 2015-01-01_01:42:04 | 73 |
| 2015-01-01_01:42:05 | 72 |
| 2015-01-01_01:42:06 | 73 |
| 2015-01-01_01:42:07 | 71 |
| 2015-01-01_01:42:08 | 70 |
| 2015-01-01_01:42:09 | 70 |
| 2015-01-01_01:42:10 | 70 |
| 2015-01-01_01:42:11 | 70 |
| 2015-01-01_01:42:12 | 70 |
| 2015-01-01_01:42:13 | 70 |
| 2015-01-01_01:42:14 | 70 |
| 2015-01-01_01:42:15 | 69 |
| 2015-01-01_01:42:16 | 70 |
| 2015-01-01_01:42:17 | 73 |
| 2015-01-01_01:42:18 | 75 |
| 2015-01-01_01:42:19 | 80 |
| 2015-01-01_01:42:20 | 84 |
| 2015-01-01_01:42:21 | 87 |
| 2015-01-01_01:42:22 | 86 |
| 2015-01-01_01:42:23 | 85 |
| 2015-01-01_01:42:24 | 85 |
| 2015-01-01_01:42:25 | 84 |
| 2015-01-01_01:42:26 | 84 |
| 2015-01-01_01:42:27 | 84 |
| 2015-01-01_01:42:28 | 83 |
| 2015-01-01_01:42:29 | 83 |
| 2015-01-01_01:42:30 | 83 |
| 2015-01-01_01:42:31 | 81 |
| 2015-01-01_01:42:32 | 81 |
| 2015-01-01_01:42:33 | 81 |
| 2015-01-01_01:42:34 | 79 |
| 2015-01-01_01:42:35 | 79 |
| 2015-01-01_01:42:36 | 78 |
| 2015-01-01_01:42:37 | 77 |
| 2015-01-01_01:42:38 | 76 |
| 2015-01-01_01:42:39 | 75 |
| 2015-01-01_01:42:40 | 74 |
| 2015-01-01_01:42:41 | 73 |
| 2015-01-01_01:42:42 | 72 |
| 2015-01-01_01:42:43 | 70 |
| 2015-01-01_01:42:44 | 69 |
| 2015-01-01_01:42:45 | 69 |
| 2015-01-01_01:42:46 | 67 |
| 2015-01-01_01:42:47 | 65 |
| 2015-01-01_01:42:48 | 63 |
| 2015-01-01_01:42:49 | 62 |
| 2015-01-01_01:42:50 | 57 |
| 2015-01-01_01:42:51 | 49 |
| 2015-01-01_01:42:52 | 41 |
| 2015-01-01_01:42:53 | 38 |
| 2015-01-01_01:42:54 | 38 |
| 2015-01-01_01:42:55 | 39 |
| 2015-01-01_01:42:56 | 43 |
| 2015-01-01_01:42:57 | 51 |
| 2015-01-01_01:42:58 | 62 |
| 2015-01-01_01:42:59 | 73 |
| 2015-01-01_01:43:00 | 80 |
| 2015-01-01_01:43:01 | 80 |
| 2015-01-01_01:43:02 | 81 |
| 2015-01-01_01:43:03 | 82 |
| 2015-01-01_01:43:04 | 82 |
| 2015-01-01_01:43:05 | 81 |
| 2015-01-01_01:43:06 | 79 |
| 2015-01-01_01:43:07 | 78 |
| 2015-01-01_01:43:08 | 78 |
| 2015-01-01_01:43:09 | 79 |
| 2015-01-01_01:43:10 | 78 |
| 2015-01-01_01:43:11 | 76 |
| 2015-01-01_01:43:12 | 74 |
| 2015-01-01_01:43:13 | 68 |
| 2015-01-01_01:43:14 | 54 |
| 2015-01-01_01:43:15 | 39 |
| 2015-01-01_01:43:16 | 27 |
| 2015-01-01_01:43:17 | 20 |
| 2015-01-01_01:43:18 | 14 |
| 2015-01-01_01:43:19 | 8 |
| 2015-01-01_01:43:20 | 3 |
| 2015-01-01_01:43:21 | 0 |
| 2015-01-01_01:43:22 | 0 |
| 2015-01-01_01:43:23 | 0 |
| 2015-01-01_01:43:24 | 0 |
| 2015-01-01_01:43:25 | 0 |
| 2015-01-01_01:43:26 | 0 |
| 2015-01-01_01:43:27 | 0 |
| 2015-01-01_01:43:28 | 0 |
| 2015-01-01_01:43:29 | 0 |
| 2015-01-01_01:43:30 | 0 |
| 2015-01-01_01:43:31 | 0 |
| 2015-01-01_01:43:32 | 0 |
| 2015-01-01_01:43:33 | 0 |
| 2015-01-01_01:43:34 | 0 |
| 2015-01-01_01:43:35 | 0 |
| 2015-01-01_01:43:36 | 0 |
| 2015-01-01_01:43:37 | 0 |
| 2015-01-01_01:43:38 | 0 |
| 2015-01-01_01:43:39 | 0 |
| 2015-01-01_01:43:40 | 0 |
| 2015-01-01_01:43:41 | 0 |
| 2015-01-01_01:43:42 | 0 |
| 2015-01-01_01:43:43 | 0 |
| 2015-01-01_01:43:44 | 0 |
| 2015-01-01_01:43:45 | 0 |
| 2015-01-01_01:43:46 | 0 |
| 2015-01-01_01:43:47 | 0 |
| 2015-01-01_01:43:48 | 0 |
| 2015-01-01_01:43:49 | 0 |
| 2015-01-01_01:43:50 | 0 |
| 2015-01-01_01:43:51 | 0 |
| 2015-01-01_01:43:52 | 0 |
| 2015-01-01_01:43:53 | 0 |
| 2015-01-01_01:43:54 | 0 |
| 2015-01-01_01:43:55 | 0 |
| 2015-01-01_01:43:56 | 0 |
| 2015-01-01_01:43:57 | 0 |
| 2015-01-01_01:43:58 | 2 |
| 2015-01-01_01:43:59 | 8 |
| 2015-01-01_01:44:00 | 16 |
| 2015-01-01_01:44:01 | 22 |
| 2015-01-01_01:44:02 | 25 |
| 2015-01-01_01:44:03 | 34 |
| 2015-01-01_01:44:04 | 40 |
| 2015-01-01_01:44:05 | 42 |
| 2015-01-01_01:44:06 | 51 |
| 2015-01-01_01:44:07 | 57 |
| 2015-01-01_01:44:08 | 58 |
| 2015-01-01_01:44:09 | 63 |
| 2015-01-01_01:44:10 | 68 |
| 2015-01-01_01:44:11 | 73 |
| 2015-01-01_01:44:12 | 72 |
| 2015-01-01_01:44:13 | 74 |
| 2015-01-01_01:44:14 | 76 |
| 2015-01-01_01:44:15 | 78 |
| 2015-01-01_01:44:16 | 76 |
| 2015-01-01_01:44:17 | 76 |
| 2015-01-01_01:44:18 | 74 |
| 2015-01-01_01:44:19 | 71 |
| 2015-01-01_01:44:20 | 64 |
| 2015-01-01_01:44:21 | 58 |
| 2015-01-01_01:44:22 | 55 |
| 2015-01-01_01:44:23 | 56 |
| 2015-01-01_01:44:24 | 56 |
| 2015-01-01_01:44:25 | 57 |
| 2015-01-01_01:44:26 | 58 |
| 2015-01-01_01:44:27 | 61 |
| 2015-01-01_01:44:28 | 65 |
| 2015-01-01_01:44:29 | 69 |
| 2015-01-01_01:44:30 | 72 |
| 2015-01-01_01:44:31 | 74 |
| 2015-01-01_01:44:32 | 73 |
| 2015-01-01_01:44:33 | 71 |
| 2015-01-01_01:44:34 | 68 |
| 2015-01-01_01:44:35 | 61 |
| 2015-01-01_01:44:36 | 54 |
| 2015-01-01_01:44:37 | 48 |
| 2015-01-01_01:44:38 | 42 |
| 2015-01-01_01:44:39 | 34 |
| 2015-01-01_01:44:40 | 25 |
| 2015-01-01_01:44:41 | 17 |
| 2015-01-01_01:44:42 | 11 |
| 2015-01-01_01:44:43 | 10 |
| 2015-01-01_01:44:44 | 14 |
| 2015-01-01_01:44:45 | 20 |
| 2015-01-01_01:44:46 | 28 |
| 2015-01-01_01:44:47 | 36 |
| 2015-01-01_01:44:48 | 39 |
| 2015-01-01_01:44:49 | 44 |
| 2015-01-01_01:44:50 | 52 |
| 2015-01-01_01:44:51 | 60 |
| 2015-01-01_01:44:52 | 59 |
| 2015-01-01_01:44:53 | 62 |
| 2015-01-01_01:44:54 | 63 |
| 2015-01-01_01:44:55 | 62 |
| 2015-01-01_01:44:56 | 62 |
| 2015-01-01_01:44:57 | 60 |
| 2015-01-01_01:44:58 | 60 |
| 2015-01-01_01:44:59 | 60 |
| 2015-01-01_01:45:00 | 59 |
| 2015-01-01_01:45:01 | 57 |
| 2015-01-01_01:45:02 | 56 |
| 2015-01-01_01:45:03 | 56 |
| 2015-01-01_01:45:04 | 57 |
| 2015-01-01_01:45:05 | 57 |
| 2015-01-01_01:45:06 | 58 |
| 2015-01-01_01:45:07 | 59 |
| 2015-01-01_01:45:08 | 61 |
| 2015-01-01_01:45:09 | 62 |
| 2015-01-01_01:45:10 | 59 |
| 2015-01-01_01:45:11 | 59 |
| 2015-01-01_01:45:12 | 58 |
| 2015-01-01_01:45:13 | 57 |
| 2015-01-01_01:45:14 | 55 |
| 2015-01-01_01:45:15 | 54 |
| 2015-01-01_01:45:16 | 53 |
| 2015-01-01_01:45:17 | 53 |
| 2015-01-01_01:45:18 | 52 |
| 2015-01-01_01:45:19 | 49 |
| 2015-01-01_01:45:20 | 46 |
| 2015-01-01_01:45:21 | 43 |
| 2015-01-01_01:45:22 | 41 |
| 2015-01-01_01:45:23 | 38 |
| 2015-01-01_01:45:24 | 33 |
| 2015-01-01_01:45:25 | 25 |
| 2015-01-01_01:45:26 | 18 |
| 2015-01-01_01:45:27 | 14 |
| 2015-01-01_01:45:28 | 12 |
| 2015-01-01_01:45:29 | 16 |
| 2015-01-01_01:45:30 | 19 |
| 2015-01-01_01:45:31 | 19 |
| 2015-01-01_01:45:32 | 18 |
| 2015-01-01_01:45:33 | 20 |
| 2015-01-01_01:45:34 | 22 |
| 2015-01-01_01:45:35 | 25 |
| 2015-01-01_01:45:36 | 25 |
| 2015-01-01_01:45:37 | 25 |
| 2015-01-01_01:45:38 | 24 |
| 2015-01-01_01:45:39 | 23 |
| 2015-01-01_01:45:40 | 21 |
| 2015-01-01_01:45:41 | 18 |
| 2015-01-01_01:45:42 | 14 |
| 2015-01-01_01:45:43 | 14 |
| 2015-01-01_01:45:44 | 12 |
| 2015-01-01_01:45:45 | 12 |
| 2015-01-01_01:45:46 | 9 |
| 2015-01-01_01:45:47 | 8 |
| 2015-01-01_01:45:48 | 6 |
| 2015-01-01_01:45:49 | 5 |
| 2015-01-01_01:45:50 | 5 |
| 2015-01-01_01:45:51 | 5 |
| 2015-01-01_01:45:52 | 6 |
| 2015-01-01_01:45:53 | 4 |
| 2015-01-01_01:45:54 | 3 |
| 2015-01-01_01:45:55 | 2 |
| 2015-01-01_01:45:56 | 0 |
| 2015-01-01_01:45:57 | 0 |
| 2015-01-01_01:45:58 | 0 |
| 2015-01-01_01:45:59 | 0 |
| 2015-01-01_01:46:00 | 0 |
| 2015-01-01_01:46:01 | 0 |
| 2015-01-01_01:46:02 | 0 |
| 2015-01-01_01:46:03 | 0 |
| 2015-01-01_01:46:04 | 0 |
| 2015-01-01_01:46:05 | 0 |
| 2015-01-01_01:46:06 | 0 |
| 2015-01-01_01:46:07 | 0 |
| 2015-01-01_01:46:08 | 0 |
| 2015-01-01_01:46:09 | 0 |
| 2015-01-01_01:46:10 | 0 |
| 2015-01-01_01:46:11 | 0 |
| 2015-01-01_01:46:12 | 0 |
| 2015-01-01_01:46:13 | 0 |
| 2015-01-01_01:46:14 | 0 |
| 2015-01-01_01:46:15 | 0 |
| 2015-01-01_01:46:16 | 0 |